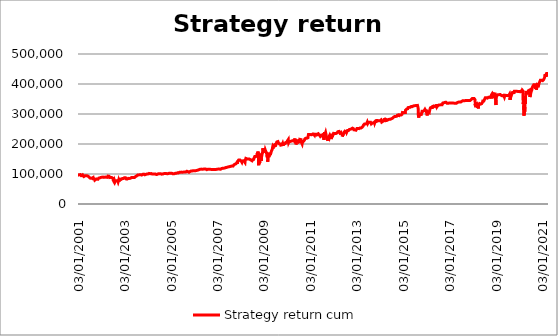
| Category | Strategy return |
|---|---|
| 03/01/2001 | 100000 |
| 04/01/2001 | 100000 |
| 05/01/2001 | 100000 |
| 08/01/2001 | 96560 |
| 09/01/2001 | 96955.896 |
| 10/01/2001 | 96955.896 |
| 11/01/2001 | 96955.896 |
| 12/01/2001 | 96955.896 |
| 16/01/2001 | 96955.896 |
| 17/01/2001 | 96955.896 |
| 18/01/2001 | 96955.896 |
| 19/01/2001 | 96955.896 |
| 22/01/2001 | 96955.896 |
| 23/01/2001 | 97721.848 |
| 24/01/2001 | 97721.848 |
| 25/01/2001 | 97721.848 |
| 26/01/2001 | 97721.848 |
| 29/01/2001 | 97721.848 |
| 30/01/2001 | 97721.848 |
| 31/01/2001 | 97721.848 |
| 01/02/2001 | 97721.848 |
| 02/02/2001 | 98435.217 |
| 05/02/2001 | 98435.217 |
| 06/02/2001 | 99114.42 |
| 07/02/2001 | 99114.42 |
| 08/02/2001 | 99114.42 |
| 09/02/2001 | 97984.516 |
| 12/02/2001 | 96936.081 |
| 13/02/2001 | 97866.668 |
| 14/02/2001 | 97866.668 |
| 15/02/2001 | 97377.334 |
| 16/02/2001 | 98419.272 |
| 20/02/2001 | 98419.272 |
| 21/02/2001 | 96795.354 |
| 22/02/2001 | 94491.624 |
| 23/02/2001 | 94567.218 |
| 26/02/2001 | 94567.218 |
| 27/02/2001 | 96666.61 |
| 28/02/2001 | 96666.61 |
| 01/03/2001 | 94878.278 |
| 02/03/2001 | 95001.619 |
| 05/03/2001 | 95001.619 |
| 06/03/2001 | 95695.131 |
| 07/03/2001 | 95695.131 |
| 08/03/2001 | 95695.131 |
| 09/03/2001 | 95695.131 |
| 12/03/2001 | 95695.131 |
| 13/03/2001 | 91379.281 |
| 14/03/2001 | 92896.177 |
| 15/03/2001 | 92896.177 |
| 16/03/2001 | 93239.893 |
| 19/03/2001 | 93239.893 |
| 20/03/2001 | 94871.591 |
| 21/03/2001 | 94871.591 |
| 22/03/2001 | 93040.569 |
| 23/03/2001 | 91924.082 |
| 26/03/2001 | 94957.577 |
| 27/03/2001 | 94957.577 |
| 28/03/2001 | 94957.577 |
| 29/03/2001 | 94957.577 |
| 30/03/2001 | 95137.997 |
| 02/04/2001 | 95137.997 |
| 03/04/2001 | 95137.997 |
| 04/04/2001 | 91399.073 |
| 05/04/2001 | 91755.53 |
| 06/04/2001 | 91755.53 |
| 09/04/2001 | 91755.53 |
| 10/04/2001 | 92627.207 |
| 11/04/2001 | 92627.207 |
| 12/04/2001 | 92627.207 |
| 16/04/2001 | 92627.207 |
| 17/04/2001 | 92627.207 |
| 18/04/2001 | 93766.522 |
| 19/04/2001 | 93766.522 |
| 20/04/2001 | 93766.522 |
| 23/04/2001 | 93766.522 |
| 24/04/2001 | 91769.295 |
| 25/04/2001 | 91007.61 |
| 26/04/2001 | 92254.414 |
| 27/04/2001 | 92254.414 |
| 30/04/2001 | 92254.414 |
| 01/05/2001 | 92254.414 |
| 02/05/2001 | 92254.414 |
| 03/05/2001 | 92254.414 |
| 04/05/2001 | 92254.414 |
| 07/05/2001 | 93758.161 |
| 08/05/2001 | 93758.161 |
| 09/05/2001 | 93758.161 |
| 10/05/2001 | 93758.161 |
| 11/05/2001 | 94058.187 |
| 14/05/2001 | 94058.187 |
| 15/05/2001 | 94076.999 |
| 16/05/2001 | 94076.999 |
| 17/05/2001 | 94076.999 |
| 18/05/2001 | 94076.999 |
| 21/05/2001 | 94076.999 |
| 22/05/2001 | 94076.999 |
| 23/05/2001 | 94076.999 |
| 24/05/2001 | 94076.999 |
| 25/05/2001 | 94387.453 |
| 29/05/2001 | 94387.453 |
| 30/05/2001 | 93556.843 |
| 31/05/2001 | 92088.001 |
| 01/06/2001 | 92686.573 |
| 04/06/2001 | 92686.573 |
| 05/06/2001 | 92686.573 |
| 06/06/2001 | 92686.573 |
| 07/06/2001 | 92686.573 |
| 08/06/2001 | 92881.215 |
| 11/06/2001 | 92881.215 |
| 12/06/2001 | 92054.572 |
| 13/06/2001 | 91934.901 |
| 14/06/2001 | 91934.901 |
| 15/06/2001 | 89562.98 |
| 18/06/2001 | 89804.8 |
| 19/06/2001 | 89804.8 |
| 20/06/2001 | 90146.059 |
| 21/06/2001 | 90146.059 |
| 22/06/2001 | 90146.059 |
| 25/06/2001 | 90146.059 |
| 26/06/2001 | 89235.583 |
| 27/06/2001 | 88994.647 |
| 28/06/2001 | 88994.647 |
| 29/06/2001 | 88994.647 |
| 02/07/2001 | 88994.647 |
| 03/07/2001 | 88994.647 |
| 05/07/2001 | 88994.647 |
| 06/07/2001 | 88994.647 |
| 09/07/2001 | 86743.083 |
| 10/07/2001 | 87254.867 |
| 11/07/2001 | 87254.867 |
| 12/07/2001 | 87158.887 |
| 13/07/2001 | 87158.887 |
| 16/07/2001 | 87158.887 |
| 17/07/2001 | 87158.887 |
| 18/07/2001 | 87943.317 |
| 19/07/2001 | 87943.317 |
| 20/07/2001 | 88787.572 |
| 23/07/2001 | 88787.572 |
| 24/07/2001 | 86958.548 |
| 25/07/2001 | 85862.871 |
| 26/07/2001 | 86918.984 |
| 27/07/2001 | 86918.984 |
| 30/07/2001 | 86918.984 |
| 31/07/2001 | 86918.984 |
| 01/08/2001 | 86918.984 |
| 02/08/2001 | 86918.984 |
| 03/08/2001 | 86918.984 |
| 06/08/2001 | 86918.984 |
| 07/08/2001 | 85606.507 |
| 08/08/2001 | 85974.615 |
| 09/08/2001 | 85974.615 |
| 10/08/2001 | 86155.162 |
| 13/08/2001 | 86155.162 |
| 14/08/2001 | 86155.162 |
| 15/08/2001 | 86155.162 |
| 16/08/2001 | 86155.162 |
| 17/08/2001 | 86473.936 |
| 20/08/2001 | 86473.936 |
| 21/08/2001 | 87304.086 |
| 22/08/2001 | 87304.086 |
| 23/08/2001 | 88212.048 |
| 24/08/2001 | 88212.048 |
| 27/08/2001 | 88212.048 |
| 28/08/2001 | 88212.048 |
| 29/08/2001 | 86827.119 |
| 30/08/2001 | 85932.8 |
| 31/08/2001 | 84042.278 |
| 04/09/2001 | 84512.915 |
| 05/09/2001 | 84512.915 |
| 06/09/2001 | 84512.915 |
| 07/09/2001 | 84512.915 |
| 10/09/2001 | 82814.206 |
| 17/09/2001 | 83857.665 |
| 18/09/2001 | 83857.665 |
| 19/09/2001 | 83547.391 |
| 20/09/2001 | 83547.391 |
| 21/09/2001 | 80581.459 |
| 24/09/2001 | 79558.074 |
| 25/09/2001 | 82708.574 |
| 26/09/2001 | 82708.574 |
| 27/09/2001 | 82708.574 |
| 28/09/2001 | 82708.574 |
| 01/10/2001 | 82708.574 |
| 02/10/2001 | 82708.574 |
| 03/10/2001 | 82708.574 |
| 04/10/2001 | 82708.574 |
| 05/10/2001 | 82708.574 |
| 08/10/2001 | 82708.574 |
| 09/10/2001 | 82708.574 |
| 10/10/2001 | 82212.323 |
| 11/10/2001 | 84251.188 |
| 12/10/2001 | 84251.188 |
| 15/10/2001 | 84251.188 |
| 16/10/2001 | 84124.811 |
| 17/10/2001 | 84124.811 |
| 18/10/2001 | 84124.811 |
| 19/10/2001 | 83864.024 |
| 22/10/2001 | 83864.024 |
| 23/10/2001 | 83864.024 |
| 24/10/2001 | 83864.024 |
| 25/10/2001 | 83587.273 |
| 26/10/2001 | 83587.273 |
| 29/10/2001 | 83587.273 |
| 30/10/2001 | 83587.273 |
| 31/10/2001 | 82408.693 |
| 01/11/2001 | 82540.547 |
| 02/11/2001 | 82540.547 |
| 05/11/2001 | 82540.547 |
| 06/11/2001 | 82540.547 |
| 07/11/2001 | 82540.547 |
| 08/11/2001 | 82540.547 |
| 09/11/2001 | 82540.547 |
| 12/11/2001 | 82540.547 |
| 13/11/2001 | 82540.547 |
| 14/11/2001 | 84571.044 |
| 15/11/2001 | 84571.044 |
| 16/11/2001 | 84571.044 |
| 19/11/2001 | 84571.044 |
| 20/11/2001 | 85712.753 |
| 21/11/2001 | 85712.753 |
| 23/11/2001 | 85121.335 |
| 26/11/2001 | 86432.204 |
| 27/11/2001 | 86432.204 |
| 28/11/2001 | 86432.204 |
| 29/11/2001 | 86432.204 |
| 30/11/2001 | 87711.4 |
| 03/12/2001 | 87711.4 |
| 04/12/2001 | 87711.4 |
| 05/12/2001 | 89263.892 |
| 06/12/2001 | 89263.892 |
| 07/12/2001 | 89263.892 |
| 10/12/2001 | 89263.892 |
| 11/12/2001 | 87469.688 |
| 12/12/2001 | 87242.267 |
| 13/12/2001 | 87242.267 |
| 14/12/2001 | 87242.267 |
| 17/12/2001 | 88062.344 |
| 18/12/2001 | 88062.344 |
| 19/12/2001 | 88062.344 |
| 20/12/2001 | 88062.344 |
| 21/12/2001 | 88062.344 |
| 24/12/2001 | 88590.718 |
| 26/12/2001 | 88590.718 |
| 27/12/2001 | 88590.718 |
| 28/12/2001 | 88590.718 |
| 31/12/2001 | 88590.718 |
| 02/01/2002 | 88590.718 |
| 03/01/2002 | 88989.376 |
| 04/01/2002 | 88989.376 |
| 07/01/2002 | 88989.376 |
| 08/01/2002 | 88989.376 |
| 09/01/2002 | 88695.711 |
| 10/01/2002 | 88695.711 |
| 11/01/2002 | 89077.103 |
| 14/01/2002 | 89077.103 |
| 15/01/2002 | 88435.748 |
| 16/01/2002 | 89178.608 |
| 17/01/2002 | 89178.608 |
| 18/01/2002 | 89900.955 |
| 22/01/2002 | 89900.955 |
| 23/01/2002 | 89226.698 |
| 24/01/2002 | 89904.82 |
| 25/01/2002 | 89904.82 |
| 28/01/2002 | 89904.82 |
| 29/01/2002 | 89904.82 |
| 30/01/2002 | 89904.82 |
| 31/01/2002 | 91253.393 |
| 01/02/2002 | 91253.393 |
| 04/02/2002 | 91253.393 |
| 05/02/2002 | 88725.674 |
| 06/02/2002 | 88166.702 |
| 07/02/2002 | 87655.335 |
| 08/02/2002 | 87094.341 |
| 11/02/2002 | 88836.228 |
| 12/02/2002 | 88836.228 |
| 13/02/2002 | 88836.228 |
| 14/02/2002 | 88836.228 |
| 15/02/2002 | 88836.228 |
| 19/02/2002 | 88836.228 |
| 20/02/2002 | 86970.667 |
| 21/02/2002 | 88501.351 |
| 22/02/2002 | 88501.351 |
| 25/02/2002 | 89660.718 |
| 26/02/2002 | 89660.718 |
| 27/02/2002 | 89660.718 |
| 28/02/2002 | 89660.718 |
| 01/03/2002 | 89660.718 |
| 04/03/2002 | 89660.718 |
| 05/03/2002 | 89660.718 |
| 06/03/2002 | 89660.718 |
| 07/03/2002 | 89660.718 |
| 08/03/2002 | 89660.718 |
| 11/03/2002 | 89660.718 |
| 12/03/2002 | 89660.718 |
| 13/03/2002 | 89660.718 |
| 14/03/2002 | 89660.718 |
| 15/03/2002 | 89508.295 |
| 18/03/2002 | 89508.295 |
| 19/03/2002 | 89508.295 |
| 20/03/2002 | 89508.295 |
| 21/03/2002 | 89508.295 |
| 22/03/2002 | 89553.049 |
| 25/03/2002 | 89553.049 |
| 26/03/2002 | 89553.049 |
| 27/03/2002 | 90099.323 |
| 28/03/2002 | 90099.323 |
| 01/04/2002 | 90099.323 |
| 02/04/2002 | 90099.323 |
| 03/04/2002 | 90099.323 |
| 04/04/2002 | 89423.578 |
| 05/04/2002 | 89030.114 |
| 08/04/2002 | 89030.114 |
| 09/04/2002 | 89030.114 |
| 10/04/2002 | 89030.114 |
| 11/04/2002 | 90036.155 |
| 12/04/2002 | 90036.155 |
| 15/04/2002 | 90756.444 |
| 16/04/2002 | 90756.444 |
| 17/04/2002 | 93070.733 |
| 18/04/2002 | 93070.733 |
| 19/04/2002 | 93070.733 |
| 22/04/2002 | 93405.788 |
| 23/04/2002 | 93405.788 |
| 24/04/2002 | 92938.759 |
| 25/04/2002 | 91869.963 |
| 26/04/2002 | 91943.459 |
| 29/04/2002 | 91943.459 |
| 30/04/2002 | 91281.466 |
| 01/05/2002 | 92449.869 |
| 02/05/2002 | 92449.869 |
| 03/05/2002 | 92449.869 |
| 06/05/2002 | 92449.869 |
| 07/05/2002 | 90415.972 |
| 08/05/2002 | 90009.1 |
| 09/05/2002 | 90009.1 |
| 10/05/2002 | 90009.1 |
| 13/05/2002 | 88154.913 |
| 14/05/2002 | 90156.029 |
| 15/05/2002 | 90156.029 |
| 16/05/2002 | 90156.029 |
| 17/05/2002 | 90156.029 |
| 20/05/2002 | 90156.029 |
| 21/05/2002 | 90156.029 |
| 22/05/2002 | 89200.375 |
| 23/05/2002 | 89378.776 |
| 24/05/2002 | 89378.776 |
| 28/05/2002 | 89378.776 |
| 29/05/2002 | 88833.565 |
| 30/05/2002 | 88034.063 |
| 31/05/2002 | 87849.192 |
| 03/06/2002 | 87849.192 |
| 04/06/2002 | 87849.192 |
| 05/06/2002 | 88103.954 |
| 06/06/2002 | 88103.954 |
| 07/06/2002 | 88103.954 |
| 10/06/2002 | 87980.609 |
| 11/06/2002 | 87980.609 |
| 12/06/2002 | 87980.609 |
| 13/06/2002 | 88561.281 |
| 14/06/2002 | 88561.281 |
| 17/06/2002 | 88393.014 |
| 18/06/2002 | 88393.014 |
| 19/06/2002 | 88393.014 |
| 20/06/2002 | 88393.014 |
| 21/06/2002 | 87182.03 |
| 24/06/2002 | 85656.345 |
| 25/06/2002 | 86136.02 |
| 26/06/2002 | 86136.02 |
| 27/06/2002 | 86161.861 |
| 28/06/2002 | 86161.861 |
| 01/07/2002 | 86161.861 |
| 02/07/2002 | 86161.861 |
| 03/07/2002 | 83964.734 |
| 05/07/2002 | 84535.694 |
| 08/07/2002 | 84535.694 |
| 09/07/2002 | 84535.694 |
| 10/07/2002 | 82185.601 |
| 11/07/2002 | 78791.336 |
| 12/07/2002 | 79563.491 |
| 15/07/2002 | 79563.491 |
| 16/07/2002 | 79881.745 |
| 17/07/2002 | 79881.745 |
| 18/07/2002 | 80057.485 |
| 19/07/2002 | 80057.485 |
| 22/07/2002 | 76783.134 |
| 23/07/2002 | 74256.969 |
| 24/07/2002 | 71865.894 |
| 25/07/2002 | 76781.522 |
| 26/07/2002 | 76781.522 |
| 29/07/2002 | 78570.531 |
| 30/07/2002 | 78570.531 |
| 31/07/2002 | 78570.531 |
| 01/08/2002 | 78570.531 |
| 02/08/2002 | 78570.531 |
| 05/08/2002 | 76653.41 |
| 06/08/2002 | 73525.951 |
| 07/08/2002 | 76253.764 |
| 08/08/2002 | 76253.764 |
| 09/08/2002 | 76253.764 |
| 12/08/2002 | 76253.764 |
| 13/08/2002 | 76253.764 |
| 14/08/2002 | 74599.057 |
| 15/08/2002 | 77732.217 |
| 16/08/2002 | 77732.217 |
| 19/08/2002 | 77732.217 |
| 20/08/2002 | 77732.217 |
| 21/08/2002 | 77732.217 |
| 22/08/2002 | 78898.201 |
| 23/08/2002 | 78898.201 |
| 26/08/2002 | 78898.201 |
| 27/08/2002 | 79513.607 |
| 28/08/2002 | 79513.607 |
| 29/08/2002 | 77597.329 |
| 30/08/2002 | 77550.77 |
| 03/09/2002 | 77550.77 |
| 04/09/2002 | 77550.77 |
| 05/09/2002 | 78752.807 |
| 06/09/2002 | 78752.807 |
| 09/09/2002 | 79894.723 |
| 10/09/2002 | 79894.723 |
| 11/09/2002 | 79894.723 |
| 12/09/2002 | 79894.723 |
| 13/09/2002 | 78224.923 |
| 16/09/2002 | 78397.018 |
| 17/09/2002 | 78397.018 |
| 18/09/2002 | 78397.018 |
| 19/09/2002 | 77503.292 |
| 20/09/2002 | 75255.697 |
| 23/09/2002 | 75308.376 |
| 24/09/2002 | 75308.376 |
| 25/09/2002 | 73885.047 |
| 26/09/2002 | 76005.548 |
| 27/09/2002 | 76005.548 |
| 30/09/2002 | 76005.548 |
| 01/10/2002 | 74918.669 |
| 02/10/2002 | 79039.196 |
| 03/10/2002 | 79039.196 |
| 04/10/2002 | 77948.455 |
| 07/10/2002 | 76342.717 |
| 08/10/2002 | 74457.051 |
| 09/10/2002 | 75819.615 |
| 10/10/2002 | 75819.615 |
| 11/10/2002 | 78609.777 |
| 14/10/2002 | 78609.777 |
| 15/10/2002 | 78609.777 |
| 16/10/2002 | 78609.777 |
| 17/10/2002 | 78609.777 |
| 18/10/2002 | 80347.053 |
| 21/10/2002 | 80347.053 |
| 22/10/2002 | 80347.053 |
| 23/10/2002 | 80347.053 |
| 24/10/2002 | 81038.038 |
| 25/10/2002 | 81038.038 |
| 28/10/2002 | 82950.536 |
| 29/10/2002 | 82950.536 |
| 30/10/2002 | 81872.179 |
| 31/10/2002 | 82740.024 |
| 01/11/2002 | 82740.024 |
| 04/11/2002 | 84121.782 |
| 05/11/2002 | 84121.782 |
| 06/11/2002 | 84121.782 |
| 07/11/2002 | 84121.782 |
| 08/11/2002 | 84121.782 |
| 11/11/2002 | 82960.902 |
| 12/11/2002 | 81509.086 |
| 13/11/2002 | 82250.819 |
| 14/11/2002 | 82250.819 |
| 15/11/2002 | 82250.819 |
| 18/11/2002 | 82250.819 |
| 19/11/2002 | 82250.819 |
| 20/11/2002 | 82045.192 |
| 21/11/2002 | 82045.192 |
| 22/11/2002 | 82045.192 |
| 25/11/2002 | 82045.192 |
| 26/11/2002 | 82143.646 |
| 27/11/2002 | 82143.646 |
| 29/11/2002 | 84846.172 |
| 02/12/2002 | 84846.172 |
| 03/12/2002 | 84846.172 |
| 04/12/2002 | 84846.172 |
| 05/12/2002 | 84354.064 |
| 06/12/2002 | 83265.896 |
| 09/12/2002 | 83807.125 |
| 10/12/2002 | 83807.125 |
| 11/12/2002 | 85148.039 |
| 12/12/2002 | 85148.039 |
| 13/12/2002 | 85148.039 |
| 16/12/2002 | 85148.039 |
| 17/12/2002 | 87625.847 |
| 18/12/2002 | 87625.847 |
| 19/12/2002 | 86469.186 |
| 20/12/2002 | 85725.551 |
| 23/12/2002 | 87045.724 |
| 24/12/2002 | 87045.724 |
| 26/12/2002 | 87045.724 |
| 27/12/2002 | 86958.678 |
| 30/12/2002 | 86958.678 |
| 31/12/2002 | 87610.868 |
| 02/01/2003 | 87610.868 |
| 03/01/2003 | 87610.868 |
| 06/01/2003 | 87610.868 |
| 07/01/2003 | 87610.868 |
| 08/01/2003 | 87610.868 |
| 09/01/2003 | 87610.868 |
| 10/01/2003 | 89214.147 |
| 13/01/2003 | 89214.147 |
| 14/01/2003 | 89214.147 |
| 15/01/2003 | 89214.147 |
| 16/01/2003 | 89214.147 |
| 17/01/2003 | 88723.469 |
| 21/01/2003 | 87250.66 |
| 22/01/2003 | 85662.698 |
| 23/01/2003 | 84463.42 |
| 24/01/2003 | 85063.11 |
| 27/01/2003 | 85063.11 |
| 28/01/2003 | 83600.025 |
| 29/01/2003 | 84419.305 |
| 30/01/2003 | 84419.305 |
| 31/01/2003 | 84419.305 |
| 03/02/2003 | 86116.133 |
| 04/02/2003 | 86116.133 |
| 05/02/2003 | 86116.133 |
| 06/02/2003 | 85564.99 |
| 07/02/2003 | 85102.939 |
| 10/02/2003 | 83945.539 |
| 11/02/2003 | 84583.525 |
| 12/02/2003 | 84583.525 |
| 13/02/2003 | 83069.48 |
| 14/02/2003 | 83335.302 |
| 18/02/2003 | 83335.302 |
| 19/02/2003 | 83335.302 |
| 20/02/2003 | 83335.302 |
| 21/02/2003 | 82435.281 |
| 24/02/2003 | 83391.53 |
| 25/02/2003 | 83391.53 |
| 26/02/2003 | 84225.446 |
| 27/02/2003 | 84225.446 |
| 28/02/2003 | 85446.715 |
| 03/03/2003 | 85446.715 |
| 04/03/2003 | 85446.715 |
| 05/03/2003 | 83900.129 |
| 06/03/2003 | 84747.52 |
| 07/03/2003 | 84747.52 |
| 10/03/2003 | 85544.147 |
| 11/03/2003 | 85544.147 |
| 12/03/2003 | 84628.825 |
| 13/03/2003 | 85297.392 |
| 14/03/2003 | 85297.392 |
| 17/03/2003 | 85297.392 |
| 18/03/2003 | 85297.392 |
| 19/03/2003 | 85297.392 |
| 20/03/2003 | 85297.392 |
| 21/03/2003 | 85297.392 |
| 24/03/2003 | 85297.392 |
| 25/03/2003 | 85297.392 |
| 26/03/2003 | 86278.312 |
| 27/03/2003 | 86278.312 |
| 28/03/2003 | 86217.918 |
| 31/03/2003 | 86217.918 |
| 01/04/2003 | 84398.72 |
| 02/04/2003 | 85504.343 |
| 03/04/2003 | 85504.343 |
| 04/04/2003 | 85504.343 |
| 07/04/2003 | 86085.772 |
| 08/04/2003 | 86085.772 |
| 09/04/2003 | 86085.772 |
| 10/04/2003 | 86085.772 |
| 11/04/2003 | 86653.938 |
| 14/04/2003 | 86653.938 |
| 15/04/2003 | 86653.938 |
| 16/04/2003 | 86653.938 |
| 17/04/2003 | 86653.938 |
| 21/04/2003 | 88049.067 |
| 22/04/2003 | 88049.067 |
| 23/04/2003 | 88049.067 |
| 24/04/2003 | 88049.067 |
| 25/04/2003 | 88049.067 |
| 28/04/2003 | 86816.38 |
| 29/04/2003 | 88457.209 |
| 30/04/2003 | 88457.209 |
| 01/05/2003 | 88457.209 |
| 02/05/2003 | 88457.209 |
| 05/05/2003 | 88457.209 |
| 06/05/2003 | 88457.209 |
| 07/05/2003 | 88457.209 |
| 08/05/2003 | 88457.209 |
| 09/05/2003 | 87493.026 |
| 12/05/2003 | 88752.925 |
| 13/05/2003 | 88752.925 |
| 14/05/2003 | 88752.925 |
| 15/05/2003 | 88752.925 |
| 16/05/2003 | 88752.925 |
| 19/05/2003 | 88752.925 |
| 20/05/2003 | 88752.925 |
| 21/05/2003 | 88397.914 |
| 22/05/2003 | 88397.914 |
| 23/05/2003 | 88397.914 |
| 27/05/2003 | 88397.914 |
| 28/05/2003 | 88397.914 |
| 29/05/2003 | 88397.914 |
| 30/05/2003 | 88397.914 |
| 02/06/2003 | 88397.914 |
| 03/06/2003 | 88397.914 |
| 04/06/2003 | 88397.914 |
| 05/06/2003 | 88397.914 |
| 06/06/2003 | 88397.914 |
| 09/06/2003 | 88397.914 |
| 10/06/2003 | 88397.914 |
| 11/06/2003 | 89387.97 |
| 12/06/2003 | 89387.97 |
| 13/06/2003 | 89387.97 |
| 16/06/2003 | 89387.97 |
| 17/06/2003 | 91479.649 |
| 18/06/2003 | 91479.649 |
| 19/06/2003 | 91479.649 |
| 20/06/2003 | 91479.649 |
| 23/06/2003 | 91250.95 |
| 24/06/2003 | 91250.95 |
| 25/06/2003 | 91305.7 |
| 26/06/2003 | 91305.7 |
| 27/06/2003 | 92510.936 |
| 30/06/2003 | 92510.936 |
| 01/07/2003 | 92510.936 |
| 02/07/2003 | 92510.936 |
| 03/07/2003 | 92510.936 |
| 07/07/2003 | 92510.936 |
| 08/07/2003 | 94610.934 |
| 09/07/2003 | 94610.934 |
| 10/07/2003 | 94610.934 |
| 11/07/2003 | 93324.225 |
| 14/07/2003 | 94220.138 |
| 15/07/2003 | 94220.138 |
| 16/07/2003 | 94220.138 |
| 17/07/2003 | 94220.138 |
| 18/07/2003 | 92712.615 |
| 21/07/2003 | 93741.725 |
| 22/07/2003 | 93741.725 |
| 23/07/2003 | 94679.143 |
| 24/07/2003 | 94679.143 |
| 25/07/2003 | 94679.143 |
| 28/07/2003 | 96459.111 |
| 29/07/2003 | 96459.111 |
| 30/07/2003 | 96459.111 |
| 31/07/2003 | 96189.025 |
| 01/08/2003 | 96189.025 |
| 04/08/2003 | 96189.025 |
| 05/08/2003 | 96275.595 |
| 06/08/2003 | 96275.595 |
| 07/08/2003 | 96891.759 |
| 08/08/2003 | 96891.759 |
| 11/08/2003 | 96891.759 |
| 12/08/2003 | 96891.759 |
| 13/08/2003 | 96891.759 |
| 14/08/2003 | 96891.759 |
| 15/08/2003 | 97221.191 |
| 18/08/2003 | 97221.191 |
| 19/08/2003 | 97221.191 |
| 20/08/2003 | 97221.191 |
| 21/08/2003 | 97221.191 |
| 22/08/2003 | 97221.191 |
| 25/08/2003 | 97221.191 |
| 26/08/2003 | 97357.301 |
| 27/08/2003 | 97357.301 |
| 28/08/2003 | 97357.301 |
| 29/08/2003 | 97357.301 |
| 02/09/2003 | 97357.301 |
| 03/09/2003 | 97357.301 |
| 04/09/2003 | 97357.301 |
| 05/09/2003 | 97357.301 |
| 08/09/2003 | 97357.301 |
| 09/09/2003 | 98233.516 |
| 10/09/2003 | 98233.516 |
| 11/09/2003 | 97113.654 |
| 12/09/2003 | 97463.263 |
| 15/09/2003 | 97463.263 |
| 16/09/2003 | 97463.263 |
| 17/09/2003 | 97463.263 |
| 18/09/2003 | 97463.263 |
| 19/09/2003 | 97463.263 |
| 22/09/2003 | 97463.263 |
| 23/09/2003 | 97463.263 |
| 24/09/2003 | 97911.594 |
| 25/09/2003 | 97911.594 |
| 26/09/2003 | 96883.523 |
| 29/09/2003 | 96534.742 |
| 30/09/2003 | 96534.742 |
| 01/10/2003 | 96534.742 |
| 02/10/2003 | 98967.418 |
| 03/10/2003 | 98967.418 |
| 06/10/2003 | 98967.418 |
| 07/10/2003 | 98967.418 |
| 08/10/2003 | 98967.418 |
| 09/10/2003 | 98967.418 |
| 10/10/2003 | 98967.418 |
| 13/10/2003 | 98967.418 |
| 14/10/2003 | 98967.418 |
| 15/10/2003 | 98967.418 |
| 16/10/2003 | 98967.418 |
| 17/10/2003 | 98967.418 |
| 20/10/2003 | 98967.418 |
| 21/10/2003 | 99759.157 |
| 22/10/2003 | 99759.157 |
| 23/10/2003 | 99759.157 |
| 24/10/2003 | 99539.687 |
| 27/10/2003 | 99539.687 |
| 28/10/2003 | 99539.687 |
| 29/10/2003 | 99539.687 |
| 30/10/2003 | 99539.687 |
| 31/10/2003 | 99539.687 |
| 03/11/2003 | 99539.687 |
| 04/11/2003 | 99539.687 |
| 05/11/2003 | 99539.687 |
| 06/11/2003 | 99539.687 |
| 07/11/2003 | 99539.687 |
| 10/11/2003 | 99539.687 |
| 11/11/2003 | 99091.758 |
| 12/11/2003 | 99091.758 |
| 13/11/2003 | 99091.758 |
| 14/11/2003 | 99091.758 |
| 17/11/2003 | 99091.758 |
| 18/11/2003 | 98517.026 |
| 19/11/2003 | 97393.932 |
| 20/11/2003 | 98260.738 |
| 21/11/2003 | 98260.738 |
| 24/11/2003 | 98712.737 |
| 25/11/2003 | 98712.737 |
| 26/11/2003 | 98712.737 |
| 28/11/2003 | 98712.737 |
| 01/12/2003 | 98712.737 |
| 02/12/2003 | 98712.737 |
| 03/12/2003 | 98712.737 |
| 04/12/2003 | 98712.737 |
| 05/12/2003 | 98712.737 |
| 08/12/2003 | 98712.737 |
| 09/12/2003 | 99403.726 |
| 10/12/2003 | 99403.726 |
| 11/12/2003 | 99433.548 |
| 12/12/2003 | 99433.548 |
| 15/12/2003 | 99433.548 |
| 16/12/2003 | 99433.548 |
| 17/12/2003 | 100079.866 |
| 18/12/2003 | 100079.866 |
| 19/12/2003 | 100079.866 |
| 22/12/2003 | 100079.866 |
| 23/12/2003 | 100079.866 |
| 24/12/2003 | 100079.866 |
| 26/12/2003 | 100079.866 |
| 29/12/2003 | 100079.866 |
| 30/12/2003 | 100079.866 |
| 31/12/2003 | 100079.866 |
| 02/01/2004 | 100079.866 |
| 05/01/2004 | 100079.866 |
| 06/01/2004 | 100079.866 |
| 07/01/2004 | 100079.866 |
| 08/01/2004 | 100079.866 |
| 09/01/2004 | 100079.866 |
| 12/01/2004 | 100079.866 |
| 13/01/2004 | 100890.513 |
| 14/01/2004 | 100890.513 |
| 15/01/2004 | 101879.24 |
| 16/01/2004 | 101879.24 |
| 20/01/2004 | 101879.24 |
| 21/01/2004 | 101879.24 |
| 22/01/2004 | 101879.24 |
| 23/01/2004 | 101879.24 |
| 26/01/2004 | 101879.24 |
| 27/01/2004 | 101879.24 |
| 28/01/2004 | 101879.24 |
| 29/01/2004 | 100585.373 |
| 30/01/2004 | 100685.959 |
| 02/02/2004 | 100685.959 |
| 03/02/2004 | 100685.959 |
| 04/02/2004 | 100685.959 |
| 05/02/2004 | 100685.959 |
| 06/02/2004 | 100927.605 |
| 09/02/2004 | 100927.605 |
| 10/02/2004 | 100927.605 |
| 11/02/2004 | 100927.605 |
| 12/02/2004 | 100927.605 |
| 13/02/2004 | 100927.605 |
| 17/02/2004 | 100927.605 |
| 18/02/2004 | 101967.159 |
| 19/02/2004 | 101967.159 |
| 20/02/2004 | 101579.684 |
| 23/02/2004 | 101579.684 |
| 24/02/2004 | 101579.684 |
| 25/02/2004 | 101579.684 |
| 26/02/2004 | 101579.684 |
| 27/02/2004 | 101579.684 |
| 01/03/2004 | 101579.684 |
| 02/03/2004 | 101579.684 |
| 03/03/2004 | 101579.684 |
| 04/03/2004 | 101752.369 |
| 05/03/2004 | 101752.369 |
| 08/03/2004 | 101752.369 |
| 09/03/2004 | 101752.369 |
| 10/03/2004 | 101314.834 |
| 11/03/2004 | 101314.834 |
| 12/03/2004 | 99845.769 |
| 15/03/2004 | 101213.656 |
| 16/03/2004 | 101213.656 |
| 17/03/2004 | 101739.967 |
| 18/03/2004 | 101739.967 |
| 19/03/2004 | 101739.967 |
| 22/03/2004 | 101739.967 |
| 23/03/2004 | 100325.782 |
| 24/03/2004 | 100125.13 |
| 25/03/2004 | 100125.13 |
| 26/03/2004 | 100125.13 |
| 29/03/2004 | 100125.13 |
| 30/03/2004 | 100125.13 |
| 31/03/2004 | 100125.13 |
| 01/04/2004 | 100125.13 |
| 02/04/2004 | 100125.13 |
| 05/04/2004 | 100125.13 |
| 06/04/2004 | 100125.13 |
| 07/04/2004 | 100125.13 |
| 08/04/2004 | 100125.13 |
| 12/04/2004 | 100125.13 |
| 13/04/2004 | 100125.13 |
| 14/04/2004 | 100125.13 |
| 15/04/2004 | 100275.318 |
| 16/04/2004 | 100275.318 |
| 19/04/2004 | 100275.318 |
| 20/04/2004 | 100275.318 |
| 21/04/2004 | 100275.318 |
| 22/04/2004 | 101067.493 |
| 23/04/2004 | 101067.493 |
| 26/04/2004 | 101067.493 |
| 27/04/2004 | 101067.493 |
| 28/04/2004 | 101067.493 |
| 29/04/2004 | 101067.493 |
| 30/04/2004 | 100127.565 |
| 03/05/2004 | 99336.557 |
| 04/05/2004 | 100319.989 |
| 05/05/2004 | 100319.989 |
| 06/05/2004 | 100319.989 |
| 07/05/2004 | 100319.989 |
| 10/05/2004 | 98584.453 |
| 11/05/2004 | 97401.44 |
| 12/05/2004 | 98268.313 |
| 13/05/2004 | 98268.313 |
| 14/05/2004 | 98268.313 |
| 17/05/2004 | 98366.581 |
| 18/05/2004 | 98366.581 |
| 19/05/2004 | 98838.741 |
| 20/05/2004 | 98838.741 |
| 21/05/2004 | 98838.741 |
| 24/05/2004 | 98838.741 |
| 25/05/2004 | 98838.741 |
| 26/05/2004 | 98838.741 |
| 27/05/2004 | 98838.741 |
| 28/05/2004 | 98838.741 |
| 01/06/2004 | 98838.741 |
| 02/06/2004 | 98838.741 |
| 03/06/2004 | 98838.741 |
| 04/06/2004 | 98838.741 |
| 07/06/2004 | 99639.335 |
| 08/06/2004 | 99639.335 |
| 09/06/2004 | 99639.335 |
| 10/06/2004 | 99639.335 |
| 14/06/2004 | 100117.603 |
| 15/06/2004 | 100117.603 |
| 16/06/2004 | 100948.579 |
| 17/06/2004 | 100948.579 |
| 18/06/2004 | 100948.579 |
| 21/06/2004 | 100948.579 |
| 22/06/2004 | 100948.579 |
| 23/06/2004 | 100948.579 |
| 24/06/2004 | 100948.579 |
| 25/06/2004 | 100948.579 |
| 28/06/2004 | 100948.579 |
| 29/06/2004 | 100605.354 |
| 30/06/2004 | 100605.354 |
| 01/07/2004 | 100605.354 |
| 02/07/2004 | 100605.354 |
| 06/07/2004 | 100555.052 |
| 07/07/2004 | 100555.052 |
| 08/07/2004 | 100856.717 |
| 09/07/2004 | 100856.717 |
| 12/07/2004 | 101058.43 |
| 13/07/2004 | 101058.43 |
| 14/07/2004 | 101058.43 |
| 15/07/2004 | 101058.43 |
| 16/07/2004 | 101058.43 |
| 19/07/2004 | 100987.689 |
| 20/07/2004 | 100987.689 |
| 21/07/2004 | 100987.689 |
| 22/07/2004 | 100987.689 |
| 23/07/2004 | 101320.949 |
| 26/07/2004 | 101320.949 |
| 27/07/2004 | 101067.646 |
| 28/07/2004 | 101067.646 |
| 29/07/2004 | 101067.646 |
| 30/07/2004 | 101067.646 |
| 02/08/2004 | 101067.646 |
| 03/08/2004 | 101067.646 |
| 04/08/2004 | 101067.646 |
| 05/08/2004 | 101037.326 |
| 06/08/2004 | 101037.326 |
| 09/08/2004 | 99491.455 |
| 10/08/2004 | 99571.048 |
| 11/08/2004 | 99571.048 |
| 12/08/2004 | 99571.048 |
| 13/08/2004 | 99571.048 |
| 16/08/2004 | 99829.933 |
| 17/08/2004 | 99829.933 |
| 18/08/2004 | 99829.933 |
| 19/08/2004 | 99829.933 |
| 20/08/2004 | 99829.933 |
| 23/08/2004 | 99829.933 |
| 24/08/2004 | 99829.933 |
| 25/08/2004 | 99829.933 |
| 26/08/2004 | 99829.933 |
| 27/08/2004 | 99829.933 |
| 30/08/2004 | 99829.933 |
| 31/08/2004 | 99829.933 |
| 01/09/2004 | 100329.082 |
| 02/09/2004 | 100329.082 |
| 03/09/2004 | 100329.082 |
| 07/09/2004 | 100329.082 |
| 08/09/2004 | 101091.584 |
| 09/09/2004 | 101091.584 |
| 10/09/2004 | 101091.584 |
| 13/09/2004 | 101091.584 |
| 14/09/2004 | 101091.584 |
| 15/09/2004 | 101091.584 |
| 16/09/2004 | 101091.584 |
| 17/09/2004 | 101465.622 |
| 20/09/2004 | 101465.622 |
| 21/09/2004 | 101465.622 |
| 22/09/2004 | 101962.804 |
| 23/09/2004 | 101962.804 |
| 24/09/2004 | 101381.616 |
| 27/09/2004 | 101807.419 |
| 28/09/2004 | 101807.419 |
| 29/09/2004 | 102265.552 |
| 30/09/2004 | 102265.552 |
| 01/10/2004 | 102265.552 |
| 04/10/2004 | 102265.552 |
| 05/10/2004 | 102265.552 |
| 06/10/2004 | 102265.552 |
| 07/10/2004 | 102265.552 |
| 08/10/2004 | 102265.552 |
| 11/10/2004 | 101324.709 |
| 12/10/2004 | 101719.875 |
| 13/10/2004 | 101719.875 |
| 14/10/2004 | 101719.875 |
| 15/10/2004 | 100794.225 |
| 18/10/2004 | 101318.354 |
| 19/10/2004 | 101318.354 |
| 20/10/2004 | 101318.354 |
| 21/10/2004 | 101146.113 |
| 22/10/2004 | 101146.113 |
| 25/10/2004 | 101146.113 |
| 26/10/2004 | 101065.196 |
| 27/10/2004 | 101065.196 |
| 28/10/2004 | 101065.196 |
| 29/10/2004 | 101065.196 |
| 01/11/2004 | 101065.196 |
| 02/11/2004 | 101065.196 |
| 03/11/2004 | 101065.196 |
| 04/11/2004 | 101065.196 |
| 05/11/2004 | 101065.196 |
| 08/11/2004 | 101065.196 |
| 09/11/2004 | 101065.196 |
| 10/11/2004 | 101065.196 |
| 11/11/2004 | 101065.196 |
| 12/11/2004 | 101065.196 |
| 15/11/2004 | 101065.196 |
| 16/11/2004 | 101065.196 |
| 17/11/2004 | 101065.196 |
| 18/11/2004 | 101701.907 |
| 19/11/2004 | 101701.907 |
| 22/11/2004 | 101701.907 |
| 23/11/2004 | 102251.097 |
| 24/11/2004 | 102251.097 |
| 26/11/2004 | 102251.097 |
| 29/11/2004 | 102251.097 |
| 30/11/2004 | 102251.097 |
| 01/12/2004 | 102251.097 |
| 02/12/2004 | 102251.097 |
| 03/12/2004 | 102251.097 |
| 06/12/2004 | 102251.097 |
| 07/12/2004 | 102251.097 |
| 08/12/2004 | 102251.097 |
| 09/12/2004 | 102844.154 |
| 10/12/2004 | 102844.154 |
| 13/12/2004 | 102844.154 |
| 14/12/2004 | 102844.154 |
| 15/12/2004 | 102844.154 |
| 16/12/2004 | 102844.154 |
| 17/12/2004 | 102844.154 |
| 20/12/2004 | 102844.154 |
| 21/12/2004 | 102895.576 |
| 22/12/2004 | 102895.576 |
| 23/12/2004 | 102895.576 |
| 27/12/2004 | 102895.576 |
| 28/12/2004 | 102895.576 |
| 29/12/2004 | 102895.576 |
| 30/12/2004 | 102895.576 |
| 31/12/2004 | 102895.576 |
| 03/01/2005 | 102895.576 |
| 04/01/2005 | 102895.576 |
| 05/01/2005 | 101475.617 |
| 06/01/2005 | 100755.14 |
| 07/01/2005 | 101218.614 |
| 10/01/2005 | 101218.614 |
| 11/01/2005 | 101218.614 |
| 12/01/2005 | 101218.614 |
| 13/01/2005 | 101542.513 |
| 14/01/2005 | 101542.513 |
| 18/01/2005 | 102080.689 |
| 19/01/2005 | 102080.689 |
| 20/01/2005 | 102080.689 |
| 21/01/2005 | 101417.164 |
| 24/01/2005 | 100666.677 |
| 25/01/2005 | 100455.277 |
| 26/01/2005 | 100455.277 |
| 27/01/2005 | 100455.277 |
| 28/01/2005 | 100455.277 |
| 31/01/2005 | 100455.277 |
| 01/02/2005 | 100455.277 |
| 02/02/2005 | 100455.277 |
| 03/02/2005 | 100455.277 |
| 04/02/2005 | 100455.277 |
| 07/02/2005 | 100455.277 |
| 08/02/2005 | 100455.277 |
| 09/02/2005 | 100455.277 |
| 10/02/2005 | 100455.277 |
| 11/02/2005 | 100776.734 |
| 14/02/2005 | 100776.734 |
| 15/02/2005 | 100776.734 |
| 16/02/2005 | 100776.734 |
| 17/02/2005 | 100776.734 |
| 18/02/2005 | 100776.734 |
| 22/02/2005 | 100887.588 |
| 23/02/2005 | 100887.588 |
| 24/02/2005 | 101634.157 |
| 25/02/2005 | 101634.157 |
| 28/02/2005 | 101634.157 |
| 01/03/2005 | 101634.157 |
| 02/03/2005 | 102182.981 |
| 03/03/2005 | 102182.981 |
| 04/03/2005 | 102182.981 |
| 07/03/2005 | 102182.981 |
| 08/03/2005 | 102182.981 |
| 09/03/2005 | 102182.981 |
| 10/03/2005 | 102182.981 |
| 11/03/2005 | 102418.002 |
| 14/03/2005 | 102418.002 |
| 15/03/2005 | 103042.752 |
| 16/03/2005 | 103042.752 |
| 17/03/2005 | 102032.933 |
| 18/03/2005 | 102216.592 |
| 21/03/2005 | 102216.592 |
| 22/03/2005 | 102216.592 |
| 23/03/2005 | 102216.592 |
| 24/03/2005 | 102237.035 |
| 28/03/2005 | 102237.035 |
| 29/03/2005 | 102237.035 |
| 30/03/2005 | 102237.035 |
| 31/03/2005 | 103729.696 |
| 01/04/2005 | 103729.696 |
| 04/04/2005 | 103729.696 |
| 05/04/2005 | 103926.782 |
| 06/04/2005 | 103926.782 |
| 07/04/2005 | 103926.782 |
| 08/04/2005 | 103926.782 |
| 11/04/2005 | 103926.782 |
| 12/04/2005 | 103947.568 |
| 13/04/2005 | 103947.568 |
| 14/04/2005 | 103947.568 |
| 15/04/2005 | 102440.328 |
| 18/04/2005 | 100791.039 |
| 19/04/2005 | 101103.491 |
| 20/04/2005 | 101103.491 |
| 21/04/2005 | 101103.491 |
| 22/04/2005 | 103226.664 |
| 25/04/2005 | 103226.664 |
| 26/04/2005 | 103226.664 |
| 27/04/2005 | 103226.664 |
| 28/04/2005 | 103567.312 |
| 29/04/2005 | 103567.312 |
| 02/05/2005 | 105120.822 |
| 03/05/2005 | 105120.822 |
| 04/05/2005 | 105120.822 |
| 05/05/2005 | 105120.822 |
| 06/05/2005 | 105120.822 |
| 09/05/2005 | 105120.822 |
| 10/05/2005 | 105120.822 |
| 11/05/2005 | 105120.822 |
| 12/05/2005 | 105741.035 |
| 13/05/2005 | 105741.035 |
| 16/05/2005 | 105487.256 |
| 17/05/2005 | 105487.256 |
| 18/05/2005 | 105487.256 |
| 19/05/2005 | 105487.256 |
| 20/05/2005 | 105487.256 |
| 23/05/2005 | 105487.256 |
| 24/05/2005 | 105487.256 |
| 25/05/2005 | 105487.256 |
| 26/05/2005 | 105487.256 |
| 27/05/2005 | 105487.256 |
| 31/05/2005 | 105487.256 |
| 01/06/2005 | 105487.256 |
| 02/06/2005 | 106362.801 |
| 03/06/2005 | 106362.801 |
| 06/06/2005 | 106362.801 |
| 07/06/2005 | 106309.619 |
| 08/06/2005 | 106309.619 |
| 09/06/2005 | 106309.619 |
| 10/06/2005 | 106309.619 |
| 13/06/2005 | 106309.619 |
| 14/06/2005 | 106309.619 |
| 15/06/2005 | 106309.619 |
| 16/06/2005 | 106309.619 |
| 17/06/2005 | 106309.619 |
| 20/06/2005 | 106309.619 |
| 21/06/2005 | 106309.619 |
| 22/06/2005 | 106309.619 |
| 23/06/2005 | 106309.619 |
| 24/06/2005 | 106309.619 |
| 27/06/2005 | 105501.666 |
| 28/06/2005 | 105554.417 |
| 29/06/2005 | 105554.417 |
| 30/06/2005 | 105554.417 |
| 01/07/2005 | 105554.417 |
| 05/07/2005 | 105997.745 |
| 06/07/2005 | 105997.745 |
| 07/07/2005 | 105997.745 |
| 08/07/2005 | 106411.137 |
| 11/07/2005 | 106411.137 |
| 12/07/2005 | 106411.137 |
| 13/07/2005 | 106411.137 |
| 14/07/2005 | 106411.137 |
| 15/07/2005 | 106411.137 |
| 18/07/2005 | 106411.137 |
| 19/07/2005 | 106411.137 |
| 20/07/2005 | 106411.137 |
| 21/07/2005 | 106411.137 |
| 22/07/2005 | 106411.137 |
| 25/07/2005 | 107081.527 |
| 26/07/2005 | 107081.527 |
| 27/07/2005 | 107081.527 |
| 28/07/2005 | 107081.527 |
| 29/07/2005 | 107081.527 |
| 01/08/2005 | 107081.527 |
| 02/08/2005 | 107156.484 |
| 03/08/2005 | 107156.484 |
| 04/08/2005 | 107156.484 |
| 05/08/2005 | 107156.484 |
| 08/08/2005 | 106374.242 |
| 09/08/2005 | 106140.218 |
| 10/08/2005 | 106140.218 |
| 11/08/2005 | 106140.218 |
| 12/08/2005 | 106140.218 |
| 15/08/2005 | 106140.218 |
| 16/08/2005 | 106755.831 |
| 17/08/2005 | 106755.831 |
| 18/08/2005 | 106755.831 |
| 19/08/2005 | 106755.831 |
| 22/08/2005 | 106755.831 |
| 23/08/2005 | 106755.831 |
| 24/08/2005 | 106755.831 |
| 25/08/2005 | 106755.831 |
| 26/08/2005 | 107097.45 |
| 29/08/2005 | 107097.45 |
| 30/08/2005 | 107932.81 |
| 31/08/2005 | 107932.81 |
| 01/09/2005 | 109217.211 |
| 02/09/2005 | 109217.211 |
| 06/09/2005 | 109217.211 |
| 07/09/2005 | 109217.211 |
| 08/09/2005 | 109217.211 |
| 09/09/2005 | 109217.211 |
| 12/09/2005 | 109217.211 |
| 13/09/2005 | 109217.211 |
| 14/09/2005 | 109217.211 |
| 15/09/2005 | 108824.029 |
| 16/09/2005 | 108824.029 |
| 19/09/2005 | 108824.029 |
| 20/09/2005 | 108824.029 |
| 21/09/2005 | 108824.029 |
| 22/09/2005 | 107692.259 |
| 23/09/2005 | 108058.412 |
| 26/09/2005 | 108058.412 |
| 27/09/2005 | 108058.412 |
| 28/09/2005 | 108058.412 |
| 29/09/2005 | 108058.412 |
| 30/09/2005 | 108058.412 |
| 03/10/2005 | 108058.412 |
| 04/10/2005 | 108058.412 |
| 05/10/2005 | 108058.412 |
| 06/10/2005 | 106480.76 |
| 07/10/2005 | 106108.077 |
| 10/10/2005 | 106108.077 |
| 11/10/2005 | 106108.077 |
| 12/10/2005 | 105959.526 |
| 13/10/2005 | 105959.526 |
| 14/10/2005 | 105906.546 |
| 17/10/2005 | 105906.546 |
| 18/10/2005 | 105906.546 |
| 19/10/2005 | 105906.546 |
| 20/10/2005 | 107802.273 |
| 21/10/2005 | 107802.273 |
| 24/10/2005 | 108233.482 |
| 25/10/2005 | 108233.482 |
| 26/10/2005 | 108233.482 |
| 27/10/2005 | 108233.482 |
| 28/10/2005 | 108233.482 |
| 31/10/2005 | 109986.865 |
| 01/11/2005 | 109986.865 |
| 02/11/2005 | 109986.865 |
| 03/11/2005 | 109986.865 |
| 04/11/2005 | 109986.865 |
| 07/11/2005 | 109986.865 |
| 08/11/2005 | 109986.865 |
| 09/11/2005 | 109986.865 |
| 10/11/2005 | 109986.865 |
| 11/11/2005 | 109986.865 |
| 14/11/2005 | 109986.865 |
| 15/11/2005 | 109986.865 |
| 16/11/2005 | 109986.865 |
| 17/11/2005 | 109986.865 |
| 18/11/2005 | 109986.865 |
| 21/11/2005 | 109986.865 |
| 22/11/2005 | 109986.865 |
| 23/11/2005 | 109986.865 |
| 25/11/2005 | 109986.865 |
| 28/11/2005 | 109986.865 |
| 29/11/2005 | 109986.865 |
| 30/11/2005 | 109821.884 |
| 01/12/2005 | 109821.884 |
| 02/12/2005 | 111128.765 |
| 05/12/2005 | 111128.765 |
| 06/12/2005 | 111128.765 |
| 07/12/2005 | 111128.765 |
| 08/12/2005 | 111128.765 |
| 09/12/2005 | 111006.523 |
| 12/12/2005 | 111006.523 |
| 13/12/2005 | 111006.523 |
| 14/12/2005 | 111006.523 |
| 15/12/2005 | 111006.523 |
| 16/12/2005 | 111006.523 |
| 19/12/2005 | 111006.523 |
| 20/12/2005 | 111006.523 |
| 21/12/2005 | 111050.926 |
| 22/12/2005 | 111050.926 |
| 23/12/2005 | 111050.926 |
| 27/12/2005 | 111050.926 |
| 28/12/2005 | 111050.926 |
| 29/12/2005 | 111173.082 |
| 30/12/2005 | 111173.082 |
| 03/01/2006 | 111173.082 |
| 04/01/2006 | 111173.082 |
| 05/01/2006 | 111173.082 |
| 06/01/2006 | 111173.082 |
| 09/01/2006 | 111173.082 |
| 10/01/2006 | 111173.082 |
| 11/01/2006 | 111173.082 |
| 12/01/2006 | 111173.082 |
| 13/01/2006 | 111173.082 |
| 17/01/2006 | 111106.378 |
| 18/01/2006 | 111106.378 |
| 19/01/2006 | 111106.378 |
| 20/01/2006 | 111539.693 |
| 23/01/2006 | 111539.693 |
| 24/01/2006 | 111985.852 |
| 25/01/2006 | 111985.852 |
| 26/01/2006 | 111985.852 |
| 27/01/2006 | 111985.852 |
| 30/01/2006 | 111985.852 |
| 31/01/2006 | 111985.852 |
| 01/02/2006 | 111985.852 |
| 02/02/2006 | 111985.852 |
| 03/02/2006 | 111985.852 |
| 06/02/2006 | 111347.532 |
| 07/02/2006 | 111670.44 |
| 08/02/2006 | 111670.44 |
| 09/02/2006 | 112731.309 |
| 10/02/2006 | 112731.309 |
| 13/02/2006 | 112731.309 |
| 14/02/2006 | 112731.309 |
| 15/02/2006 | 112731.309 |
| 16/02/2006 | 112731.309 |
| 17/02/2006 | 112731.309 |
| 21/02/2006 | 112731.309 |
| 22/02/2006 | 112731.309 |
| 23/02/2006 | 112731.309 |
| 24/02/2006 | 112731.309 |
| 27/02/2006 | 112731.309 |
| 28/02/2006 | 112731.309 |
| 01/03/2006 | 112731.309 |
| 02/03/2006 | 113655.706 |
| 03/03/2006 | 113655.706 |
| 06/03/2006 | 113655.706 |
| 07/03/2006 | 113655.706 |
| 08/03/2006 | 113462.491 |
| 09/03/2006 | 113462.491 |
| 10/03/2006 | 113462.491 |
| 13/03/2006 | 114551.731 |
| 14/03/2006 | 114551.731 |
| 15/03/2006 | 114551.731 |
| 16/03/2006 | 114551.731 |
| 17/03/2006 | 114551.731 |
| 20/03/2006 | 114551.731 |
| 21/03/2006 | 114551.731 |
| 22/03/2006 | 114551.731 |
| 23/03/2006 | 115239.042 |
| 24/03/2006 | 115239.042 |
| 27/03/2006 | 115239.042 |
| 28/03/2006 | 115239.042 |
| 29/03/2006 | 115239.042 |
| 30/03/2006 | 115976.571 |
| 31/03/2006 | 115976.571 |
| 03/04/2006 | 115976.571 |
| 04/04/2006 | 115976.571 |
| 05/04/2006 | 115976.571 |
| 06/04/2006 | 115976.571 |
| 07/04/2006 | 115976.571 |
| 10/04/2006 | 115976.571 |
| 11/04/2006 | 116127.341 |
| 12/04/2006 | 116127.341 |
| 13/04/2006 | 116278.306 |
| 17/04/2006 | 116278.306 |
| 18/04/2006 | 116278.306 |
| 19/04/2006 | 116278.306 |
| 20/04/2006 | 116278.306 |
| 21/04/2006 | 116278.306 |
| 24/04/2006 | 116278.306 |
| 25/04/2006 | 116278.306 |
| 26/04/2006 | 116278.306 |
| 27/04/2006 | 116278.306 |
| 28/04/2006 | 116278.306 |
| 01/05/2006 | 116278.306 |
| 02/05/2006 | 116278.306 |
| 03/05/2006 | 117243.416 |
| 04/05/2006 | 117243.416 |
| 05/05/2006 | 117712.39 |
| 08/05/2006 | 117712.39 |
| 09/05/2006 | 117712.39 |
| 10/05/2006 | 117712.39 |
| 11/05/2006 | 117712.39 |
| 12/05/2006 | 117712.39 |
| 15/05/2006 | 115958.475 |
| 16/05/2006 | 116259.968 |
| 17/05/2006 | 116259.968 |
| 18/05/2006 | 116259.968 |
| 19/05/2006 | 115643.79 |
| 22/05/2006 | 116441.732 |
| 23/05/2006 | 116441.732 |
| 24/05/2006 | 115463.621 |
| 25/05/2006 | 116341.145 |
| 26/05/2006 | 116341.145 |
| 30/05/2006 | 116341.145 |
| 31/05/2006 | 116341.145 |
| 01/06/2006 | 117585.995 |
| 02/06/2006 | 117585.995 |
| 05/06/2006 | 117585.995 |
| 06/06/2006 | 117585.995 |
| 07/06/2006 | 117197.961 |
| 08/06/2006 | 117197.961 |
| 09/06/2006 | 117151.082 |
| 12/06/2006 | 117151.082 |
| 13/06/2006 | 117151.082 |
| 14/06/2006 | 115604.688 |
| 15/06/2006 | 116541.086 |
| 16/06/2006 | 116541.086 |
| 19/06/2006 | 116541.086 |
| 20/06/2006 | 115340.713 |
| 21/06/2006 | 115755.939 |
| 22/06/2006 | 115755.939 |
| 23/06/2006 | 115755.939 |
| 26/06/2006 | 115698.061 |
| 27/06/2006 | 115698.061 |
| 28/06/2006 | 115698.061 |
| 29/06/2006 | 116542.657 |
| 30/06/2006 | 116542.657 |
| 03/07/2006 | 116542.657 |
| 05/07/2006 | 116542.657 |
| 06/07/2006 | 116542.657 |
| 07/07/2006 | 116845.668 |
| 10/07/2006 | 116845.668 |
| 11/07/2006 | 117055.99 |
| 12/07/2006 | 117055.99 |
| 13/07/2006 | 117055.99 |
| 14/07/2006 | 114890.454 |
| 17/07/2006 | 114338.98 |
| 18/07/2006 | 114338.98 |
| 19/07/2006 | 114338.98 |
| 20/07/2006 | 114338.98 |
| 21/07/2006 | 114338.98 |
| 24/07/2006 | 113355.665 |
| 25/07/2006 | 115702.127 |
| 26/07/2006 | 115702.127 |
| 27/07/2006 | 115702.127 |
| 28/07/2006 | 115702.127 |
| 31/07/2006 | 115702.127 |
| 01/08/2006 | 115702.127 |
| 02/08/2006 | 115702.127 |
| 03/08/2006 | 115702.127 |
| 04/08/2006 | 115702.127 |
| 07/08/2006 | 115702.127 |
| 08/08/2006 | 115702.127 |
| 09/08/2006 | 115702.127 |
| 10/08/2006 | 115702.127 |
| 11/08/2006 | 115702.127 |
| 14/08/2006 | 115702.127 |
| 15/08/2006 | 115702.127 |
| 16/08/2006 | 115702.127 |
| 17/08/2006 | 115702.127 |
| 18/08/2006 | 115702.127 |
| 21/08/2006 | 115702.127 |
| 22/08/2006 | 115702.127 |
| 23/08/2006 | 115702.127 |
| 24/08/2006 | 115702.127 |
| 25/08/2006 | 115702.127 |
| 28/08/2006 | 115702.127 |
| 29/08/2006 | 115702.127 |
| 30/08/2006 | 115702.127 |
| 31/08/2006 | 115702.127 |
| 01/09/2006 | 115702.127 |
| 05/09/2006 | 115702.127 |
| 06/09/2006 | 115702.127 |
| 07/09/2006 | 115702.127 |
| 08/09/2006 | 115054.195 |
| 11/09/2006 | 115353.336 |
| 12/09/2006 | 115353.336 |
| 13/09/2006 | 115353.336 |
| 14/09/2006 | 115353.336 |
| 15/09/2006 | 115353.336 |
| 18/09/2006 | 115353.336 |
| 19/09/2006 | 115353.336 |
| 20/09/2006 | 115353.336 |
| 21/09/2006 | 115353.336 |
| 22/09/2006 | 115353.336 |
| 25/09/2006 | 114938.064 |
| 26/09/2006 | 114938.064 |
| 27/09/2006 | 114938.064 |
| 28/09/2006 | 114938.064 |
| 29/09/2006 | 114938.064 |
| 02/10/2006 | 114938.064 |
| 03/10/2006 | 114938.064 |
| 04/10/2006 | 114938.064 |
| 05/10/2006 | 114938.064 |
| 06/10/2006 | 114938.064 |
| 09/10/2006 | 114938.064 |
| 10/10/2006 | 114938.064 |
| 11/10/2006 | 114938.064 |
| 12/10/2006 | 114938.064 |
| 13/10/2006 | 114938.064 |
| 16/10/2006 | 114938.064 |
| 17/10/2006 | 114938.064 |
| 18/10/2006 | 114938.064 |
| 19/10/2006 | 114938.064 |
| 20/10/2006 | 114938.064 |
| 23/10/2006 | 114938.064 |
| 24/10/2006 | 114938.064 |
| 25/10/2006 | 114938.064 |
| 26/10/2006 | 114938.064 |
| 27/10/2006 | 114938.064 |
| 30/10/2006 | 114938.064 |
| 31/10/2006 | 114800.138 |
| 01/11/2006 | 114800.138 |
| 02/11/2006 | 114800.138 |
| 03/11/2006 | 114639.418 |
| 06/11/2006 | 114639.418 |
| 07/11/2006 | 114639.418 |
| 08/11/2006 | 114639.418 |
| 09/11/2006 | 114639.418 |
| 10/11/2006 | 114639.418 |
| 13/11/2006 | 114708.202 |
| 14/11/2006 | 114708.202 |
| 15/11/2006 | 114708.202 |
| 16/11/2006 | 114708.202 |
| 17/11/2006 | 114708.202 |
| 20/11/2006 | 114708.202 |
| 21/11/2006 | 114708.202 |
| 22/11/2006 | 114708.202 |
| 24/11/2006 | 114708.202 |
| 27/11/2006 | 114708.202 |
| 28/11/2006 | 114708.202 |
| 29/11/2006 | 115178.506 |
| 30/11/2006 | 115178.506 |
| 01/12/2006 | 115178.506 |
| 04/12/2006 | 115178.506 |
| 05/12/2006 | 115178.506 |
| 06/12/2006 | 115178.506 |
| 07/12/2006 | 115178.506 |
| 08/12/2006 | 115178.506 |
| 11/12/2006 | 115178.506 |
| 12/12/2006 | 115178.506 |
| 13/12/2006 | 115178.506 |
| 14/12/2006 | 115178.506 |
| 15/12/2006 | 115178.506 |
| 18/12/2006 | 115178.506 |
| 19/12/2006 | 115178.506 |
| 20/12/2006 | 115178.506 |
| 21/12/2006 | 115178.506 |
| 22/12/2006 | 115178.506 |
| 26/12/2006 | 115178.506 |
| 27/12/2006 | 115961.719 |
| 28/12/2006 | 115961.719 |
| 29/12/2006 | 115961.719 |
| 03/01/2007 | 115961.719 |
| 04/01/2007 | 115961.719 |
| 05/01/2007 | 115961.719 |
| 08/01/2007 | 115961.719 |
| 09/01/2007 | 116518.336 |
| 10/01/2007 | 116518.336 |
| 11/01/2007 | 116518.336 |
| 12/01/2007 | 116518.336 |
| 16/01/2007 | 116518.336 |
| 17/01/2007 | 116518.336 |
| 18/01/2007 | 116518.336 |
| 19/01/2007 | 116518.336 |
| 22/01/2007 | 116518.336 |
| 23/01/2007 | 116518.336 |
| 24/01/2007 | 116518.336 |
| 25/01/2007 | 116518.336 |
| 26/01/2007 | 116518.336 |
| 29/01/2007 | 116355.21 |
| 30/01/2007 | 116355.21 |
| 31/01/2007 | 116355.21 |
| 01/02/2007 | 116355.21 |
| 02/02/2007 | 116355.21 |
| 05/02/2007 | 116355.21 |
| 06/02/2007 | 116355.21 |
| 07/02/2007 | 116355.21 |
| 08/02/2007 | 116355.21 |
| 09/02/2007 | 116355.21 |
| 12/02/2007 | 116355.21 |
| 13/02/2007 | 115901.425 |
| 14/02/2007 | 115901.425 |
| 15/02/2007 | 115901.425 |
| 16/02/2007 | 115901.425 |
| 20/02/2007 | 115901.425 |
| 21/02/2007 | 115901.425 |
| 22/02/2007 | 115901.425 |
| 23/02/2007 | 115901.425 |
| 26/02/2007 | 115901.425 |
| 27/02/2007 | 115901.425 |
| 28/02/2007 | 115901.425 |
| 01/03/2007 | 117199.521 |
| 02/03/2007 | 117199.521 |
| 05/03/2007 | 117199.521 |
| 06/03/2007 | 115898.606 |
| 07/03/2007 | 118135.449 |
| 08/03/2007 | 118135.449 |
| 09/03/2007 | 118135.449 |
| 12/03/2007 | 118135.449 |
| 13/03/2007 | 118135.449 |
| 14/03/2007 | 118135.449 |
| 15/03/2007 | 119092.346 |
| 16/03/2007 | 119092.346 |
| 19/03/2007 | 119092.346 |
| 20/03/2007 | 119092.346 |
| 21/03/2007 | 119092.346 |
| 22/03/2007 | 119092.346 |
| 23/03/2007 | 119092.346 |
| 26/03/2007 | 119092.346 |
| 27/03/2007 | 119092.346 |
| 28/03/2007 | 119092.346 |
| 29/03/2007 | 119092.346 |
| 30/03/2007 | 119282.894 |
| 02/04/2007 | 119282.894 |
| 03/04/2007 | 119282.894 |
| 04/04/2007 | 119282.894 |
| 05/04/2007 | 119282.894 |
| 09/04/2007 | 119282.894 |
| 10/04/2007 | 119282.894 |
| 11/04/2007 | 119282.894 |
| 12/04/2007 | 119282.894 |
| 13/04/2007 | 119938.95 |
| 16/04/2007 | 119938.95 |
| 17/04/2007 | 119938.95 |
| 18/04/2007 | 119938.95 |
| 19/04/2007 | 119938.95 |
| 20/04/2007 | 119938.95 |
| 23/04/2007 | 119938.95 |
| 24/04/2007 | 119938.95 |
| 25/04/2007 | 119938.95 |
| 26/04/2007 | 119938.95 |
| 27/04/2007 | 119938.95 |
| 30/04/2007 | 119938.95 |
| 01/05/2007 | 119938.95 |
| 02/05/2007 | 120334.748 |
| 03/05/2007 | 120334.748 |
| 04/05/2007 | 120334.748 |
| 07/05/2007 | 120334.748 |
| 08/05/2007 | 120334.748 |
| 09/05/2007 | 120334.748 |
| 10/05/2007 | 120334.748 |
| 11/05/2007 | 120334.748 |
| 14/05/2007 | 121526.062 |
| 15/05/2007 | 121526.062 |
| 16/05/2007 | 121526.062 |
| 17/05/2007 | 121526.062 |
| 18/05/2007 | 121526.062 |
| 21/05/2007 | 121526.062 |
| 22/05/2007 | 121526.062 |
| 23/05/2007 | 121526.062 |
| 24/05/2007 | 121526.062 |
| 25/05/2007 | 121526.062 |
| 29/05/2007 | 122048.624 |
| 30/05/2007 | 122048.624 |
| 31/05/2007 | 122048.624 |
| 01/06/2007 | 122048.624 |
| 04/06/2007 | 122048.624 |
| 05/06/2007 | 122048.624 |
| 06/06/2007 | 122048.624 |
| 07/06/2007 | 122048.624 |
| 08/06/2007 | 119558.833 |
| 11/06/2007 | 121280.48 |
| 12/06/2007 | 121280.48 |
| 13/06/2007 | 121280.48 |
| 14/06/2007 | 123366.504 |
| 15/06/2007 | 123366.504 |
| 18/06/2007 | 123366.504 |
| 19/06/2007 | 123366.504 |
| 20/06/2007 | 123366.504 |
| 21/06/2007 | 123366.504 |
| 22/06/2007 | 124180.723 |
| 25/06/2007 | 124180.723 |
| 26/06/2007 | 123522.565 |
| 27/06/2007 | 122040.294 |
| 28/06/2007 | 124029.551 |
| 29/06/2007 | 124029.551 |
| 02/07/2007 | 124029.551 |
| 03/07/2007 | 124029.551 |
| 05/07/2007 | 124029.551 |
| 06/07/2007 | 124029.551 |
| 09/07/2007 | 124029.551 |
| 10/07/2007 | 124029.551 |
| 11/07/2007 | 124029.551 |
| 12/07/2007 | 125058.996 |
| 13/07/2007 | 125058.996 |
| 16/07/2007 | 125058.996 |
| 17/07/2007 | 125058.996 |
| 18/07/2007 | 125058.996 |
| 19/07/2007 | 125058.996 |
| 20/07/2007 | 125058.996 |
| 23/07/2007 | 125058.996 |
| 24/07/2007 | 125434.173 |
| 25/07/2007 | 125434.173 |
| 26/07/2007 | 125647.411 |
| 27/07/2007 | 125647.411 |
| 30/07/2007 | 122732.391 |
| 31/07/2007 | 124941.575 |
| 01/08/2007 | 124941.575 |
| 02/08/2007 | 125728.706 |
| 03/08/2007 | 125728.706 |
| 06/08/2007 | 125728.706 |
| 07/08/2007 | 128230.708 |
| 08/08/2007 | 128230.708 |
| 09/08/2007 | 128230.708 |
| 10/08/2007 | 128230.708 |
| 13/08/2007 | 127512.616 |
| 14/08/2007 | 127920.656 |
| 15/08/2007 | 127920.656 |
| 16/08/2007 | 125873.926 |
| 17/08/2007 | 126906.092 |
| 20/08/2007 | 126906.092 |
| 21/08/2007 | 126906.092 |
| 22/08/2007 | 126906.092 |
| 23/08/2007 | 126906.092 |
| 24/08/2007 | 126906.092 |
| 27/08/2007 | 126906.092 |
| 28/08/2007 | 126906.092 |
| 29/08/2007 | 123758.821 |
| 30/08/2007 | 126481.515 |
| 31/08/2007 | 126481.515 |
| 04/09/2007 | 126481.515 |
| 05/09/2007 | 126481.515 |
| 06/09/2007 | 126481.515 |
| 07/09/2007 | 126772.422 |
| 10/09/2007 | 126772.422 |
| 11/09/2007 | 126316.042 |
| 12/09/2007 | 126316.042 |
| 13/09/2007 | 126316.042 |
| 14/09/2007 | 126316.042 |
| 17/09/2007 | 126316.042 |
| 18/09/2007 | 126316.042 |
| 19/09/2007 | 130560.261 |
| 20/09/2007 | 130560.261 |
| 21/09/2007 | 130560.261 |
| 24/09/2007 | 130834.437 |
| 25/09/2007 | 130834.437 |
| 26/09/2007 | 130834.437 |
| 27/09/2007 | 130834.437 |
| 28/09/2007 | 130834.437 |
| 01/10/2007 | 130834.437 |
| 02/10/2007 | 132653.036 |
| 03/10/2007 | 132653.036 |
| 04/10/2007 | 132653.036 |
| 05/10/2007 | 132653.036 |
| 08/10/2007 | 132653.036 |
| 09/10/2007 | 132653.036 |
| 10/10/2007 | 133979.566 |
| 11/10/2007 | 133979.566 |
| 12/10/2007 | 133979.566 |
| 15/10/2007 | 134890.627 |
| 16/10/2007 | 134890.627 |
| 17/10/2007 | 133622.655 |
| 18/10/2007 | 134117.059 |
| 19/10/2007 | 134117.059 |
| 22/10/2007 | 134117.059 |
| 23/10/2007 | 134921.761 |
| 24/10/2007 | 134921.761 |
| 25/10/2007 | 134921.761 |
| 26/10/2007 | 134921.761 |
| 29/10/2007 | 134921.761 |
| 30/10/2007 | 134921.761 |
| 31/10/2007 | 134921.761 |
| 01/11/2007 | 136851.143 |
| 02/11/2007 | 136851.143 |
| 05/11/2007 | 137029.049 |
| 06/11/2007 | 137029.049 |
| 07/11/2007 | 139098.188 |
| 08/11/2007 | 139098.188 |
| 09/11/2007 | 138305.328 |
| 12/11/2007 | 136064.782 |
| 13/11/2007 | 134459.217 |
| 14/11/2007 | 139165.29 |
| 15/11/2007 | 139165.29 |
| 16/11/2007 | 139165.29 |
| 19/11/2007 | 139415.788 |
| 20/11/2007 | 139415.788 |
| 21/11/2007 | 140377.756 |
| 23/11/2007 | 140377.756 |
| 26/11/2007 | 143199.349 |
| 27/11/2007 | 143199.349 |
| 28/11/2007 | 145261.42 |
| 29/11/2007 | 145261.42 |
| 30/11/2007 | 145261.42 |
| 03/12/2007 | 145261.42 |
| 04/12/2007 | 145261.42 |
| 05/12/2007 | 143852.384 |
| 06/12/2007 | 146585.579 |
| 07/12/2007 | 146585.579 |
| 10/12/2007 | 146585.579 |
| 11/12/2007 | 146585.579 |
| 12/12/2007 | 146585.579 |
| 13/12/2007 | 148007.46 |
| 14/12/2007 | 148007.46 |
| 17/12/2007 | 148007.46 |
| 18/12/2007 | 145476.532 |
| 19/12/2007 | 146567.606 |
| 20/12/2007 | 146567.606 |
| 21/12/2007 | 146567.606 |
| 24/12/2007 | 146567.606 |
| 26/12/2007 | 146567.606 |
| 27/12/2007 | 146567.606 |
| 28/12/2007 | 146567.606 |
| 31/12/2007 | 146069.276 |
| 02/01/2008 | 146069.276 |
| 03/01/2008 | 143892.844 |
| 04/01/2008 | 143921.623 |
| 07/01/2008 | 143921.623 |
| 08/01/2008 | 143748.917 |
| 09/01/2008 | 143748.917 |
| 10/01/2008 | 145517.028 |
| 11/01/2008 | 145517.028 |
| 14/01/2008 | 145517.028 |
| 15/01/2008 | 147044.957 |
| 16/01/2008 | 147044.957 |
| 17/01/2008 | 145530.394 |
| 18/01/2008 | 140960.74 |
| 22/01/2008 | 139128.25 |
| 23/01/2008 | 137110.89 |
| 24/01/2008 | 141169.373 |
| 25/01/2008 | 141169.373 |
| 28/01/2008 | 141169.373 |
| 29/01/2008 | 143766.889 |
| 30/01/2008 | 143766.889 |
| 31/01/2008 | 143766.889 |
| 01/02/2008 | 147461.698 |
| 04/02/2008 | 147461.698 |
| 05/02/2008 | 147461.698 |
| 06/02/2008 | 142934.624 |
| 07/02/2008 | 141247.996 |
| 08/02/2008 | 142547.477 |
| 11/02/2008 | 142547.477 |
| 12/02/2008 | 143573.819 |
| 13/02/2008 | 143573.819 |
| 14/02/2008 | 143573.819 |
| 15/02/2008 | 143573.819 |
| 19/02/2008 | 143602.534 |
| 20/02/2008 | 143602.534 |
| 21/02/2008 | 143602.534 |
| 22/02/2008 | 143602.534 |
| 25/02/2008 | 144693.913 |
| 26/02/2008 | 144693.913 |
| 27/02/2008 | 144693.913 |
| 28/02/2008 | 144693.913 |
| 29/02/2008 | 144693.913 |
| 03/03/2008 | 140338.626 |
| 04/03/2008 | 140436.863 |
| 05/03/2008 | 140436.863 |
| 06/03/2008 | 140436.863 |
| 07/03/2008 | 140436.863 |
| 10/03/2008 | 138470.747 |
| 11/03/2008 | 136241.368 |
| 12/03/2008 | 142508.471 |
| 13/03/2008 | 142508.471 |
| 14/03/2008 | 142993 |
| 17/03/2008 | 142993 |
| 18/03/2008 | 141262.785 |
| 19/03/2008 | 148481.313 |
| 20/03/2008 | 148481.313 |
| 24/03/2008 | 151955.776 |
| 25/03/2008 | 151955.776 |
| 26/03/2008 | 151955.776 |
| 27/03/2008 | 151955.776 |
| 28/03/2008 | 151165.606 |
| 31/03/2008 | 149699.299 |
| 01/04/2008 | 150387.916 |
| 02/04/2008 | 150387.916 |
| 03/04/2008 | 150387.916 |
| 04/04/2008 | 150387.916 |
| 07/04/2008 | 150387.916 |
| 08/04/2008 | 150387.916 |
| 09/04/2008 | 150387.916 |
| 10/04/2008 | 150387.916 |
| 11/04/2008 | 150718.769 |
| 14/04/2008 | 150718.769 |
| 15/04/2008 | 150146.038 |
| 16/04/2008 | 150146.038 |
| 17/04/2008 | 150146.038 |
| 18/04/2008 | 150146.038 |
| 21/04/2008 | 150146.038 |
| 22/04/2008 | 150146.038 |
| 23/04/2008 | 150146.038 |
| 24/04/2008 | 149860.761 |
| 25/04/2008 | 149860.761 |
| 28/04/2008 | 149860.761 |
| 29/04/2008 | 149860.761 |
| 30/04/2008 | 149860.761 |
| 01/05/2008 | 149186.387 |
| 02/05/2008 | 149186.387 |
| 05/05/2008 | 149186.387 |
| 06/05/2008 | 149186.387 |
| 07/05/2008 | 150752.844 |
| 08/05/2008 | 150752.844 |
| 09/05/2008 | 150330.736 |
| 12/05/2008 | 150330.736 |
| 13/05/2008 | 150330.736 |
| 14/05/2008 | 150330.736 |
| 15/05/2008 | 150330.736 |
| 16/05/2008 | 150330.736 |
| 19/05/2008 | 150330.736 |
| 20/05/2008 | 150330.736 |
| 21/05/2008 | 150330.736 |
| 22/05/2008 | 147248.956 |
| 23/05/2008 | 147278.406 |
| 27/05/2008 | 147278.406 |
| 28/05/2008 | 148721.734 |
| 29/05/2008 | 148721.734 |
| 30/05/2008 | 148721.734 |
| 02/06/2008 | 148721.734 |
| 03/06/2008 | 148721.734 |
| 04/06/2008 | 147829.404 |
| 05/06/2008 | 147696.357 |
| 06/06/2008 | 147696.357 |
| 09/06/2008 | 147696.357 |
| 10/06/2008 | 148213.295 |
| 11/06/2008 | 148213.295 |
| 12/06/2008 | 145530.634 |
| 13/06/2008 | 146214.628 |
| 16/06/2008 | 146214.628 |
| 17/06/2008 | 146214.628 |
| 18/06/2008 | 146214.628 |
| 19/06/2008 | 144401.567 |
| 20/06/2008 | 144762.571 |
| 23/06/2008 | 144762.571 |
| 24/06/2008 | 144661.237 |
| 25/06/2008 | 144661.237 |
| 26/06/2008 | 144661.237 |
| 27/06/2008 | 144661.237 |
| 30/06/2008 | 144053.66 |
| 01/07/2008 | 144053.66 |
| 02/07/2008 | 144053.66 |
| 03/07/2008 | 144053.66 |
| 07/07/2008 | 144370.578 |
| 08/07/2008 | 144370.578 |
| 09/07/2008 | 147460.108 |
| 10/07/2008 | 147460.108 |
| 11/07/2008 | 148389.107 |
| 14/07/2008 | 148389.107 |
| 15/07/2008 | 146712.31 |
| 16/07/2008 | 144262.214 |
| 17/07/2008 | 148575.654 |
| 18/07/2008 | 148575.654 |
| 21/07/2008 | 148575.654 |
| 22/07/2008 | 148575.654 |
| 23/07/2008 | 148575.654 |
| 24/07/2008 | 148575.654 |
| 25/07/2008 | 148575.654 |
| 28/07/2008 | 148575.654 |
| 29/07/2008 | 148575.654 |
| 30/07/2008 | 152512.909 |
| 31/07/2008 | 152512.909 |
| 01/08/2008 | 152512.909 |
| 04/08/2008 | 151521.575 |
| 05/08/2008 | 149839.686 |
| 06/08/2008 | 154844.331 |
| 07/08/2008 | 154844.331 |
| 08/08/2008 | 154844.331 |
| 11/08/2008 | 158436.72 |
| 12/08/2008 | 158436.72 |
| 13/08/2008 | 158436.72 |
| 14/08/2008 | 157391.037 |
| 15/08/2008 | 158760.34 |
| 18/08/2008 | 158760.34 |
| 19/08/2008 | 158760.34 |
| 20/08/2008 | 156728.207 |
| 21/08/2008 | 157511.848 |
| 22/08/2008 | 157511.848 |
| 25/08/2008 | 157511.848 |
| 26/08/2008 | 157511.848 |
| 27/08/2008 | 158299.407 |
| 28/08/2008 | 158299.407 |
| 29/08/2008 | 158299.407 |
| 02/09/2008 | 158299.407 |
| 03/09/2008 | 157397.101 |
| 04/09/2008 | 157208.224 |
| 05/09/2008 | 157208.224 |
| 08/09/2008 | 157899.94 |
| 09/09/2008 | 157899.94 |
| 10/09/2008 | 157899.94 |
| 11/09/2008 | 158957.87 |
| 12/09/2008 | 158957.87 |
| 15/09/2008 | 158957.87 |
| 16/09/2008 | 158957.87 |
| 17/09/2008 | 162105.236 |
| 18/09/2008 | 162105.236 |
| 19/09/2008 | 169075.761 |
| 22/09/2008 | 169075.761 |
| 23/09/2008 | 169075.761 |
| 24/09/2008 | 164493.808 |
| 25/09/2008 | 165513.67 |
| 26/09/2008 | 165513.67 |
| 29/09/2008 | 165513.67 |
| 30/09/2008 | 165513.67 |
| 01/10/2008 | 174550.716 |
| 02/10/2008 | 174550.716 |
| 03/10/2008 | 174550.716 |
| 06/10/2008 | 171391.348 |
| 07/10/2008 | 160696.528 |
| 08/10/2008 | 151472.547 |
| 09/10/2008 | 146655.72 |
| 10/10/2008 | 133339.381 |
| 13/10/2008 | 129165.858 |
| 14/10/2008 | 153604.038 |
| 15/10/2008 | 153604.038 |
| 16/10/2008 | 134004.163 |
| 17/10/2008 | 141481.595 |
| 20/10/2008 | 141481.595 |
| 21/10/2008 | 152885.012 |
| 22/10/2008 | 152885.012 |
| 23/10/2008 | 141097.578 |
| 24/10/2008 | 143707.883 |
| 27/10/2008 | 143707.883 |
| 28/10/2008 | 136694.938 |
| 29/10/2008 | 160056.103 |
| 30/10/2008 | 160056.103 |
| 31/10/2008 | 167930.863 |
| 03/11/2008 | 167930.863 |
| 04/11/2008 | 167930.863 |
| 05/11/2008 | 167930.863 |
| 06/11/2008 | 167930.863 |
| 07/11/2008 | 155655.117 |
| 10/11/2008 | 162939.777 |
| 11/11/2008 | 162939.777 |
| 12/11/2008 | 156259.246 |
| 13/11/2008 | 147008.699 |
| 14/11/2008 | 159724.951 |
| 17/11/2008 | 159724.951 |
| 18/11/2008 | 157089.489 |
| 19/11/2008 | 160985.309 |
| 20/11/2008 | 160985.309 |
| 21/11/2008 | 143341.319 |
| 24/11/2008 | 155353.321 |
| 25/11/2008 | 155353.321 |
| 26/11/2008 | 155353.321 |
| 28/11/2008 | 155353.321 |
| 01/12/2008 | 155353.321 |
| 02/12/2008 | 155353.321 |
| 03/12/2008 | 164115.249 |
| 04/12/2008 | 164115.249 |
| 05/12/2008 | 164115.249 |
| 08/12/2008 | 170712.682 |
| 09/12/2008 | 170712.682 |
| 10/12/2008 | 170712.682 |
| 11/12/2008 | 172317.381 |
| 12/12/2008 | 172317.381 |
| 15/12/2008 | 175246.776 |
| 16/12/2008 | 175246.776 |
| 17/12/2008 | 186147.126 |
| 18/12/2008 | 186147.126 |
| 19/12/2008 | 183261.845 |
| 22/12/2008 | 180164.72 |
| 23/12/2008 | 177426.216 |
| 24/12/2008 | 173930.92 |
| 26/12/2008 | 175722.408 |
| 29/12/2008 | 175722.408 |
| 30/12/2008 | 175722.408 |
| 31/12/2008 | 175722.408 |
| 02/01/2009 | 175722.408 |
| 05/01/2009 | 175722.408 |
| 06/01/2009 | 175722.408 |
| 07/01/2009 | 175722.408 |
| 08/01/2009 | 175722.408 |
| 09/01/2009 | 176108.998 |
| 12/01/2009 | 176108.998 |
| 13/01/2009 | 171442.109 |
| 14/01/2009 | 171579.263 |
| 15/01/2009 | 171579.263 |
| 16/01/2009 | 171442 |
| 20/01/2009 | 171442 |
| 21/01/2009 | 171442 |
| 22/01/2009 | 180511.281 |
| 23/01/2009 | 180511.281 |
| 26/01/2009 | 179915.594 |
| 27/01/2009 | 179915.594 |
| 28/01/2009 | 179915.594 |
| 29/01/2009 | 179915.594 |
| 30/01/2009 | 179915.594 |
| 02/02/2009 | 174014.363 |
| 03/02/2009 | 173648.932 |
| 04/02/2009 | 173648.932 |
| 05/02/2009 | 173648.932 |
| 06/02/2009 | 173648.932 |
| 09/02/2009 | 173648.932 |
| 10/02/2009 | 173648.932 |
| 11/02/2009 | 173648.932 |
| 12/02/2009 | 174951.299 |
| 13/02/2009 | 174951.299 |
| 17/02/2009 | 174951.299 |
| 18/02/2009 | 164804.124 |
| 19/02/2009 | 163040.72 |
| 20/02/2009 | 163040.72 |
| 23/02/2009 | 163040.72 |
| 24/02/2009 | 155703.888 |
| 25/02/2009 | 162819.555 |
| 26/02/2009 | 162819.555 |
| 27/02/2009 | 159937.649 |
| 02/03/2009 | 154547.75 |
| 03/03/2009 | 145815.802 |
| 04/03/2009 | 140960.136 |
| 05/03/2009 | 146725.406 |
| 06/03/2009 | 146725.406 |
| 09/03/2009 | 147282.962 |
| 10/03/2009 | 147282.962 |
| 11/03/2009 | 160346.961 |
| 12/03/2009 | 160346.961 |
| 13/03/2009 | 160346.961 |
| 16/03/2009 | 160346.961 |
| 17/03/2009 | 160346.961 |
| 18/03/2009 | 160346.961 |
| 19/03/2009 | 160346.961 |
| 20/03/2009 | 160346.961 |
| 23/03/2009 | 155761.038 |
| 24/03/2009 | 171041.196 |
| 25/03/2009 | 171041.196 |
| 26/03/2009 | 172443.734 |
| 27/03/2009 | 172443.734 |
| 30/03/2009 | 172443.734 |
| 31/03/2009 | 163235.238 |
| 01/04/2009 | 166271.414 |
| 02/04/2009 | 166271.414 |
| 03/04/2009 | 166271.414 |
| 06/04/2009 | 166271.414 |
| 07/04/2009 | 166271.414 |
| 08/04/2009 | 161765.458 |
| 09/04/2009 | 164078.704 |
| 13/04/2009 | 164078.704 |
| 14/04/2009 | 164078.704 |
| 15/04/2009 | 164078.704 |
| 16/04/2009 | 166260.951 |
| 17/04/2009 | 166260.951 |
| 20/04/2009 | 166260.951 |
| 21/04/2009 | 166260.951 |
| 22/04/2009 | 170267.84 |
| 23/04/2009 | 170267.84 |
| 24/04/2009 | 173519.956 |
| 27/04/2009 | 173519.956 |
| 28/04/2009 | 173519.956 |
| 29/04/2009 | 172149.148 |
| 30/04/2009 | 176848.82 |
| 01/05/2009 | 176848.82 |
| 04/05/2009 | 176848.82 |
| 05/05/2009 | 176848.82 |
| 06/05/2009 | 176848.82 |
| 07/05/2009 | 176848.82 |
| 08/05/2009 | 176848.82 |
| 11/05/2009 | 181429.204 |
| 12/05/2009 | 181429.204 |
| 13/05/2009 | 180830.488 |
| 14/05/2009 | 180830.488 |
| 15/05/2009 | 181987.803 |
| 18/05/2009 | 181987.803 |
| 19/05/2009 | 188593.96 |
| 20/05/2009 | 188593.96 |
| 21/05/2009 | 188593.96 |
| 22/05/2009 | 185463.301 |
| 26/05/2009 | 184424.706 |
| 27/05/2009 | 191027.111 |
| 28/05/2009 | 191027.111 |
| 29/05/2009 | 194580.215 |
| 01/06/2009 | 194580.215 |
| 02/06/2009 | 194580.215 |
| 03/06/2009 | 194580.215 |
| 04/06/2009 | 194580.215 |
| 05/06/2009 | 196973.552 |
| 08/06/2009 | 196973.552 |
| 09/06/2009 | 196973.552 |
| 10/06/2009 | 196973.552 |
| 11/06/2009 | 196973.552 |
| 12/06/2009 | 196973.552 |
| 15/06/2009 | 196973.552 |
| 16/06/2009 | 196973.552 |
| 17/06/2009 | 193743.185 |
| 18/06/2009 | 193103.833 |
| 19/06/2009 | 193103.833 |
| 22/06/2009 | 193103.833 |
| 23/06/2009 | 193103.833 |
| 24/06/2009 | 193605.903 |
| 25/06/2009 | 193605.903 |
| 26/06/2009 | 193605.903 |
| 29/06/2009 | 193605.903 |
| 30/06/2009 | 193605.903 |
| 01/07/2009 | 193605.903 |
| 02/07/2009 | 194651.375 |
| 06/07/2009 | 194651.375 |
| 07/07/2009 | 195293.724 |
| 08/07/2009 | 195293.724 |
| 09/07/2009 | 193672.786 |
| 10/07/2009 | 195222.169 |
| 13/07/2009 | 195222.169 |
| 14/07/2009 | 201527.845 |
| 15/07/2009 | 201527.845 |
| 16/07/2009 | 201527.845 |
| 17/07/2009 | 201527.845 |
| 20/07/2009 | 201527.845 |
| 21/07/2009 | 201527.845 |
| 22/07/2009 | 201527.845 |
| 23/07/2009 | 201527.845 |
| 24/07/2009 | 206888.485 |
| 27/07/2009 | 206888.485 |
| 28/07/2009 | 206888.485 |
| 29/07/2009 | 206888.485 |
| 30/07/2009 | 206619.53 |
| 31/07/2009 | 206619.53 |
| 03/08/2009 | 206619.53 |
| 04/08/2009 | 206619.53 |
| 05/08/2009 | 206619.53 |
| 06/08/2009 | 206619.53 |
| 07/08/2009 | 205111.208 |
| 10/08/2009 | 208146.853 |
| 11/08/2009 | 208146.853 |
| 12/08/2009 | 208146.853 |
| 13/08/2009 | 210623.801 |
| 14/08/2009 | 210623.801 |
| 17/08/2009 | 210623.801 |
| 18/08/2009 | 203294.093 |
| 19/08/2009 | 206302.845 |
| 20/08/2009 | 206302.845 |
| 21/08/2009 | 206302.845 |
| 24/08/2009 | 206302.845 |
| 25/08/2009 | 206302.845 |
| 26/08/2009 | 206302.845 |
| 27/08/2009 | 206302.845 |
| 28/08/2009 | 206302.845 |
| 31/08/2009 | 206302.845 |
| 01/09/2009 | 206302.845 |
| 02/09/2009 | 200340.693 |
| 03/09/2009 | 199759.705 |
| 04/09/2009 | 199759.705 |
| 08/09/2009 | 199759.705 |
| 09/09/2009 | 199759.705 |
| 10/09/2009 | 199759.705 |
| 11/09/2009 | 199759.705 |
| 14/09/2009 | 199759.705 |
| 15/09/2009 | 199759.705 |
| 16/09/2009 | 199759.705 |
| 17/09/2009 | 199759.705 |
| 18/09/2009 | 199759.705 |
| 21/09/2009 | 199759.705 |
| 22/09/2009 | 199759.705 |
| 23/09/2009 | 199759.705 |
| 24/09/2009 | 199759.705 |
| 25/09/2009 | 196283.886 |
| 28/09/2009 | 195518.379 |
| 29/09/2009 | 195518.379 |
| 30/09/2009 | 195518.379 |
| 01/10/2009 | 195107.79 |
| 02/10/2009 | 195107.79 |
| 05/10/2009 | 193722.525 |
| 06/10/2009 | 197248.275 |
| 07/10/2009 | 197248.275 |
| 08/10/2009 | 197248.275 |
| 09/10/2009 | 197248.275 |
| 12/10/2009 | 197248.275 |
| 13/10/2009 | 197248.275 |
| 14/10/2009 | 197248.275 |
| 15/10/2009 | 197248.275 |
| 16/10/2009 | 197248.275 |
| 19/10/2009 | 197248.275 |
| 20/10/2009 | 199279.932 |
| 21/10/2009 | 199279.932 |
| 22/10/2009 | 199279.932 |
| 23/10/2009 | 202209.347 |
| 26/10/2009 | 202209.347 |
| 27/10/2009 | 199762.614 |
| 28/10/2009 | 198364.276 |
| 29/10/2009 | 193226.641 |
| 30/10/2009 | 198598.342 |
| 02/11/2009 | 198598.342 |
| 03/11/2009 | 200048.11 |
| 04/11/2009 | 200048.11 |
| 05/11/2009 | 200048.11 |
| 06/11/2009 | 200048.11 |
| 09/11/2009 | 200048.11 |
| 10/11/2009 | 200048.11 |
| 11/11/2009 | 200048.11 |
| 12/11/2009 | 200048.11 |
| 13/11/2009 | 200048.11 |
| 16/11/2009 | 201028.345 |
| 17/11/2009 | 201028.345 |
| 18/11/2009 | 201028.345 |
| 19/11/2009 | 201028.345 |
| 20/11/2009 | 201028.345 |
| 23/11/2009 | 200063.409 |
| 24/11/2009 | 200063.409 |
| 25/11/2009 | 200063.409 |
| 27/11/2009 | 200063.409 |
| 30/11/2009 | 200063.409 |
| 01/12/2009 | 201263.79 |
| 02/12/2009 | 201263.79 |
| 03/12/2009 | 201263.79 |
| 04/12/2009 | 201263.79 |
| 07/12/2009 | 203538.071 |
| 08/12/2009 | 203538.071 |
| 09/12/2009 | 203538.071 |
| 10/12/2009 | 204820.361 |
| 11/12/2009 | 204820.361 |
| 14/12/2009 | 204820.361 |
| 15/12/2009 | 204820.361 |
| 16/12/2009 | 204820.361 |
| 17/12/2009 | 205230.001 |
| 18/12/2009 | 205230.001 |
| 21/12/2009 | 206030.398 |
| 22/12/2009 | 206030.398 |
| 23/12/2009 | 206030.398 |
| 24/12/2009 | 206030.398 |
| 28/12/2009 | 206030.398 |
| 29/12/2009 | 206030.398 |
| 30/12/2009 | 206030.398 |
| 31/12/2009 | 206030.398 |
| 04/01/2010 | 206030.398 |
| 05/01/2010 | 210130.403 |
| 06/01/2010 | 210130.403 |
| 07/01/2010 | 210130.403 |
| 08/01/2010 | 210130.403 |
| 11/01/2010 | 210130.403 |
| 12/01/2010 | 210130.403 |
| 13/01/2010 | 210130.403 |
| 14/01/2010 | 211832.459 |
| 15/01/2010 | 211832.459 |
| 19/01/2010 | 211832.459 |
| 20/01/2010 | 214925.213 |
| 21/01/2010 | 214925.213 |
| 22/01/2010 | 209595.068 |
| 25/01/2010 | 204963.017 |
| 26/01/2010 | 205311.454 |
| 27/01/2010 | 205311.454 |
| 28/01/2010 | 206995.008 |
| 29/01/2010 | 206995.008 |
| 01/02/2010 | 204925.058 |
| 02/02/2010 | 208654.694 |
| 03/02/2010 | 208654.694 |
| 04/02/2010 | 208654.694 |
| 05/02/2010 | 208654.694 |
| 08/02/2010 | 208174.788 |
| 09/02/2010 | 208174.788 |
| 10/02/2010 | 208174.788 |
| 11/02/2010 | 208174.788 |
| 12/02/2010 | 208174.788 |
| 16/02/2010 | 208174.788 |
| 17/02/2010 | 208174.788 |
| 18/02/2010 | 208174.788 |
| 19/02/2010 | 208174.788 |
| 22/02/2010 | 208174.788 |
| 23/02/2010 | 208174.788 |
| 24/02/2010 | 208174.788 |
| 25/02/2010 | 209632.012 |
| 26/02/2010 | 209632.012 |
| 01/03/2010 | 209632.012 |
| 02/03/2010 | 209632.012 |
| 03/03/2010 | 209632.012 |
| 04/03/2010 | 209632.012 |
| 05/03/2010 | 209632.012 |
| 08/03/2010 | 209632.012 |
| 09/03/2010 | 209632.012 |
| 10/03/2010 | 209632.012 |
| 11/03/2010 | 209632.012 |
| 12/03/2010 | 209632.012 |
| 15/03/2010 | 209632.012 |
| 16/03/2010 | 209632.012 |
| 17/03/2010 | 209632.012 |
| 18/03/2010 | 209632.012 |
| 19/03/2010 | 209632.012 |
| 22/03/2010 | 209632.012 |
| 23/03/2010 | 210889.804 |
| 24/03/2010 | 210889.804 |
| 25/03/2010 | 210889.804 |
| 26/03/2010 | 210510.202 |
| 29/03/2010 | 210510.202 |
| 30/03/2010 | 210510.202 |
| 31/03/2010 | 210510.202 |
| 01/04/2010 | 210510.202 |
| 05/04/2010 | 210510.202 |
| 06/04/2010 | 210510.202 |
| 07/04/2010 | 210510.202 |
| 08/04/2010 | 210510.202 |
| 09/04/2010 | 211541.702 |
| 12/04/2010 | 211541.702 |
| 13/04/2010 | 211541.702 |
| 14/04/2010 | 211541.702 |
| 15/04/2010 | 211541.702 |
| 16/04/2010 | 211541.702 |
| 19/04/2010 | 211541.702 |
| 20/04/2010 | 212662.873 |
| 21/04/2010 | 212662.873 |
| 22/04/2010 | 212662.873 |
| 23/04/2010 | 212939.335 |
| 26/04/2010 | 212939.335 |
| 27/04/2010 | 212939.335 |
| 28/04/2010 | 212939.335 |
| 29/04/2010 | 214898.377 |
| 30/04/2010 | 214898.377 |
| 03/05/2010 | 214898.377 |
| 04/05/2010 | 218186.322 |
| 05/05/2010 | 218186.322 |
| 06/05/2010 | 216266.282 |
| 07/05/2010 | 206923.579 |
| 10/05/2010 | 203447.263 |
| 11/05/2010 | 214575.828 |
| 12/05/2010 | 214575.828 |
| 13/05/2010 | 214575.828 |
| 14/05/2010 | 214575.828 |
| 17/05/2010 | 209747.872 |
| 18/05/2010 | 209580.074 |
| 19/05/2010 | 209580.074 |
| 20/05/2010 | 207589.063 |
| 21/05/2010 | 198434.385 |
| 24/05/2010 | 201748.24 |
| 25/05/2010 | 201748.24 |
| 26/05/2010 | 202212.261 |
| 27/05/2010 | 202212.261 |
| 28/05/2010 | 211574.688 |
| 01/06/2010 | 211574.688 |
| 02/06/2010 | 207046.99 |
| 03/06/2010 | 213548.265 |
| 04/06/2010 | 213548.265 |
| 07/06/2010 | 213548.265 |
| 08/06/2010 | 209106.461 |
| 09/06/2010 | 211887.577 |
| 10/06/2010 | 211887.577 |
| 11/06/2010 | 211887.577 |
| 14/06/2010 | 211887.577 |
| 15/06/2010 | 211887.577 |
| 16/06/2010 | 211887.577 |
| 17/06/2010 | 211887.577 |
| 18/06/2010 | 211887.577 |
| 21/06/2010 | 211887.577 |
| 22/06/2010 | 211887.577 |
| 23/06/2010 | 211887.577 |
| 24/06/2010 | 211167.16 |
| 25/06/2010 | 211167.16 |
| 28/06/2010 | 212201.879 |
| 29/06/2010 | 212201.879 |
| 30/06/2010 | 212201.879 |
| 01/07/2010 | 209973.759 |
| 02/07/2010 | 208776.909 |
| 06/07/2010 | 206877.039 |
| 07/07/2010 | 209421.626 |
| 08/07/2010 | 209421.626 |
| 09/07/2010 | 209421.626 |
| 12/07/2010 | 209421.626 |
| 13/07/2010 | 209421.626 |
| 14/07/2010 | 209421.626 |
| 15/07/2010 | 209421.626 |
| 16/07/2010 | 209421.626 |
| 19/07/2010 | 209421.626 |
| 20/07/2010 | 209610.106 |
| 21/07/2010 | 209610.106 |
| 22/07/2010 | 209610.106 |
| 23/07/2010 | 215353.423 |
| 26/07/2010 | 215353.423 |
| 27/07/2010 | 215353.423 |
| 28/07/2010 | 215353.423 |
| 29/07/2010 | 215353.423 |
| 30/07/2010 | 214168.979 |
| 02/08/2010 | 214468.815 |
| 03/08/2010 | 214468.815 |
| 04/08/2010 | 214468.815 |
| 05/08/2010 | 214468.815 |
| 06/08/2010 | 214468.815 |
| 09/08/2010 | 214468.815 |
| 10/08/2010 | 214468.815 |
| 11/08/2010 | 214468.815 |
| 12/08/2010 | 206383.341 |
| 13/08/2010 | 205041.849 |
| 16/08/2010 | 204283.194 |
| 17/08/2010 | 204283.194 |
| 18/08/2010 | 204283.194 |
| 19/08/2010 | 204283.194 |
| 20/08/2010 | 204283.194 |
| 23/08/2010 | 204058.483 |
| 24/08/2010 | 204058.483 |
| 25/08/2010 | 200344.619 |
| 26/08/2010 | 201466.548 |
| 27/08/2010 | 201466.548 |
| 30/08/2010 | 205979.399 |
| 31/08/2010 | 205979.399 |
| 01/09/2010 | 206762.121 |
| 02/09/2010 | 206762.121 |
| 03/09/2010 | 206762.121 |
| 07/09/2010 | 206762.121 |
| 08/09/2010 | 206762.121 |
| 09/09/2010 | 208622.98 |
| 10/09/2010 | 208622.98 |
| 13/09/2010 | 208622.98 |
| 14/09/2010 | 208622.98 |
| 15/09/2010 | 208622.98 |
| 16/09/2010 | 208622.98 |
| 17/09/2010 | 208622.98 |
| 20/09/2010 | 208622.98 |
| 21/09/2010 | 208622.98 |
| 22/09/2010 | 208622.98 |
| 23/09/2010 | 208622.98 |
| 24/09/2010 | 206557.612 |
| 27/09/2010 | 211618.274 |
| 28/09/2010 | 211618.274 |
| 29/09/2010 | 212507.071 |
| 30/09/2010 | 212507.071 |
| 01/10/2010 | 212507.071 |
| 04/10/2010 | 212507.071 |
| 05/10/2010 | 212507.071 |
| 06/10/2010 | 217012.221 |
| 07/10/2010 | 217012.221 |
| 08/10/2010 | 217012.221 |
| 11/10/2010 | 217012.221 |
| 12/10/2010 | 217012.221 |
| 13/10/2010 | 217012.221 |
| 14/10/2010 | 217012.221 |
| 15/10/2010 | 217012.221 |
| 18/10/2010 | 217012.221 |
| 19/10/2010 | 217012.221 |
| 20/10/2010 | 217012.221 |
| 21/10/2010 | 219464.459 |
| 22/10/2010 | 219464.459 |
| 25/10/2010 | 219464.459 |
| 26/10/2010 | 219464.459 |
| 27/10/2010 | 219464.459 |
| 28/10/2010 | 219464.459 |
| 29/10/2010 | 219464.459 |
| 01/11/2010 | 219464.459 |
| 02/11/2010 | 219464.459 |
| 03/11/2010 | 219464.459 |
| 04/11/2010 | 219464.459 |
| 05/11/2010 | 219464.459 |
| 08/11/2010 | 219464.459 |
| 09/11/2010 | 219464.459 |
| 10/11/2010 | 219464.459 |
| 11/11/2010 | 220100.906 |
| 12/11/2010 | 220100.906 |
| 15/11/2010 | 220100.906 |
| 16/11/2010 | 220144.926 |
| 17/11/2010 | 220144.926 |
| 18/11/2010 | 220761.332 |
| 19/11/2010 | 220761.332 |
| 22/11/2010 | 220761.332 |
| 23/11/2010 | 220761.332 |
| 24/11/2010 | 220761.332 |
| 26/11/2010 | 224845.416 |
| 29/11/2010 | 224845.416 |
| 30/11/2010 | 225587.406 |
| 01/12/2010 | 225587.406 |
| 02/12/2010 | 231294.767 |
| 03/12/2010 | 231294.767 |
| 06/12/2010 | 231294.767 |
| 07/12/2010 | 231294.767 |
| 08/12/2010 | 231294.767 |
| 09/12/2010 | 231294.767 |
| 10/12/2010 | 231294.767 |
| 13/12/2010 | 231294.767 |
| 14/12/2010 | 231294.767 |
| 15/12/2010 | 231294.767 |
| 16/12/2010 | 231294.767 |
| 17/12/2010 | 231294.767 |
| 20/12/2010 | 231294.767 |
| 21/12/2010 | 231294.767 |
| 22/12/2010 | 231294.767 |
| 23/12/2010 | 231294.767 |
| 27/12/2010 | 231294.767 |
| 28/12/2010 | 231294.767 |
| 29/12/2010 | 231294.767 |
| 30/12/2010 | 231294.767 |
| 31/12/2010 | 231294.767 |
| 03/01/2011 | 231294.767 |
| 04/01/2011 | 231294.767 |
| 05/01/2011 | 231294.767 |
| 06/01/2011 | 231294.767 |
| 07/01/2011 | 231294.767 |
| 10/01/2011 | 231294.767 |
| 11/01/2011 | 231294.767 |
| 12/01/2011 | 231294.767 |
| 13/01/2011 | 231294.767 |
| 14/01/2011 | 231294.767 |
| 18/01/2011 | 231294.767 |
| 19/01/2011 | 231294.767 |
| 20/01/2011 | 231294.767 |
| 21/01/2011 | 230809.048 |
| 24/01/2011 | 230809.048 |
| 25/01/2011 | 230809.048 |
| 26/01/2011 | 230809.048 |
| 27/01/2011 | 230809.048 |
| 28/01/2011 | 230809.048 |
| 31/01/2011 | 230809.048 |
| 01/02/2011 | 233163.301 |
| 02/02/2011 | 233163.301 |
| 03/02/2011 | 233163.301 |
| 04/02/2011 | 233163.301 |
| 07/02/2011 | 233163.301 |
| 08/02/2011 | 233163.301 |
| 09/02/2011 | 233163.301 |
| 10/02/2011 | 233163.301 |
| 11/02/2011 | 233163.301 |
| 14/02/2011 | 233163.301 |
| 15/02/2011 | 233163.301 |
| 16/02/2011 | 233163.301 |
| 17/02/2011 | 233163.301 |
| 18/02/2011 | 233163.301 |
| 22/02/2011 | 233163.301 |
| 23/02/2011 | 233163.301 |
| 24/02/2011 | 231297.994 |
| 25/02/2011 | 230719.749 |
| 28/02/2011 | 230719.749 |
| 01/03/2011 | 230719.749 |
| 02/03/2011 | 230719.749 |
| 03/03/2011 | 231711.844 |
| 04/03/2011 | 231711.844 |
| 07/03/2011 | 231711.844 |
| 08/03/2011 | 229417.897 |
| 09/03/2011 | 231666.192 |
| 10/03/2011 | 231666.192 |
| 11/03/2011 | 231666.192 |
| 14/03/2011 | 234121.854 |
| 15/03/2011 | 234121.854 |
| 16/03/2011 | 230844.148 |
| 17/03/2011 | 226342.687 |
| 18/03/2011 | 229466.216 |
| 21/03/2011 | 229466.216 |
| 22/03/2011 | 229466.216 |
| 23/03/2011 | 229466.216 |
| 24/03/2011 | 229466.216 |
| 25/03/2011 | 229466.216 |
| 28/03/2011 | 229466.216 |
| 29/03/2011 | 229466.216 |
| 30/03/2011 | 232380.437 |
| 31/03/2011 | 232380.437 |
| 01/04/2011 | 232380.437 |
| 04/04/2011 | 232380.437 |
| 05/04/2011 | 232380.437 |
| 06/04/2011 | 232380.437 |
| 07/04/2011 | 232380.437 |
| 08/04/2011 | 232380.437 |
| 11/04/2011 | 232380.437 |
| 12/04/2011 | 232380.437 |
| 13/04/2011 | 232380.437 |
| 14/04/2011 | 232473.389 |
| 15/04/2011 | 232473.389 |
| 18/04/2011 | 232473.389 |
| 19/04/2011 | 232473.389 |
| 20/04/2011 | 234030.961 |
| 21/04/2011 | 234030.961 |
| 25/04/2011 | 234030.961 |
| 26/04/2011 | 234030.961 |
| 27/04/2011 | 234030.961 |
| 28/04/2011 | 234030.961 |
| 29/04/2011 | 234030.961 |
| 02/05/2011 | 234030.961 |
| 03/05/2011 | 234030.961 |
| 04/05/2011 | 234030.961 |
| 05/05/2011 | 232228.923 |
| 06/05/2011 | 230626.543 |
| 09/05/2011 | 230534.293 |
| 10/05/2011 | 230534.293 |
| 11/05/2011 | 230534.293 |
| 12/05/2011 | 230534.293 |
| 13/05/2011 | 232286.353 |
| 16/05/2011 | 232286.353 |
| 17/05/2011 | 230567.434 |
| 18/05/2011 | 230567.434 |
| 19/05/2011 | 230567.434 |
| 20/05/2011 | 230567.434 |
| 23/05/2011 | 230567.434 |
| 24/05/2011 | 228054.249 |
| 25/05/2011 | 227712.168 |
| 26/05/2011 | 227712.168 |
| 27/05/2011 | 227712.168 |
| 31/05/2011 | 227712.168 |
| 01/06/2011 | 227712.168 |
| 02/06/2011 | 227712.168 |
| 03/06/2011 | 227803.253 |
| 06/06/2011 | 227803.253 |
| 07/06/2011 | 225502.44 |
| 08/06/2011 | 225457.339 |
| 09/06/2011 | 225457.339 |
| 10/06/2011 | 227621.73 |
| 13/06/2011 | 227621.73 |
| 14/06/2011 | 228099.735 |
| 15/06/2011 | 228099.735 |
| 16/06/2011 | 228099.735 |
| 17/06/2011 | 228829.654 |
| 20/06/2011 | 228829.654 |
| 21/06/2011 | 228829.654 |
| 22/06/2011 | 228829.654 |
| 23/06/2011 | 228829.654 |
| 24/06/2011 | 228257.58 |
| 27/06/2011 | 228257.58 |
| 28/06/2011 | 230836.891 |
| 29/06/2011 | 230836.891 |
| 30/06/2011 | 230836.891 |
| 01/07/2011 | 230836.891 |
| 05/07/2011 | 230836.891 |
| 06/07/2011 | 230836.891 |
| 07/07/2011 | 230836.891 |
| 08/07/2011 | 230836.891 |
| 11/07/2011 | 230836.891 |
| 12/07/2011 | 226220.153 |
| 13/07/2011 | 224681.856 |
| 14/07/2011 | 224973.943 |
| 15/07/2011 | 224973.943 |
| 18/07/2011 | 224973.943 |
| 19/07/2011 | 224973.943 |
| 20/07/2011 | 229135.96 |
| 21/07/2011 | 229135.96 |
| 22/07/2011 | 229135.96 |
| 25/07/2011 | 229135.96 |
| 26/07/2011 | 229135.96 |
| 27/07/2011 | 227692.404 |
| 28/07/2011 | 222296.094 |
| 29/07/2011 | 221851.502 |
| 01/08/2011 | 221851.502 |
| 02/08/2011 | 220098.875 |
| 03/08/2011 | 213605.958 |
| 04/08/2011 | 215058.479 |
| 05/08/2011 | 215058.479 |
| 08/08/2011 | 214843.42 |
| 09/08/2011 | 214843.42 |
| 10/08/2011 | 228765.274 |
| 11/08/2011 | 228765.274 |
| 12/08/2011 | 239654.501 |
| 15/08/2011 | 239654.501 |
| 16/08/2011 | 239654.501 |
| 17/08/2011 | 239654.501 |
| 18/08/2011 | 239127.261 |
| 19/08/2011 | 239127.261 |
| 22/08/2011 | 234296.89 |
| 23/08/2011 | 234109.453 |
| 24/08/2011 | 234109.453 |
| 25/08/2011 | 234109.453 |
| 26/08/2011 | 234109.453 |
| 29/08/2011 | 238534.121 |
| 30/08/2011 | 238534.121 |
| 31/08/2011 | 238534.121 |
| 01/09/2011 | 238534.121 |
| 02/09/2011 | 238534.121 |
| 06/09/2011 | 231068.003 |
| 07/09/2011 | 229958.877 |
| 08/09/2011 | 229958.877 |
| 09/09/2011 | 229958.877 |
| 12/09/2011 | 223635.008 |
| 13/09/2011 | 224842.637 |
| 14/09/2011 | 224842.637 |
| 15/09/2011 | 224842.637 |
| 16/09/2011 | 224842.637 |
| 19/09/2011 | 224842.637 |
| 20/09/2011 | 224842.637 |
| 21/09/2011 | 224460.404 |
| 22/09/2011 | 224460.404 |
| 23/09/2011 | 217098.103 |
| 26/09/2011 | 218530.951 |
| 27/09/2011 | 218530.951 |
| 28/09/2011 | 218530.951 |
| 29/09/2011 | 218530.951 |
| 30/09/2011 | 220213.639 |
| 03/10/2011 | 220213.639 |
| 04/10/2011 | 211052.752 |
| 05/10/2011 | 217342.124 |
| 06/10/2011 | 217342.124 |
| 07/10/2011 | 217342.124 |
| 10/10/2011 | 217342.124 |
| 11/10/2011 | 217342.124 |
| 12/10/2011 | 217342.124 |
| 13/10/2011 | 217342.124 |
| 14/10/2011 | 217342.124 |
| 17/10/2011 | 217342.124 |
| 18/10/2011 | 217342.124 |
| 19/10/2011 | 223514.64 |
| 20/10/2011 | 223514.64 |
| 21/10/2011 | 224274.59 |
| 24/10/2011 | 224274.59 |
| 25/10/2011 | 224274.59 |
| 26/10/2011 | 224274.59 |
| 27/10/2011 | 227033.167 |
| 28/10/2011 | 227033.167 |
| 31/10/2011 | 227033.167 |
| 01/11/2011 | 227033.167 |
| 02/11/2011 | 221811.404 |
| 03/11/2011 | 223874.25 |
| 04/11/2011 | 223874.25 |
| 07/11/2011 | 223874.25 |
| 08/11/2011 | 223874.25 |
| 09/11/2011 | 223874.25 |
| 10/11/2011 | 223874.25 |
| 11/11/2011 | 226426.417 |
| 14/11/2011 | 226426.417 |
| 15/11/2011 | 226426.417 |
| 16/11/2011 | 226743.414 |
| 17/11/2011 | 226743.414 |
| 18/11/2011 | 223274.24 |
| 21/11/2011 | 223117.948 |
| 22/11/2011 | 223117.948 |
| 23/11/2011 | 221377.628 |
| 25/11/2011 | 216396.631 |
| 28/11/2011 | 214968.413 |
| 29/11/2011 | 223180.207 |
| 30/11/2011 | 223180.207 |
| 01/12/2011 | 223180.207 |
| 02/12/2011 | 223180.207 |
| 05/12/2011 | 223180.207 |
| 06/12/2011 | 223180.207 |
| 07/12/2011 | 223180.207 |
| 08/12/2011 | 223180.207 |
| 09/12/2011 | 223180.207 |
| 12/12/2011 | 227956.263 |
| 13/12/2011 | 227956.263 |
| 14/12/2011 | 226018.635 |
| 15/12/2011 | 223080.392 |
| 16/12/2011 | 224262.719 |
| 19/12/2011 | 224262.719 |
| 20/12/2011 | 224262.719 |
| 21/12/2011 | 232291.324 |
| 22/12/2011 | 232291.324 |
| 23/12/2011 | 232291.324 |
| 27/12/2011 | 232291.324 |
| 28/12/2011 | 232291.324 |
| 29/12/2011 | 232291.324 |
| 30/12/2011 | 235078.82 |
| 03/01/2012 | 235078.82 |
| 04/01/2012 | 235078.82 |
| 05/01/2012 | 235078.82 |
| 06/01/2012 | 235078.82 |
| 09/01/2012 | 235078.82 |
| 10/01/2012 | 235078.82 |
| 11/01/2012 | 235078.82 |
| 12/01/2012 | 235078.82 |
| 13/01/2012 | 235078.82 |
| 17/01/2012 | 235078.82 |
| 18/01/2012 | 235078.82 |
| 19/01/2012 | 235078.82 |
| 20/01/2012 | 235078.82 |
| 23/01/2012 | 235078.82 |
| 24/01/2012 | 235078.82 |
| 25/01/2012 | 235078.82 |
| 26/01/2012 | 235078.82 |
| 27/01/2012 | 235078.82 |
| 30/01/2012 | 235078.82 |
| 31/01/2012 | 235078.82 |
| 01/02/2012 | 235078.82 |
| 02/02/2012 | 235078.82 |
| 03/02/2012 | 235078.82 |
| 06/02/2012 | 235078.82 |
| 07/02/2012 | 235078.82 |
| 08/02/2012 | 235078.82 |
| 09/02/2012 | 235078.82 |
| 10/02/2012 | 235078.82 |
| 13/02/2012 | 235078.82 |
| 14/02/2012 | 236771.387 |
| 15/02/2012 | 236771.387 |
| 16/02/2012 | 236771.387 |
| 17/02/2012 | 236771.387 |
| 21/02/2012 | 236771.387 |
| 22/02/2012 | 236771.387 |
| 23/02/2012 | 236771.387 |
| 24/02/2012 | 236771.387 |
| 27/02/2012 | 236771.387 |
| 28/02/2012 | 236771.387 |
| 29/02/2012 | 236771.387 |
| 01/03/2012 | 236771.387 |
| 02/03/2012 | 238736.59 |
| 05/03/2012 | 238736.59 |
| 06/03/2012 | 238736.59 |
| 07/03/2012 | 238736.59 |
| 08/03/2012 | 240909.093 |
| 09/03/2012 | 240909.093 |
| 12/03/2012 | 240909.093 |
| 13/03/2012 | 240909.093 |
| 14/03/2012 | 240909.093 |
| 15/03/2012 | 240909.093 |
| 16/03/2012 | 240909.093 |
| 19/03/2012 | 240909.093 |
| 20/03/2012 | 240909.093 |
| 21/03/2012 | 240909.093 |
| 22/03/2012 | 240909.093 |
| 23/03/2012 | 240909.093 |
| 26/03/2012 | 241896.82 |
| 27/03/2012 | 241896.82 |
| 28/03/2012 | 241896.82 |
| 29/03/2012 | 240687.336 |
| 30/03/2012 | 240302.236 |
| 02/04/2012 | 240302.236 |
| 03/04/2012 | 240302.236 |
| 04/04/2012 | 240302.236 |
| 05/04/2012 | 240302.236 |
| 09/04/2012 | 239725.511 |
| 10/04/2012 | 239725.511 |
| 11/04/2012 | 236177.573 |
| 12/04/2012 | 237547.403 |
| 13/04/2012 | 237547.403 |
| 16/04/2012 | 237547.403 |
| 17/04/2012 | 237357.365 |
| 18/04/2012 | 237357.365 |
| 19/04/2012 | 237357.365 |
| 20/04/2012 | 237357.365 |
| 23/04/2012 | 237357.365 |
| 24/04/2012 | 237357.365 |
| 25/04/2012 | 238781.509 |
| 26/04/2012 | 238781.509 |
| 27/04/2012 | 238781.509 |
| 30/04/2012 | 238781.509 |
| 01/05/2012 | 238781.509 |
| 02/05/2012 | 238781.509 |
| 03/05/2012 | 238781.509 |
| 04/05/2012 | 238781.509 |
| 07/05/2012 | 234196.904 |
| 08/05/2012 | 234829.236 |
| 09/05/2012 | 234829.236 |
| 10/05/2012 | 233349.812 |
| 11/05/2012 | 234633.236 |
| 14/05/2012 | 234633.236 |
| 15/05/2012 | 231489.151 |
| 16/05/2012 | 230354.854 |
| 17/05/2012 | 229226.115 |
| 18/05/2012 | 225031.277 |
| 21/05/2012 | 222960.989 |
| 22/05/2012 | 227888.427 |
| 23/05/2012 | 227888.427 |
| 24/05/2012 | 227888.427 |
| 25/05/2012 | 227888.427 |
| 29/05/2012 | 227888.427 |
| 30/05/2012 | 231534.642 |
| 31/05/2012 | 231534.642 |
| 01/06/2012 | 231696.716 |
| 04/06/2012 | 231696.716 |
| 05/06/2012 | 231488.189 |
| 06/06/2012 | 231488.189 |
| 07/06/2012 | 231488.189 |
| 08/06/2012 | 231488.189 |
| 11/06/2012 | 231488.189 |
| 12/06/2012 | 231488.189 |
| 13/06/2012 | 235469.786 |
| 14/06/2012 | 235469.786 |
| 15/06/2012 | 239025.38 |
| 18/06/2012 | 239025.38 |
| 19/06/2012 | 239025.38 |
| 20/06/2012 | 239025.38 |
| 21/06/2012 | 239025.38 |
| 22/06/2012 | 239025.38 |
| 25/06/2012 | 240770.265 |
| 26/06/2012 | 240770.265 |
| 27/06/2012 | 242648.273 |
| 28/06/2012 | 242648.273 |
| 29/06/2012 | 242648.273 |
| 02/07/2012 | 242648.273 |
| 03/07/2012 | 242648.273 |
| 05/07/2012 | 242648.273 |
| 06/07/2012 | 242648.273 |
| 09/07/2012 | 240682.822 |
| 10/07/2012 | 240177.388 |
| 11/07/2012 | 240177.388 |
| 12/07/2012 | 240321.495 |
| 13/07/2012 | 240321.495 |
| 16/07/2012 | 244911.635 |
| 17/07/2012 | 244911.635 |
| 18/07/2012 | 244911.635 |
| 19/07/2012 | 244911.635 |
| 20/07/2012 | 244911.635 |
| 23/07/2012 | 244911.635 |
| 24/07/2012 | 241972.696 |
| 25/07/2012 | 239069.023 |
| 26/07/2012 | 240192.648 |
| 27/07/2012 | 240192.648 |
| 30/07/2012 | 240192.648 |
| 31/07/2012 | 240192.648 |
| 01/08/2012 | 240192.648 |
| 02/08/2012 | 239400.012 |
| 03/08/2012 | 239400.012 |
| 06/08/2012 | 244738.632 |
| 07/08/2012 | 244738.632 |
| 08/08/2012 | 244738.632 |
| 09/08/2012 | 244738.632 |
| 10/08/2012 | 244738.632 |
| 13/08/2012 | 244738.632 |
| 14/08/2012 | 244738.632 |
| 15/08/2012 | 244738.632 |
| 16/08/2012 | 244738.632 |
| 17/08/2012 | 244738.632 |
| 20/08/2012 | 244738.632 |
| 21/08/2012 | 244738.632 |
| 22/08/2012 | 244738.632 |
| 23/08/2012 | 244738.632 |
| 24/08/2012 | 244738.632 |
| 27/08/2012 | 246647.593 |
| 28/08/2012 | 246647.593 |
| 29/08/2012 | 246647.593 |
| 30/08/2012 | 246647.593 |
| 31/08/2012 | 246647.593 |
| 04/09/2012 | 248226.138 |
| 05/09/2012 | 248226.138 |
| 06/09/2012 | 248226.138 |
| 07/09/2012 | 248226.138 |
| 10/09/2012 | 248226.138 |
| 11/09/2012 | 248226.138 |
| 12/09/2012 | 248995.639 |
| 13/09/2012 | 248995.639 |
| 14/09/2012 | 248995.639 |
| 17/09/2012 | 248995.639 |
| 18/09/2012 | 248995.639 |
| 19/09/2012 | 248995.639 |
| 20/09/2012 | 248995.639 |
| 21/09/2012 | 248995.639 |
| 24/09/2012 | 248995.639 |
| 25/09/2012 | 248995.639 |
| 26/09/2012 | 248995.639 |
| 27/09/2012 | 247028.574 |
| 28/09/2012 | 249721.185 |
| 01/10/2012 | 249721.185 |
| 02/10/2012 | 250245.599 |
| 03/10/2012 | 250245.599 |
| 04/10/2012 | 250245.599 |
| 05/10/2012 | 250245.599 |
| 08/10/2012 | 250245.599 |
| 09/10/2012 | 250245.599 |
| 10/10/2012 | 250245.599 |
| 11/10/2012 | 248343.733 |
| 12/10/2012 | 248790.752 |
| 15/10/2012 | 248790.752 |
| 16/10/2012 | 251527.45 |
| 17/10/2012 | 251527.45 |
| 18/10/2012 | 251527.45 |
| 19/10/2012 | 251527.45 |
| 22/10/2012 | 251527.45 |
| 23/10/2012 | 252709.629 |
| 24/10/2012 | 252709.629 |
| 25/10/2012 | 252406.377 |
| 26/10/2012 | 252406.377 |
| 31/10/2012 | 252406.377 |
| 01/11/2012 | 252406.377 |
| 02/11/2012 | 252406.377 |
| 05/11/2012 | 252406.377 |
| 06/11/2012 | 253718.891 |
| 07/11/2012 | 253718.891 |
| 08/11/2012 | 253718.891 |
| 09/11/2012 | 250902.611 |
| 12/11/2012 | 251002.972 |
| 13/11/2012 | 251002.972 |
| 14/11/2012 | 251002.972 |
| 15/11/2012 | 247313.228 |
| 16/11/2012 | 246942.258 |
| 19/11/2012 | 246942.258 |
| 20/11/2012 | 246942.258 |
| 21/11/2012 | 246942.258 |
| 23/11/2012 | 246942.258 |
| 26/11/2012 | 246942.258 |
| 27/11/2012 | 246942.258 |
| 28/11/2012 | 246942.258 |
| 29/11/2012 | 246942.258 |
| 30/11/2012 | 246942.258 |
| 03/12/2012 | 246942.258 |
| 04/12/2012 | 246942.258 |
| 05/12/2012 | 246645.928 |
| 06/12/2012 | 246645.928 |
| 07/12/2012 | 246645.928 |
| 10/12/2012 | 246645.928 |
| 11/12/2012 | 246645.928 |
| 12/12/2012 | 246645.928 |
| 13/12/2012 | 246645.928 |
| 14/12/2012 | 246645.928 |
| 17/12/2012 | 246053.977 |
| 18/12/2012 | 246053.977 |
| 19/12/2012 | 246053.977 |
| 20/12/2012 | 246053.977 |
| 21/12/2012 | 247481.091 |
| 24/12/2012 | 247481.091 |
| 26/12/2012 | 246268.433 |
| 27/12/2012 | 245061.718 |
| 28/12/2012 | 244522.582 |
| 31/12/2012 | 244522.582 |
| 02/01/2013 | 251613.737 |
| 03/01/2013 | 251613.737 |
| 04/01/2013 | 251613.737 |
| 07/01/2013 | 251613.737 |
| 08/01/2013 | 251613.737 |
| 09/01/2013 | 251613.737 |
| 10/01/2013 | 251613.737 |
| 11/01/2013 | 251613.737 |
| 14/01/2013 | 251613.737 |
| 15/01/2013 | 251613.737 |
| 16/01/2013 | 251613.737 |
| 17/01/2013 | 251613.737 |
| 18/01/2013 | 251613.737 |
| 22/01/2013 | 251613.737 |
| 23/01/2013 | 251613.737 |
| 24/01/2013 | 251613.737 |
| 25/01/2013 | 251613.737 |
| 28/01/2013 | 251613.737 |
| 29/01/2013 | 251613.737 |
| 30/01/2013 | 251613.737 |
| 31/01/2013 | 251613.737 |
| 01/02/2013 | 251236.316 |
| 04/02/2013 | 251236.316 |
| 05/02/2013 | 251236.316 |
| 06/02/2013 | 253572.814 |
| 07/02/2013 | 253572.814 |
| 08/02/2013 | 253572.814 |
| 11/02/2013 | 253572.814 |
| 12/02/2013 | 253572.814 |
| 13/02/2013 | 253572.814 |
| 14/02/2013 | 253572.814 |
| 15/02/2013 | 253572.814 |
| 19/02/2013 | 253572.814 |
| 20/02/2013 | 253572.814 |
| 21/02/2013 | 253572.814 |
| 22/02/2013 | 252457.094 |
| 25/02/2013 | 252457.094 |
| 26/02/2013 | 252457.094 |
| 27/02/2013 | 253441.676 |
| 28/02/2013 | 253441.676 |
| 01/03/2013 | 253441.676 |
| 04/03/2013 | 253441.676 |
| 05/03/2013 | 253441.676 |
| 06/03/2013 | 253441.676 |
| 07/03/2013 | 253441.676 |
| 08/03/2013 | 253441.676 |
| 11/03/2013 | 253441.676 |
| 12/03/2013 | 253441.676 |
| 13/03/2013 | 253441.676 |
| 14/03/2013 | 253441.676 |
| 15/03/2013 | 253441.676 |
| 18/03/2013 | 253441.676 |
| 19/03/2013 | 253441.676 |
| 20/03/2013 | 253441.676 |
| 21/03/2013 | 253441.676 |
| 22/03/2013 | 253441.676 |
| 25/03/2013 | 255798.684 |
| 26/03/2013 | 255798.684 |
| 27/03/2013 | 255798.684 |
| 28/03/2013 | 255798.684 |
| 01/04/2013 | 255798.684 |
| 02/04/2013 | 255798.684 |
| 03/04/2013 | 255798.684 |
| 04/04/2013 | 255798.684 |
| 05/04/2013 | 256873.038 |
| 08/04/2013 | 256873.038 |
| 09/04/2013 | 259287.645 |
| 10/04/2013 | 259287.645 |
| 11/04/2013 | 259287.645 |
| 12/04/2013 | 259287.645 |
| 15/04/2013 | 259287.645 |
| 16/04/2013 | 259287.645 |
| 17/04/2013 | 263928.894 |
| 18/04/2013 | 263928.894 |
| 19/04/2013 | 261685.498 |
| 22/04/2013 | 264223.848 |
| 23/04/2013 | 264223.848 |
| 24/04/2013 | 264223.848 |
| 25/04/2013 | 264223.848 |
| 26/04/2013 | 264223.848 |
| 29/04/2013 | 264223.848 |
| 30/04/2013 | 264223.848 |
| 01/05/2013 | 264223.848 |
| 02/05/2013 | 264223.848 |
| 03/05/2013 | 266971.776 |
| 06/05/2013 | 266971.776 |
| 07/05/2013 | 266971.776 |
| 08/05/2013 | 266971.776 |
| 09/05/2013 | 266971.776 |
| 10/05/2013 | 266971.776 |
| 13/05/2013 | 266971.776 |
| 14/05/2013 | 266971.776 |
| 15/05/2013 | 266971.776 |
| 16/05/2013 | 266971.776 |
| 17/05/2013 | 266971.776 |
| 20/05/2013 | 266971.776 |
| 21/05/2013 | 266971.776 |
| 22/05/2013 | 266971.776 |
| 23/05/2013 | 266971.776 |
| 24/05/2013 | 266010.677 |
| 28/05/2013 | 266010.677 |
| 29/05/2013 | 266010.677 |
| 30/05/2013 | 266010.677 |
| 31/05/2013 | 267154.523 |
| 03/06/2013 | 267154.523 |
| 04/06/2013 | 268463.58 |
| 05/06/2013 | 268463.58 |
| 06/06/2013 | 268463.58 |
| 07/06/2013 | 271148.216 |
| 10/06/2013 | 271148.216 |
| 11/06/2013 | 271148.216 |
| 12/06/2013 | 271148.216 |
| 13/06/2013 | 268057.126 |
| 14/06/2013 | 272935.766 |
| 17/06/2013 | 272935.766 |
| 18/06/2013 | 275774.298 |
| 19/06/2013 | 275774.298 |
| 20/06/2013 | 275774.298 |
| 21/06/2013 | 268438.702 |
| 24/06/2013 | 268438.702 |
| 25/06/2013 | 268438.702 |
| 26/06/2013 | 271284.152 |
| 27/06/2013 | 271284.152 |
| 28/06/2013 | 271284.152 |
| 01/07/2013 | 271284.152 |
| 02/07/2013 | 272667.701 |
| 03/07/2013 | 272667.701 |
| 05/07/2013 | 272667.701 |
| 08/07/2013 | 272667.701 |
| 09/07/2013 | 272667.701 |
| 10/07/2013 | 272667.701 |
| 11/07/2013 | 272667.701 |
| 12/07/2013 | 272667.701 |
| 15/07/2013 | 272667.701 |
| 16/07/2013 | 272667.701 |
| 17/07/2013 | 272667.701 |
| 18/07/2013 | 272667.701 |
| 19/07/2013 | 272667.701 |
| 22/07/2013 | 272667.701 |
| 23/07/2013 | 272667.701 |
| 24/07/2013 | 272667.701 |
| 25/07/2013 | 272667.701 |
| 26/07/2013 | 272667.701 |
| 29/07/2013 | 272667.701 |
| 30/07/2013 | 272667.701 |
| 31/07/2013 | 272667.701 |
| 01/08/2013 | 272667.701 |
| 02/08/2013 | 272667.701 |
| 05/08/2013 | 272667.701 |
| 06/08/2013 | 272667.701 |
| 07/08/2013 | 272667.701 |
| 08/08/2013 | 271658.831 |
| 09/08/2013 | 271658.831 |
| 12/08/2013 | 271658.831 |
| 13/08/2013 | 271658.831 |
| 14/08/2013 | 271658.831 |
| 15/08/2013 | 271658.831 |
| 16/08/2013 | 267067.796 |
| 19/08/2013 | 266239.886 |
| 20/08/2013 | 266239.886 |
| 21/08/2013 | 266239.886 |
| 22/08/2013 | 266239.886 |
| 23/08/2013 | 269461.389 |
| 26/08/2013 | 269461.389 |
| 27/08/2013 | 269461.389 |
| 28/08/2013 | 269461.389 |
| 29/08/2013 | 270188.935 |
| 30/08/2013 | 270188.935 |
| 03/09/2013 | 270188.935 |
| 04/09/2013 | 270188.935 |
| 05/09/2013 | 270188.935 |
| 06/09/2013 | 270188.935 |
| 09/09/2013 | 270188.935 |
| 10/09/2013 | 270188.935 |
| 11/09/2013 | 270188.935 |
| 12/09/2013 | 270188.935 |
| 13/09/2013 | 270188.935 |
| 16/09/2013 | 270188.935 |
| 17/09/2013 | 270188.935 |
| 18/09/2013 | 270188.935 |
| 19/09/2013 | 270188.935 |
| 20/09/2013 | 270188.935 |
| 23/09/2013 | 270188.935 |
| 24/09/2013 | 268513.763 |
| 25/09/2013 | 268460.06 |
| 26/09/2013 | 268460.06 |
| 27/09/2013 | 268460.06 |
| 30/09/2013 | 268460.06 |
| 01/10/2013 | 268460.06 |
| 02/10/2013 | 271090.969 |
| 03/10/2013 | 271090.969 |
| 04/10/2013 | 271090.969 |
| 07/10/2013 | 273720.551 |
| 08/10/2013 | 273720.551 |
| 09/10/2013 | 270654.881 |
| 10/10/2013 | 270357.161 |
| 11/10/2013 | 270357.161 |
| 14/10/2013 | 270357.161 |
| 15/10/2013 | 270357.161 |
| 16/10/2013 | 270357.161 |
| 17/10/2013 | 274034.018 |
| 18/10/2013 | 274034.018 |
| 21/10/2013 | 274034.018 |
| 22/10/2013 | 274034.018 |
| 23/10/2013 | 274034.018 |
| 24/10/2013 | 274034.018 |
| 25/10/2013 | 274034.018 |
| 28/10/2013 | 274034.018 |
| 29/10/2013 | 274034.018 |
| 30/10/2013 | 274034.018 |
| 31/10/2013 | 274034.018 |
| 01/11/2013 | 274034.018 |
| 04/11/2013 | 274664.297 |
| 05/11/2013 | 274664.297 |
| 06/11/2013 | 274664.297 |
| 07/11/2013 | 274664.297 |
| 08/11/2013 | 274664.297 |
| 11/11/2013 | 278180 |
| 12/11/2013 | 278180 |
| 13/11/2013 | 278180 |
| 14/11/2013 | 278180 |
| 15/11/2013 | 278180 |
| 18/11/2013 | 278180 |
| 19/11/2013 | 278180 |
| 20/11/2013 | 278180 |
| 21/11/2013 | 278180 |
| 22/11/2013 | 278180 |
| 25/11/2013 | 278180 |
| 26/11/2013 | 278180 |
| 27/11/2013 | 278180 |
| 29/11/2013 | 278180 |
| 02/12/2013 | 278180 |
| 03/12/2013 | 278180 |
| 04/12/2013 | 278180 |
| 05/12/2013 | 278207.818 |
| 06/12/2013 | 278207.818 |
| 09/12/2013 | 278207.818 |
| 10/12/2013 | 278207.818 |
| 11/12/2013 | 278207.818 |
| 12/12/2013 | 278207.818 |
| 13/12/2013 | 277234.09 |
| 16/12/2013 | 277234.09 |
| 17/12/2013 | 277234.09 |
| 18/12/2013 | 277234.09 |
| 19/12/2013 | 277234.09 |
| 20/12/2013 | 277234.09 |
| 23/12/2013 | 277234.09 |
| 24/12/2013 | 277234.09 |
| 26/12/2013 | 277234.09 |
| 27/12/2013 | 277234.09 |
| 30/12/2013 | 277234.09 |
| 31/12/2013 | 277234.09 |
| 02/01/2014 | 277234.09 |
| 03/01/2014 | 277234.09 |
| 06/01/2014 | 277067.75 |
| 07/01/2014 | 277067.75 |
| 08/01/2014 | 277067.75 |
| 09/01/2014 | 277067.75 |
| 10/01/2014 | 277067.75 |
| 13/01/2014 | 277067.75 |
| 14/01/2014 | 277067.75 |
| 15/01/2014 | 280004.668 |
| 16/01/2014 | 280004.668 |
| 17/01/2014 | 280004.668 |
| 21/01/2014 | 280004.668 |
| 22/01/2014 | 280004.668 |
| 23/01/2014 | 280004.668 |
| 24/01/2014 | 280004.668 |
| 27/01/2014 | 273060.552 |
| 28/01/2014 | 272022.922 |
| 29/01/2014 | 272022.922 |
| 30/01/2014 | 272022.922 |
| 31/01/2014 | 273655.06 |
| 03/02/2014 | 273655.06 |
| 04/02/2014 | 273655.06 |
| 05/02/2014 | 275515.914 |
| 06/02/2014 | 275515.914 |
| 07/02/2014 | 275515.914 |
| 10/02/2014 | 275515.914 |
| 11/02/2014 | 275515.914 |
| 12/02/2014 | 275515.914 |
| 13/02/2014 | 275515.914 |
| 14/02/2014 | 275515.914 |
| 18/02/2014 | 275515.914 |
| 19/02/2014 | 275515.914 |
| 20/02/2014 | 275515.914 |
| 21/02/2014 | 277251.664 |
| 24/02/2014 | 277251.664 |
| 25/02/2014 | 277251.664 |
| 26/02/2014 | 277251.664 |
| 27/02/2014 | 277251.664 |
| 28/02/2014 | 277251.664 |
| 03/03/2014 | 277251.664 |
| 04/03/2014 | 277251.664 |
| 05/03/2014 | 281826.317 |
| 06/03/2014 | 281826.317 |
| 07/03/2014 | 281826.317 |
| 10/03/2014 | 281826.317 |
| 11/03/2014 | 281826.317 |
| 12/03/2014 | 281826.317 |
| 13/03/2014 | 282220.874 |
| 14/03/2014 | 282220.874 |
| 17/03/2014 | 281120.212 |
| 18/03/2014 | 281120.212 |
| 19/03/2014 | 281120.212 |
| 20/03/2014 | 281120.212 |
| 21/03/2014 | 283341.062 |
| 24/03/2014 | 283341.062 |
| 25/03/2014 | 282122.695 |
| 26/03/2014 | 282122.695 |
| 27/03/2014 | 282122.695 |
| 28/03/2014 | 281784.148 |
| 31/03/2014 | 281784.148 |
| 01/04/2014 | 281784.148 |
| 02/04/2014 | 281784.148 |
| 03/04/2014 | 281784.148 |
| 04/04/2014 | 281784.148 |
| 07/04/2014 | 281784.148 |
| 08/04/2014 | 278233.668 |
| 09/04/2014 | 279374.426 |
| 10/04/2014 | 279374.426 |
| 11/04/2014 | 279374.426 |
| 14/04/2014 | 276887.993 |
| 15/04/2014 | 278964.653 |
| 16/04/2014 | 278964.653 |
| 17/04/2014 | 278964.653 |
| 21/04/2014 | 278964.653 |
| 22/04/2014 | 278964.653 |
| 23/04/2014 | 278964.653 |
| 24/04/2014 | 278964.653 |
| 25/04/2014 | 278964.653 |
| 28/04/2014 | 278964.653 |
| 29/04/2014 | 279913.133 |
| 30/04/2014 | 279913.133 |
| 01/05/2014 | 279913.133 |
| 02/05/2014 | 279913.133 |
| 05/05/2014 | 279913.133 |
| 06/05/2014 | 279913.133 |
| 07/05/2014 | 279913.133 |
| 08/05/2014 | 281508.638 |
| 09/05/2014 | 281508.638 |
| 12/05/2014 | 281508.638 |
| 13/05/2014 | 281508.638 |
| 14/05/2014 | 281508.638 |
| 15/05/2014 | 281508.638 |
| 16/05/2014 | 278665.401 |
| 19/05/2014 | 279863.662 |
| 20/05/2014 | 279863.662 |
| 21/05/2014 | 279863.662 |
| 22/05/2014 | 282578.34 |
| 23/05/2014 | 282578.34 |
| 27/05/2014 | 282578.34 |
| 28/05/2014 | 282578.34 |
| 29/05/2014 | 282578.34 |
| 30/05/2014 | 282578.34 |
| 02/06/2014 | 282578.34 |
| 03/06/2014 | 282578.34 |
| 04/06/2014 | 282578.34 |
| 05/06/2014 | 282578.34 |
| 06/06/2014 | 282578.34 |
| 09/06/2014 | 282578.34 |
| 10/06/2014 | 282578.34 |
| 11/06/2014 | 282578.34 |
| 12/06/2014 | 282578.34 |
| 13/06/2014 | 282578.34 |
| 16/06/2014 | 283397.817 |
| 17/06/2014 | 283397.817 |
| 18/06/2014 | 283397.817 |
| 19/06/2014 | 283397.817 |
| 20/06/2014 | 283397.817 |
| 23/06/2014 | 283397.817 |
| 24/06/2014 | 283397.817 |
| 25/06/2014 | 283397.817 |
| 26/06/2014 | 284361.369 |
| 27/06/2014 | 284361.369 |
| 30/06/2014 | 284361.369 |
| 01/07/2014 | 284361.369 |
| 02/07/2014 | 284361.369 |
| 03/07/2014 | 284361.369 |
| 07/07/2014 | 284361.369 |
| 08/07/2014 | 284361.369 |
| 09/07/2014 | 284361.369 |
| 10/07/2014 | 285385.07 |
| 11/07/2014 | 285385.07 |
| 14/07/2014 | 286127.071 |
| 15/07/2014 | 286127.071 |
| 16/07/2014 | 286127.071 |
| 17/07/2014 | 286127.071 |
| 18/07/2014 | 286127.071 |
| 21/07/2014 | 288902.504 |
| 22/07/2014 | 288902.504 |
| 23/07/2014 | 288902.504 |
| 24/07/2014 | 288902.504 |
| 25/07/2014 | 288902.504 |
| 28/07/2014 | 288902.504 |
| 29/07/2014 | 289133.626 |
| 30/07/2014 | 289133.626 |
| 31/07/2014 | 289451.673 |
| 01/08/2014 | 289451.673 |
| 04/08/2014 | 288467.537 |
| 05/08/2014 | 288467.537 |
| 06/08/2014 | 288467.537 |
| 07/08/2014 | 288756.005 |
| 08/08/2014 | 288756.005 |
| 11/08/2014 | 291730.192 |
| 12/08/2014 | 291730.192 |
| 13/08/2014 | 291730.192 |
| 14/08/2014 | 291730.192 |
| 15/08/2014 | 291730.192 |
| 18/08/2014 | 291730.192 |
| 19/08/2014 | 291730.192 |
| 20/08/2014 | 291730.192 |
| 21/08/2014 | 291730.192 |
| 22/08/2014 | 291730.192 |
| 25/08/2014 | 291730.192 |
| 26/08/2014 | 291730.192 |
| 27/08/2014 | 291730.192 |
| 28/08/2014 | 291730.192 |
| 29/08/2014 | 291730.192 |
| 02/09/2014 | 291730.192 |
| 03/09/2014 | 291730.192 |
| 04/09/2014 | 291730.192 |
| 05/09/2014 | 291730.192 |
| 08/09/2014 | 291730.192 |
| 09/09/2014 | 291730.192 |
| 10/09/2014 | 291730.192 |
| 11/09/2014 | 292547.036 |
| 12/09/2014 | 292547.036 |
| 15/09/2014 | 292547.036 |
| 16/09/2014 | 292459.272 |
| 17/09/2014 | 292459.272 |
| 18/09/2014 | 292459.272 |
| 19/09/2014 | 292459.272 |
| 22/09/2014 | 292459.272 |
| 23/09/2014 | 292459.272 |
| 24/09/2014 | 290295.073 |
| 25/09/2014 | 293198.024 |
| 26/09/2014 | 293198.024 |
| 29/09/2014 | 295484.969 |
| 30/09/2014 | 295484.969 |
| 01/10/2014 | 295484.969 |
| 02/10/2014 | 295484.969 |
| 03/10/2014 | 295130.387 |
| 06/10/2014 | 295130.387 |
| 07/10/2014 | 295130.387 |
| 08/10/2014 | 295130.387 |
| 09/10/2014 | 300560.786 |
| 10/10/2014 | 300560.786 |
| 13/10/2014 | 295511.365 |
| 14/10/2014 | 290783.183 |
| 15/10/2014 | 292295.255 |
| 16/10/2014 | 292295.255 |
| 17/10/2014 | 292909.076 |
| 20/10/2014 | 292909.076 |
| 21/10/2014 | 292909.076 |
| 22/10/2014 | 292909.076 |
| 23/10/2014 | 292909.076 |
| 24/10/2014 | 296277.53 |
| 27/10/2014 | 296277.53 |
| 28/10/2014 | 296277.53 |
| 29/10/2014 | 296277.53 |
| 30/10/2014 | 296277.53 |
| 31/10/2014 | 296277.53 |
| 03/11/2014 | 296277.53 |
| 04/11/2014 | 296277.53 |
| 05/11/2014 | 296277.53 |
| 06/11/2014 | 296277.53 |
| 07/11/2014 | 296277.53 |
| 10/11/2014 | 296277.53 |
| 11/11/2014 | 296277.53 |
| 12/11/2014 | 296277.53 |
| 13/11/2014 | 296277.53 |
| 14/11/2014 | 296277.53 |
| 17/11/2014 | 296277.53 |
| 18/11/2014 | 296277.53 |
| 19/11/2014 | 296277.53 |
| 20/11/2014 | 296277.53 |
| 21/11/2014 | 296277.53 |
| 24/11/2014 | 296277.53 |
| 25/11/2014 | 296277.53 |
| 26/11/2014 | 296277.53 |
| 28/11/2014 | 296277.53 |
| 01/12/2014 | 296277.53 |
| 02/12/2014 | 296277.53 |
| 03/12/2014 | 298588.495 |
| 04/12/2014 | 298588.495 |
| 05/12/2014 | 298588.495 |
| 08/12/2014 | 298588.495 |
| 09/12/2014 | 298588.495 |
| 10/12/2014 | 298289.906 |
| 11/12/2014 | 298289.906 |
| 12/12/2014 | 298975.973 |
| 15/12/2014 | 298975.973 |
| 16/12/2014 | 297839.864 |
| 17/12/2014 | 297839.864 |
| 18/12/2014 | 304630.613 |
| 19/12/2014 | 304630.613 |
| 22/12/2014 | 304630.613 |
| 23/12/2014 | 304630.613 |
| 24/12/2014 | 304630.613 |
| 26/12/2014 | 304630.613 |
| 29/12/2014 | 304630.613 |
| 30/12/2014 | 304630.613 |
| 31/12/2014 | 304630.613 |
| 02/01/2015 | 304630.613 |
| 05/01/2015 | 303655.795 |
| 06/01/2015 | 303655.795 |
| 07/01/2015 | 300254.85 |
| 08/01/2015 | 304188.189 |
| 09/01/2015 | 304188.189 |
| 12/01/2015 | 304188.189 |
| 13/01/2015 | 302180.547 |
| 14/01/2015 | 301153.133 |
| 15/01/2015 | 301153.133 |
| 16/01/2015 | 301153.133 |
| 20/01/2015 | 304947.662 |
| 21/01/2015 | 304947.662 |
| 22/01/2015 | 304947.662 |
| 23/01/2015 | 304947.662 |
| 26/01/2015 | 304947.662 |
| 27/01/2015 | 306441.906 |
| 28/01/2015 | 306441.906 |
| 29/01/2015 | 300374.356 |
| 30/01/2015 | 304639.672 |
| 02/02/2015 | 304639.672 |
| 03/02/2015 | 309209.267 |
| 04/02/2015 | 309209.267 |
| 05/02/2015 | 309209.267 |
| 06/02/2015 | 313198.067 |
| 09/02/2015 | 313198.067 |
| 10/02/2015 | 313198.067 |
| 11/02/2015 | 316361.367 |
| 12/02/2015 | 316361.367 |
| 13/02/2015 | 316361.367 |
| 17/02/2015 | 316361.367 |
| 18/02/2015 | 316361.367 |
| 19/02/2015 | 316361.367 |
| 20/02/2015 | 316361.367 |
| 23/02/2015 | 316361.367 |
| 24/02/2015 | 316361.367 |
| 25/02/2015 | 316361.367 |
| 26/02/2015 | 316361.367 |
| 27/02/2015 | 316361.367 |
| 02/03/2015 | 316361.367 |
| 03/03/2015 | 316361.367 |
| 04/03/2015 | 316361.367 |
| 05/03/2015 | 316361.367 |
| 06/03/2015 | 316361.367 |
| 09/03/2015 | 316361.367 |
| 10/03/2015 | 317468.632 |
| 11/03/2015 | 317468.632 |
| 12/03/2015 | 317055.923 |
| 13/03/2015 | 317055.923 |
| 16/03/2015 | 317055.923 |
| 17/03/2015 | 321367.883 |
| 18/03/2015 | 321367.883 |
| 19/03/2015 | 321367.883 |
| 20/03/2015 | 321367.883 |
| 23/03/2015 | 324228.057 |
| 24/03/2015 | 324228.057 |
| 25/03/2015 | 324228.057 |
| 26/03/2015 | 324228.057 |
| 27/03/2015 | 323352.642 |
| 30/03/2015 | 323352.642 |
| 31/03/2015 | 323352.642 |
| 01/04/2015 | 323352.642 |
| 02/04/2015 | 322091.566 |
| 06/04/2015 | 322091.566 |
| 07/04/2015 | 322091.566 |
| 08/04/2015 | 322091.566 |
| 09/04/2015 | 322091.566 |
| 10/04/2015 | 322091.566 |
| 13/04/2015 | 322091.566 |
| 14/04/2015 | 322091.566 |
| 15/04/2015 | 322091.566 |
| 16/04/2015 | 322091.566 |
| 17/04/2015 | 322091.566 |
| 20/04/2015 | 322091.566 |
| 21/04/2015 | 324603.881 |
| 22/04/2015 | 324603.881 |
| 23/04/2015 | 324603.881 |
| 24/04/2015 | 324603.881 |
| 27/04/2015 | 324603.881 |
| 28/04/2015 | 324603.881 |
| 29/04/2015 | 324603.881 |
| 30/04/2015 | 324603.881 |
| 01/05/2015 | 321390.302 |
| 04/05/2015 | 325022.013 |
| 05/05/2015 | 325022.013 |
| 06/05/2015 | 325022.013 |
| 07/05/2015 | 323429.405 |
| 08/05/2015 | 325046.552 |
| 11/05/2015 | 325046.552 |
| 12/05/2015 | 325046.552 |
| 13/05/2015 | 324591.487 |
| 14/05/2015 | 324591.487 |
| 15/05/2015 | 324591.487 |
| 18/05/2015 | 324591.487 |
| 19/05/2015 | 324591.487 |
| 20/05/2015 | 324591.487 |
| 21/05/2015 | 324591.487 |
| 22/05/2015 | 324591.487 |
| 26/05/2015 | 324591.487 |
| 27/05/2015 | 324591.487 |
| 28/05/2015 | 327155.759 |
| 29/05/2015 | 327155.759 |
| 01/06/2015 | 327155.759 |
| 02/06/2015 | 327679.208 |
| 03/06/2015 | 327679.208 |
| 04/06/2015 | 327679.208 |
| 05/06/2015 | 327679.208 |
| 08/06/2015 | 326597.867 |
| 09/06/2015 | 326597.867 |
| 10/06/2015 | 326891.805 |
| 11/06/2015 | 326891.805 |
| 12/06/2015 | 326891.805 |
| 15/06/2015 | 326891.805 |
| 16/06/2015 | 325420.792 |
| 17/06/2015 | 325420.792 |
| 18/06/2015 | 325420.792 |
| 19/06/2015 | 325420.792 |
| 22/06/2015 | 325420.792 |
| 23/06/2015 | 327828.906 |
| 24/06/2015 | 327828.906 |
| 25/06/2015 | 327828.906 |
| 26/06/2015 | 326943.768 |
| 29/06/2015 | 326943.768 |
| 30/06/2015 | 326943.768 |
| 01/07/2015 | 327597.655 |
| 02/07/2015 | 327597.655 |
| 06/07/2015 | 327597.655 |
| 07/07/2015 | 327597.655 |
| 08/07/2015 | 327597.655 |
| 09/07/2015 | 327597.655 |
| 10/07/2015 | 327925.253 |
| 13/07/2015 | 327925.253 |
| 14/07/2015 | 327925.253 |
| 15/07/2015 | 327925.253 |
| 16/07/2015 | 327925.253 |
| 17/07/2015 | 327925.253 |
| 20/07/2015 | 327925.253 |
| 21/07/2015 | 327925.253 |
| 22/07/2015 | 327925.253 |
| 23/07/2015 | 327925.253 |
| 24/07/2015 | 327925.253 |
| 27/07/2015 | 327925.253 |
| 28/07/2015 | 325793.739 |
| 29/07/2015 | 329507.788 |
| 30/07/2015 | 329507.788 |
| 31/07/2015 | 329507.788 |
| 03/08/2015 | 329507.788 |
| 04/08/2015 | 329507.788 |
| 05/08/2015 | 329507.788 |
| 06/08/2015 | 329507.788 |
| 07/08/2015 | 329507.788 |
| 10/08/2015 | 328519.264 |
| 11/08/2015 | 328519.264 |
| 12/08/2015 | 328519.264 |
| 13/08/2015 | 329242.007 |
| 14/08/2015 | 329242.007 |
| 17/08/2015 | 329242.007 |
| 18/08/2015 | 329242.007 |
| 19/08/2015 | 329242.007 |
| 20/08/2015 | 329242.007 |
| 21/08/2015 | 321471.895 |
| 24/08/2015 | 312599.271 |
| 25/08/2015 | 296094.029 |
| 26/08/2015 | 296330.905 |
| 27/08/2015 | 296330.905 |
| 28/08/2015 | 296330.905 |
| 31/08/2015 | 296330.905 |
| 01/09/2015 | 296330.905 |
| 02/09/2015 | 288004.006 |
| 03/09/2015 | 292842.474 |
| 04/09/2015 | 292842.474 |
| 08/09/2015 | 292842.474 |
| 09/09/2015 | 299812.124 |
| 10/09/2015 | 299812.124 |
| 11/09/2015 | 300891.448 |
| 14/09/2015 | 300891.448 |
| 15/09/2015 | 300891.448 |
| 16/09/2015 | 300891.448 |
| 17/09/2015 | 300891.448 |
| 18/09/2015 | 300891.448 |
| 21/09/2015 | 296678.968 |
| 22/09/2015 | 298637.049 |
| 23/09/2015 | 298637.049 |
| 24/09/2015 | 298069.639 |
| 25/09/2015 | 298069.639 |
| 28/09/2015 | 298159.059 |
| 29/09/2015 | 298159.059 |
| 30/09/2015 | 298576.482 |
| 01/10/2015 | 298576.482 |
| 02/10/2015 | 298576.482 |
| 05/10/2015 | 298576.482 |
| 06/10/2015 | 298576.482 |
| 07/10/2015 | 298576.482 |
| 08/10/2015 | 298576.482 |
| 09/10/2015 | 298576.482 |
| 12/10/2015 | 298576.482 |
| 13/10/2015 | 298576.482 |
| 14/10/2015 | 298576.482 |
| 15/10/2015 | 297023.884 |
| 16/10/2015 | 302429.719 |
| 19/10/2015 | 302429.719 |
| 20/10/2015 | 302429.719 |
| 21/10/2015 | 302429.719 |
| 22/10/2015 | 302429.719 |
| 23/10/2015 | 309355.36 |
| 26/10/2015 | 309355.36 |
| 27/10/2015 | 309355.36 |
| 28/10/2015 | 309355.36 |
| 29/10/2015 | 309355.36 |
| 30/10/2015 | 309355.36 |
| 02/11/2015 | 309355.36 |
| 03/11/2015 | 309355.36 |
| 04/11/2015 | 309355.36 |
| 05/11/2015 | 309355.36 |
| 06/11/2015 | 309355.36 |
| 09/11/2015 | 309355.36 |
| 10/11/2015 | 309355.36 |
| 11/11/2015 | 310128.748 |
| 12/11/2015 | 310128.748 |
| 13/11/2015 | 310128.748 |
| 16/11/2015 | 306686.319 |
| 17/11/2015 | 311317.282 |
| 18/11/2015 | 311317.282 |
| 19/11/2015 | 311317.282 |
| 20/11/2015 | 311317.282 |
| 23/11/2015 | 311317.282 |
| 24/11/2015 | 311317.282 |
| 25/11/2015 | 311317.282 |
| 27/11/2015 | 311317.282 |
| 30/11/2015 | 311317.282 |
| 01/12/2015 | 311317.282 |
| 02/12/2015 | 314430.455 |
| 03/12/2015 | 314430.455 |
| 04/12/2015 | 309713.998 |
| 07/12/2015 | 315505.65 |
| 08/12/2015 | 315505.65 |
| 09/12/2015 | 315505.65 |
| 10/12/2015 | 312855.403 |
| 11/12/2015 | 314012.968 |
| 14/12/2015 | 314012.968 |
| 15/12/2015 | 315426.026 |
| 16/12/2015 | 315426.026 |
| 17/12/2015 | 315426.026 |
| 18/12/2015 | 315426.026 |
| 21/12/2015 | 310189.954 |
| 22/12/2015 | 313881.214 |
| 23/12/2015 | 313881.214 |
| 24/12/2015 | 313881.214 |
| 28/12/2015 | 313881.214 |
| 29/12/2015 | 313881.214 |
| 30/12/2015 | 313881.214 |
| 31/12/2015 | 313881.214 |
| 04/01/2016 | 310899.343 |
| 05/01/2016 | 306733.292 |
| 06/01/2016 | 307162.718 |
| 07/01/2016 | 307162.718 |
| 08/01/2016 | 298746.46 |
| 11/01/2016 | 295340.75 |
| 12/01/2016 | 295783.761 |
| 13/01/2016 | 295783.761 |
| 14/01/2016 | 295783.761 |
| 15/01/2016 | 301137.447 |
| 19/01/2016 | 301137.447 |
| 20/01/2016 | 300806.196 |
| 21/01/2016 | 300806.196 |
| 22/01/2016 | 301798.857 |
| 25/01/2016 | 301798.857 |
| 26/01/2016 | 301798.857 |
| 27/01/2016 | 306084.4 |
| 28/01/2016 | 306084.4 |
| 29/01/2016 | 307063.871 |
| 01/02/2016 | 307063.871 |
| 02/02/2016 | 307063.871 |
| 03/02/2016 | 307063.871 |
| 04/02/2016 | 308906.254 |
| 05/02/2016 | 308906.254 |
| 08/02/2016 | 308906.254 |
| 09/02/2016 | 304952.254 |
| 10/02/2016 | 304311.854 |
| 11/02/2016 | 304311.854 |
| 12/02/2016 | 304311.854 |
| 16/02/2016 | 310124.21 |
| 17/02/2016 | 310124.21 |
| 18/02/2016 | 310124.21 |
| 19/02/2016 | 310124.21 |
| 22/02/2016 | 310124.21 |
| 23/02/2016 | 310124.21 |
| 24/02/2016 | 310124.21 |
| 25/02/2016 | 312512.167 |
| 26/02/2016 | 312512.167 |
| 29/02/2016 | 312512.167 |
| 01/03/2016 | 312512.167 |
| 02/03/2016 | 320606.232 |
| 03/03/2016 | 320606.232 |
| 04/03/2016 | 320606.232 |
| 07/03/2016 | 320606.232 |
| 08/03/2016 | 320606.232 |
| 09/03/2016 | 320606.232 |
| 10/03/2016 | 321952.778 |
| 11/03/2016 | 321952.778 |
| 14/03/2016 | 321952.778 |
| 15/03/2016 | 321952.778 |
| 16/03/2016 | 321952.778 |
| 17/03/2016 | 321952.778 |
| 18/03/2016 | 321952.778 |
| 21/03/2016 | 321952.778 |
| 22/03/2016 | 321952.778 |
| 23/03/2016 | 321952.778 |
| 24/03/2016 | 321952.778 |
| 28/03/2016 | 321920.583 |
| 29/03/2016 | 321920.583 |
| 30/03/2016 | 321920.583 |
| 31/03/2016 | 321920.583 |
| 01/04/2016 | 321920.583 |
| 04/04/2016 | 321920.583 |
| 05/04/2016 | 321920.583 |
| 06/04/2016 | 321920.583 |
| 07/04/2016 | 325397.325 |
| 08/04/2016 | 325397.325 |
| 11/04/2016 | 326340.977 |
| 12/04/2016 | 326340.977 |
| 13/04/2016 | 326340.977 |
| 14/04/2016 | 326340.977 |
| 15/04/2016 | 326340.977 |
| 18/04/2016 | 326340.977 |
| 19/04/2016 | 326340.977 |
| 20/04/2016 | 326340.977 |
| 21/04/2016 | 326340.977 |
| 22/04/2016 | 326340.977 |
| 25/04/2016 | 326863.123 |
| 26/04/2016 | 326863.123 |
| 27/04/2016 | 326863.123 |
| 28/04/2016 | 326863.123 |
| 29/04/2016 | 326863.123 |
| 02/05/2016 | 324673.14 |
| 03/05/2016 | 327140.656 |
| 04/05/2016 | 327140.656 |
| 05/05/2016 | 325504.953 |
| 06/05/2016 | 325016.695 |
| 09/05/2016 | 325016.695 |
| 10/05/2016 | 325016.695 |
| 11/05/2016 | 325016.695 |
| 12/05/2016 | 325016.695 |
| 13/05/2016 | 325146.702 |
| 16/05/2016 | 325146.702 |
| 17/05/2016 | 328268.11 |
| 18/05/2016 | 328268.11 |
| 19/05/2016 | 327939.842 |
| 20/05/2016 | 327939.842 |
| 23/05/2016 | 327939.842 |
| 24/05/2016 | 327939.842 |
| 25/05/2016 | 327939.842 |
| 26/05/2016 | 327939.842 |
| 27/05/2016 | 327939.842 |
| 31/05/2016 | 327939.842 |
| 01/06/2016 | 327939.842 |
| 02/06/2016 | 327939.842 |
| 03/06/2016 | 327939.842 |
| 06/06/2016 | 327939.842 |
| 07/06/2016 | 327939.842 |
| 08/06/2016 | 327939.842 |
| 09/06/2016 | 327939.842 |
| 10/06/2016 | 327939.842 |
| 13/06/2016 | 327939.842 |
| 14/06/2016 | 325152.353 |
| 15/06/2016 | 324469.533 |
| 16/06/2016 | 324469.533 |
| 17/06/2016 | 324469.533 |
| 20/06/2016 | 324469.533 |
| 21/06/2016 | 326903.055 |
| 22/06/2016 | 326903.055 |
| 23/06/2016 | 326903.055 |
| 24/06/2016 | 326903.055 |
| 27/06/2016 | 326903.055 |
| 28/06/2016 | 321378.393 |
| 29/06/2016 | 328545.131 |
| 30/06/2016 | 328545.131 |
| 01/07/2016 | 328545.131 |
| 05/07/2016 | 328545.131 |
| 06/07/2016 | 328545.131 |
| 07/07/2016 | 330352.13 |
| 08/07/2016 | 330352.13 |
| 11/07/2016 | 330352.13 |
| 12/07/2016 | 330352.13 |
| 13/07/2016 | 330352.13 |
| 14/07/2016 | 330352.13 |
| 15/07/2016 | 330352.13 |
| 18/07/2016 | 330352.13 |
| 19/07/2016 | 330352.13 |
| 20/07/2016 | 330352.13 |
| 21/07/2016 | 330352.13 |
| 22/07/2016 | 330352.13 |
| 25/07/2016 | 330352.13 |
| 26/07/2016 | 330352.13 |
| 27/07/2016 | 330352.13 |
| 28/07/2016 | 330352.13 |
| 29/07/2016 | 330352.13 |
| 01/08/2016 | 330352.13 |
| 02/08/2016 | 330352.13 |
| 03/08/2016 | 330352.13 |
| 04/08/2016 | 331012.834 |
| 05/08/2016 | 331012.834 |
| 08/08/2016 | 331012.834 |
| 09/08/2016 | 331012.834 |
| 10/08/2016 | 331012.834 |
| 11/08/2016 | 331012.834 |
| 12/08/2016 | 331012.834 |
| 15/08/2016 | 331012.834 |
| 16/08/2016 | 331012.834 |
| 17/08/2016 | 331012.834 |
| 18/08/2016 | 331012.834 |
| 19/08/2016 | 331012.834 |
| 22/08/2016 | 331012.834 |
| 23/08/2016 | 331012.834 |
| 24/08/2016 | 331012.834 |
| 25/08/2016 | 331012.834 |
| 26/08/2016 | 331012.834 |
| 29/08/2016 | 331012.834 |
| 30/08/2016 | 331012.834 |
| 31/08/2016 | 331012.834 |
| 01/09/2016 | 331012.834 |
| 02/09/2016 | 331012.834 |
| 06/09/2016 | 331012.834 |
| 07/09/2016 | 331012.834 |
| 08/09/2016 | 331012.834 |
| 09/09/2016 | 331012.834 |
| 12/09/2016 | 331012.834 |
| 13/09/2016 | 336673.153 |
| 14/09/2016 | 336673.153 |
| 15/09/2016 | 335292.793 |
| 16/09/2016 | 335292.793 |
| 19/09/2016 | 335292.793 |
| 20/09/2016 | 335292.793 |
| 21/09/2016 | 335292.793 |
| 22/09/2016 | 335292.793 |
| 23/09/2016 | 335292.793 |
| 26/09/2016 | 335292.793 |
| 27/09/2016 | 335292.793 |
| 28/09/2016 | 337371.609 |
| 29/09/2016 | 337371.609 |
| 30/09/2016 | 337371.609 |
| 03/10/2016 | 339294.627 |
| 04/10/2016 | 339294.627 |
| 05/10/2016 | 339294.627 |
| 06/10/2016 | 339294.627 |
| 07/10/2016 | 339294.627 |
| 10/10/2016 | 339294.627 |
| 11/10/2016 | 339294.627 |
| 12/10/2016 | 339294.627 |
| 13/10/2016 | 338819.615 |
| 14/10/2016 | 338819.615 |
| 17/10/2016 | 338819.615 |
| 18/10/2016 | 338819.615 |
| 19/10/2016 | 338819.615 |
| 20/10/2016 | 338819.615 |
| 21/10/2016 | 338819.615 |
| 24/10/2016 | 338819.615 |
| 25/10/2016 | 338819.615 |
| 26/10/2016 | 338819.615 |
| 27/10/2016 | 338819.615 |
| 28/10/2016 | 338819.615 |
| 31/10/2016 | 338853.496 |
| 01/11/2016 | 338853.496 |
| 02/11/2016 | 338853.496 |
| 03/11/2016 | 336989.802 |
| 04/11/2016 | 335574.445 |
| 07/11/2016 | 335574.445 |
| 08/11/2016 | 335574.445 |
| 09/11/2016 | 335574.445 |
| 10/11/2016 | 335574.445 |
| 11/11/2016 | 335574.445 |
| 14/11/2016 | 335574.445 |
| 15/11/2016 | 335574.445 |
| 16/11/2016 | 335574.445 |
| 17/11/2016 | 335574.445 |
| 18/11/2016 | 335574.445 |
| 21/11/2016 | 335574.445 |
| 22/11/2016 | 335574.445 |
| 23/11/2016 | 335574.445 |
| 25/11/2016 | 335574.445 |
| 28/11/2016 | 335574.445 |
| 29/11/2016 | 335574.445 |
| 30/11/2016 | 335574.445 |
| 01/12/2016 | 335574.445 |
| 02/12/2016 | 335574.445 |
| 05/12/2016 | 335574.445 |
| 06/12/2016 | 335574.445 |
| 07/12/2016 | 335574.445 |
| 08/12/2016 | 335574.445 |
| 09/12/2016 | 335574.445 |
| 12/12/2016 | 335574.445 |
| 13/12/2016 | 335574.445 |
| 14/12/2016 | 335574.445 |
| 15/12/2016 | 335574.445 |
| 16/12/2016 | 336547.611 |
| 19/12/2016 | 336547.611 |
| 20/12/2016 | 336547.611 |
| 21/12/2016 | 336547.611 |
| 22/12/2016 | 336547.611 |
| 23/12/2016 | 336547.611 |
| 27/12/2016 | 336547.611 |
| 28/12/2016 | 336547.611 |
| 29/12/2016 | 336547.611 |
| 30/12/2016 | 336513.956 |
| 03/01/2017 | 336513.956 |
| 04/01/2017 | 336513.956 |
| 05/01/2017 | 336513.956 |
| 06/01/2017 | 336513.956 |
| 09/01/2017 | 336513.956 |
| 10/01/2017 | 336513.956 |
| 11/01/2017 | 336513.956 |
| 12/01/2017 | 336513.956 |
| 13/01/2017 | 336513.956 |
| 17/01/2017 | 336513.956 |
| 18/01/2017 | 336513.956 |
| 19/01/2017 | 336513.956 |
| 20/01/2017 | 336513.956 |
| 23/01/2017 | 336513.956 |
| 24/01/2017 | 336513.956 |
| 25/01/2017 | 336513.956 |
| 26/01/2017 | 336513.956 |
| 27/01/2017 | 336513.956 |
| 30/01/2017 | 336513.956 |
| 31/01/2017 | 336513.956 |
| 01/02/2017 | 336278.396 |
| 02/02/2017 | 336278.396 |
| 03/02/2017 | 336278.396 |
| 06/02/2017 | 336278.396 |
| 07/02/2017 | 336278.396 |
| 08/02/2017 | 336278.396 |
| 09/02/2017 | 336278.396 |
| 10/02/2017 | 336278.396 |
| 13/02/2017 | 336278.396 |
| 14/02/2017 | 336278.396 |
| 15/02/2017 | 336278.396 |
| 16/02/2017 | 336278.396 |
| 17/02/2017 | 336278.396 |
| 21/02/2017 | 336278.396 |
| 22/02/2017 | 336278.396 |
| 23/02/2017 | 336278.396 |
| 24/02/2017 | 336278.396 |
| 27/02/2017 | 336278.396 |
| 28/02/2017 | 336278.396 |
| 01/03/2017 | 336278.396 |
| 02/03/2017 | 336278.396 |
| 03/03/2017 | 336278.396 |
| 06/03/2017 | 336177.513 |
| 07/03/2017 | 336177.513 |
| 08/03/2017 | 336177.513 |
| 09/03/2017 | 336177.513 |
| 10/03/2017 | 336177.513 |
| 13/03/2017 | 336177.513 |
| 14/03/2017 | 336177.513 |
| 15/03/2017 | 336177.513 |
| 16/03/2017 | 336177.513 |
| 17/03/2017 | 336177.513 |
| 20/03/2017 | 336177.513 |
| 21/03/2017 | 336177.513 |
| 22/03/2017 | 336177.513 |
| 23/03/2017 | 336211.131 |
| 24/03/2017 | 336211.131 |
| 27/03/2017 | 336211.131 |
| 28/03/2017 | 336211.131 |
| 29/03/2017 | 336211.131 |
| 30/03/2017 | 336211.131 |
| 31/03/2017 | 336211.131 |
| 03/04/2017 | 336211.131 |
| 04/04/2017 | 336211.131 |
| 05/04/2017 | 336211.131 |
| 06/04/2017 | 336211.131 |
| 07/04/2017 | 336211.131 |
| 10/04/2017 | 336211.131 |
| 11/04/2017 | 336211.131 |
| 12/04/2017 | 336211.131 |
| 13/04/2017 | 336211.131 |
| 17/04/2017 | 336211.131 |
| 18/04/2017 | 338766.335 |
| 19/04/2017 | 338766.335 |
| 20/04/2017 | 338766.335 |
| 21/04/2017 | 338766.335 |
| 24/04/2017 | 338766.335 |
| 25/04/2017 | 338766.335 |
| 26/04/2017 | 338766.335 |
| 27/04/2017 | 338766.335 |
| 28/04/2017 | 338766.335 |
| 01/05/2017 | 338766.335 |
| 02/05/2017 | 338766.335 |
| 03/05/2017 | 338766.335 |
| 04/05/2017 | 338766.335 |
| 05/05/2017 | 338766.335 |
| 08/05/2017 | 338766.335 |
| 09/05/2017 | 338766.335 |
| 10/05/2017 | 338766.335 |
| 11/05/2017 | 338766.335 |
| 12/05/2017 | 338766.335 |
| 15/05/2017 | 338766.335 |
| 16/05/2017 | 338766.335 |
| 17/05/2017 | 338766.335 |
| 18/05/2017 | 338766.335 |
| 19/05/2017 | 339647.128 |
| 22/05/2017 | 339647.128 |
| 23/05/2017 | 339647.128 |
| 24/05/2017 | 339647.128 |
| 25/05/2017 | 339647.128 |
| 26/05/2017 | 339647.128 |
| 30/05/2017 | 339647.128 |
| 31/05/2017 | 339647.128 |
| 01/06/2017 | 339647.128 |
| 02/06/2017 | 339647.128 |
| 05/06/2017 | 339647.128 |
| 06/06/2017 | 339647.128 |
| 07/06/2017 | 339647.128 |
| 08/06/2017 | 339647.128 |
| 09/06/2017 | 339647.128 |
| 12/06/2017 | 339647.128 |
| 13/06/2017 | 339647.128 |
| 14/06/2017 | 339647.128 |
| 15/06/2017 | 339647.128 |
| 16/06/2017 | 339647.128 |
| 19/06/2017 | 339647.128 |
| 20/06/2017 | 339647.128 |
| 21/06/2017 | 339647.128 |
| 22/06/2017 | 339647.128 |
| 23/06/2017 | 339647.128 |
| 26/06/2017 | 339647.128 |
| 27/06/2017 | 339647.128 |
| 28/06/2017 | 339647.128 |
| 29/06/2017 | 342194.481 |
| 30/06/2017 | 342194.481 |
| 03/07/2017 | 342331.359 |
| 05/07/2017 | 342331.359 |
| 06/07/2017 | 342331.359 |
| 07/07/2017 | 342331.359 |
| 10/07/2017 | 344351.114 |
| 11/07/2017 | 344351.114 |
| 12/07/2017 | 344351.114 |
| 13/07/2017 | 344351.114 |
| 14/07/2017 | 344351.114 |
| 17/07/2017 | 344351.114 |
| 18/07/2017 | 344351.114 |
| 19/07/2017 | 344351.114 |
| 20/07/2017 | 344351.114 |
| 21/07/2017 | 344351.114 |
| 24/07/2017 | 344351.114 |
| 25/07/2017 | 344351.114 |
| 26/07/2017 | 344351.114 |
| 27/07/2017 | 344351.114 |
| 28/07/2017 | 344351.114 |
| 31/07/2017 | 344351.114 |
| 01/08/2017 | 344351.114 |
| 02/08/2017 | 344351.114 |
| 03/08/2017 | 344351.114 |
| 04/08/2017 | 344351.114 |
| 07/08/2017 | 344351.114 |
| 08/08/2017 | 344351.114 |
| 09/08/2017 | 344351.114 |
| 10/08/2017 | 344351.114 |
| 11/08/2017 | 344351.114 |
| 14/08/2017 | 344695.465 |
| 15/08/2017 | 344695.465 |
| 16/08/2017 | 344695.465 |
| 17/08/2017 | 344695.465 |
| 18/08/2017 | 344695.465 |
| 21/08/2017 | 344316.3 |
| 22/08/2017 | 344316.3 |
| 23/08/2017 | 344316.3 |
| 24/08/2017 | 344316.3 |
| 25/08/2017 | 344316.3 |
| 28/08/2017 | 344316.3 |
| 29/08/2017 | 344316.3 |
| 30/08/2017 | 344316.3 |
| 31/08/2017 | 344316.3 |
| 01/09/2017 | 344316.3 |
| 05/09/2017 | 344316.3 |
| 06/09/2017 | 344316.3 |
| 07/09/2017 | 345142.659 |
| 08/09/2017 | 345142.659 |
| 11/09/2017 | 345142.659 |
| 12/09/2017 | 345142.659 |
| 13/09/2017 | 345142.659 |
| 14/09/2017 | 345142.659 |
| 15/09/2017 | 345142.659 |
| 18/09/2017 | 345142.659 |
| 19/09/2017 | 345142.659 |
| 20/09/2017 | 345142.659 |
| 21/09/2017 | 345142.659 |
| 22/09/2017 | 345142.659 |
| 25/09/2017 | 345142.659 |
| 26/09/2017 | 345142.659 |
| 27/09/2017 | 345142.659 |
| 28/09/2017 | 345142.659 |
| 29/09/2017 | 345142.659 |
| 02/10/2017 | 345142.659 |
| 03/10/2017 | 345142.659 |
| 04/10/2017 | 345142.659 |
| 05/10/2017 | 345142.659 |
| 06/10/2017 | 345142.659 |
| 09/10/2017 | 345142.659 |
| 10/10/2017 | 345142.659 |
| 11/10/2017 | 345142.659 |
| 12/10/2017 | 345142.659 |
| 13/10/2017 | 345142.659 |
| 16/10/2017 | 345142.659 |
| 17/10/2017 | 345142.659 |
| 18/10/2017 | 345142.659 |
| 19/10/2017 | 345142.659 |
| 20/10/2017 | 345142.659 |
| 23/10/2017 | 345142.659 |
| 24/10/2017 | 345142.659 |
| 25/10/2017 | 345142.659 |
| 26/10/2017 | 345142.659 |
| 27/10/2017 | 345142.659 |
| 30/10/2017 | 345142.659 |
| 31/10/2017 | 345142.659 |
| 01/11/2017 | 345142.659 |
| 02/11/2017 | 345142.659 |
| 03/11/2017 | 345142.659 |
| 06/11/2017 | 345142.659 |
| 07/11/2017 | 345142.659 |
| 08/11/2017 | 345142.659 |
| 09/11/2017 | 345142.659 |
| 10/11/2017 | 345142.659 |
| 13/11/2017 | 345142.659 |
| 14/11/2017 | 345142.659 |
| 15/11/2017 | 345142.659 |
| 16/11/2017 | 345142.659 |
| 17/11/2017 | 347834.772 |
| 20/11/2017 | 347834.772 |
| 21/11/2017 | 347834.772 |
| 22/11/2017 | 347834.772 |
| 24/11/2017 | 347834.772 |
| 27/11/2017 | 347834.772 |
| 28/11/2017 | 347834.772 |
| 29/11/2017 | 347834.772 |
| 30/11/2017 | 347834.772 |
| 01/12/2017 | 347834.772 |
| 04/12/2017 | 347834.772 |
| 05/12/2017 | 347834.772 |
| 06/12/2017 | 347834.772 |
| 07/12/2017 | 347834.772 |
| 08/12/2017 | 347834.772 |
| 11/12/2017 | 347834.772 |
| 12/12/2017 | 347834.772 |
| 13/12/2017 | 347834.772 |
| 14/12/2017 | 347834.772 |
| 15/12/2017 | 347834.772 |
| 18/12/2017 | 351278.336 |
| 19/12/2017 | 351278.336 |
| 20/12/2017 | 351278.336 |
| 21/12/2017 | 351278.336 |
| 22/12/2017 | 351278.336 |
| 26/12/2017 | 351278.336 |
| 27/12/2017 | 351278.336 |
| 28/12/2017 | 351278.336 |
| 29/12/2017 | 351278.336 |
| 02/01/2018 | 351278.336 |
| 03/01/2018 | 351278.336 |
| 04/01/2018 | 351278.336 |
| 05/01/2018 | 351278.336 |
| 08/01/2018 | 351278.336 |
| 09/01/2018 | 351278.336 |
| 10/01/2018 | 351278.336 |
| 11/01/2018 | 351278.336 |
| 12/01/2018 | 351278.336 |
| 16/01/2018 | 351278.336 |
| 17/01/2018 | 351278.336 |
| 18/01/2018 | 351278.336 |
| 19/01/2018 | 351278.336 |
| 22/01/2018 | 351278.336 |
| 23/01/2018 | 351278.336 |
| 24/01/2018 | 351278.336 |
| 25/01/2018 | 351278.336 |
| 26/01/2018 | 351278.336 |
| 29/01/2018 | 351278.336 |
| 30/01/2018 | 351278.336 |
| 31/01/2018 | 347695.297 |
| 01/02/2018 | 347834.375 |
| 02/02/2018 | 347834.375 |
| 05/02/2018 | 347834.375 |
| 06/02/2018 | 328912.185 |
| 07/02/2018 | 339897.852 |
| 08/02/2018 | 339897.852 |
| 09/02/2018 | 330312.733 |
| 12/02/2018 | 333582.829 |
| 13/02/2018 | 333582.829 |
| 14/02/2018 | 333582.829 |
| 15/02/2018 | 333582.829 |
| 16/02/2018 | 333582.829 |
| 20/02/2018 | 333582.829 |
| 21/02/2018 | 333582.829 |
| 22/02/2018 | 331681.407 |
| 23/02/2018 | 333273.478 |
| 26/02/2018 | 333273.478 |
| 27/02/2018 | 333273.478 |
| 28/02/2018 | 333273.478 |
| 01/03/2018 | 329240.868 |
| 02/03/2018 | 324796.117 |
| 05/03/2018 | 326257.699 |
| 06/03/2018 | 326257.699 |
| 07/03/2018 | 326257.699 |
| 08/03/2018 | 326257.699 |
| 09/03/2018 | 326257.699 |
| 12/03/2018 | 326257.699 |
| 13/03/2018 | 326257.699 |
| 14/03/2018 | 326257.699 |
| 15/03/2018 | 324039.147 |
| 16/03/2018 | 324201.166 |
| 19/03/2018 | 324201.166 |
| 20/03/2018 | 324201.166 |
| 21/03/2018 | 324298.427 |
| 22/03/2018 | 324298.427 |
| 23/03/2018 | 324298.427 |
| 26/03/2018 | 318655.634 |
| 27/03/2018 | 326303.369 |
| 28/03/2018 | 326303.369 |
| 29/03/2018 | 325259.199 |
| 02/04/2018 | 325259.199 |
| 03/04/2018 | 325259.199 |
| 04/04/2018 | 330138.087 |
| 05/04/2018 | 330138.087 |
| 06/04/2018 | 330138.087 |
| 09/04/2018 | 330138.087 |
| 10/04/2018 | 331821.791 |
| 11/04/2018 | 331821.791 |
| 12/04/2018 | 331821.791 |
| 13/04/2018 | 334741.823 |
| 16/04/2018 | 334741.823 |
| 17/04/2018 | 334741.823 |
| 18/04/2018 | 334741.823 |
| 19/04/2018 | 334741.823 |
| 20/04/2018 | 334741.823 |
| 23/04/2018 | 332030.414 |
| 24/04/2018 | 331997.211 |
| 25/04/2018 | 331997.211 |
| 26/04/2018 | 333159.201 |
| 27/04/2018 | 333159.201 |
| 30/04/2018 | 333159.201 |
| 01/05/2018 | 333159.201 |
| 02/05/2018 | 333825.519 |
| 03/05/2018 | 333825.519 |
| 04/05/2018 | 334359.64 |
| 07/05/2018 | 334359.64 |
| 08/05/2018 | 334359.64 |
| 09/05/2018 | 334359.64 |
| 10/05/2018 | 334359.64 |
| 11/05/2018 | 334359.64 |
| 14/05/2018 | 334359.64 |
| 15/05/2018 | 334359.64 |
| 16/05/2018 | 334359.64 |
| 17/05/2018 | 336098.31 |
| 18/05/2018 | 336098.31 |
| 21/05/2018 | 336098.31 |
| 22/05/2018 | 336098.31 |
| 23/05/2018 | 336098.31 |
| 24/05/2018 | 336098.31 |
| 25/05/2018 | 336098.31 |
| 29/05/2018 | 336098.31 |
| 30/05/2018 | 336098.31 |
| 31/05/2018 | 340165.1 |
| 01/06/2018 | 340165.1 |
| 04/06/2018 | 343736.834 |
| 05/06/2018 | 343736.834 |
| 06/06/2018 | 343736.834 |
| 07/06/2018 | 343736.834 |
| 08/06/2018 | 343736.834 |
| 11/06/2018 | 343736.834 |
| 12/06/2018 | 343736.834 |
| 13/06/2018 | 343736.834 |
| 14/06/2018 | 343736.834 |
| 15/06/2018 | 343736.834 |
| 18/06/2018 | 343736.834 |
| 19/06/2018 | 343736.834 |
| 20/06/2018 | 343736.834 |
| 21/06/2018 | 344458.681 |
| 22/06/2018 | 344458.681 |
| 25/06/2018 | 345354.273 |
| 26/06/2018 | 345354.273 |
| 27/06/2018 | 346148.588 |
| 28/06/2018 | 346148.588 |
| 29/06/2018 | 348017.791 |
| 02/07/2018 | 348017.791 |
| 03/07/2018 | 348017.791 |
| 05/07/2018 | 348017.791 |
| 06/07/2018 | 351289.158 |
| 09/07/2018 | 351289.158 |
| 10/07/2018 | 351289.158 |
| 11/07/2018 | 351289.158 |
| 12/07/2018 | 351289.158 |
| 13/07/2018 | 354415.631 |
| 16/07/2018 | 354415.631 |
| 17/07/2018 | 354415.631 |
| 18/07/2018 | 354415.631 |
| 19/07/2018 | 354415.631 |
| 20/07/2018 | 354415.631 |
| 23/07/2018 | 354415.631 |
| 24/07/2018 | 354415.631 |
| 25/07/2018 | 354415.631 |
| 26/07/2018 | 354415.631 |
| 27/07/2018 | 354415.631 |
| 30/07/2018 | 354415.631 |
| 31/07/2018 | 352608.112 |
| 01/08/2018 | 354371.152 |
| 02/08/2018 | 354371.152 |
| 03/08/2018 | 354371.152 |
| 06/08/2018 | 354371.152 |
| 07/08/2018 | 354371.152 |
| 08/08/2018 | 354371.152 |
| 09/08/2018 | 354371.152 |
| 10/08/2018 | 354371.152 |
| 13/08/2018 | 354371.152 |
| 14/08/2018 | 352953.668 |
| 15/08/2018 | 352953.668 |
| 16/08/2018 | 352953.668 |
| 17/08/2018 | 355918.478 |
| 20/08/2018 | 355918.478 |
| 21/08/2018 | 355918.478 |
| 22/08/2018 | 355918.478 |
| 23/08/2018 | 355918.478 |
| 24/08/2018 | 355918.478 |
| 27/08/2018 | 355918.478 |
| 28/08/2018 | 355918.478 |
| 29/08/2018 | 355918.478 |
| 30/08/2018 | 355918.478 |
| 31/08/2018 | 355918.478 |
| 04/09/2018 | 355918.478 |
| 05/09/2018 | 355918.478 |
| 06/09/2018 | 355918.478 |
| 07/09/2018 | 355918.478 |
| 10/09/2018 | 355918.478 |
| 11/09/2018 | 355918.478 |
| 12/09/2018 | 355918.478 |
| 13/09/2018 | 355918.478 |
| 14/09/2018 | 355918.478 |
| 17/09/2018 | 355918.478 |
| 18/09/2018 | 355918.478 |
| 19/09/2018 | 357840.438 |
| 20/09/2018 | 357840.438 |
| 21/09/2018 | 357840.438 |
| 24/09/2018 | 357840.438 |
| 25/09/2018 | 357840.438 |
| 26/09/2018 | 357840.438 |
| 27/09/2018 | 357840.438 |
| 28/09/2018 | 357840.438 |
| 01/10/2018 | 357840.438 |
| 02/10/2018 | 357840.438 |
| 03/10/2018 | 357840.438 |
| 04/10/2018 | 357840.438 |
| 05/10/2018 | 357840.438 |
| 08/10/2018 | 356122.804 |
| 09/10/2018 | 356122.804 |
| 10/10/2018 | 356122.804 |
| 11/10/2018 | 356122.804 |
| 12/10/2018 | 351528.82 |
| 15/10/2018 | 354516.815 |
| 16/10/2018 | 354516.815 |
| 17/10/2018 | 363486.09 |
| 18/10/2018 | 363486.09 |
| 19/10/2018 | 363486.09 |
| 22/10/2018 | 362868.164 |
| 23/10/2018 | 362868.164 |
| 24/10/2018 | 362868.164 |
| 25/10/2018 | 362868.164 |
| 26/10/2018 | 366170.264 |
| 29/10/2018 | 366170.264 |
| 30/10/2018 | 362545.179 |
| 31/10/2018 | 368345.901 |
| 01/11/2018 | 368345.901 |
| 02/11/2018 | 368345.901 |
| 05/11/2018 | 368345.901 |
| 06/11/2018 | 370445.473 |
| 07/11/2018 | 370445.473 |
| 08/11/2018 | 370445.473 |
| 09/11/2018 | 370445.473 |
| 12/11/2018 | 370445.473 |
| 13/11/2018 | 363518.143 |
| 14/11/2018 | 363481.791 |
| 15/11/2018 | 363481.791 |
| 16/11/2018 | 368388.795 |
| 19/11/2018 | 368388.795 |
| 20/11/2018 | 368388.795 |
| 21/11/2018 | 360615.792 |
| 23/11/2018 | 361877.947 |
| 26/11/2018 | 361877.947 |
| 27/11/2018 | 367523.243 |
| 28/11/2018 | 367523.243 |
| 29/11/2018 | 367523.243 |
| 30/11/2018 | 367523.243 |
| 03/12/2018 | 367523.243 |
| 04/12/2018 | 367523.243 |
| 06/12/2018 | 367523.243 |
| 07/12/2018 | 366053.15 |
| 10/12/2018 | 366053.15 |
| 11/12/2018 | 367041.493 |
| 12/12/2018 | 367041.493 |
| 13/12/2018 | 367041.493 |
| 14/12/2018 | 367041.493 |
| 17/12/2018 | 367041.493 |
| 18/12/2018 | 359957.593 |
| 19/12/2018 | 357581.872 |
| 20/12/2018 | 352933.308 |
| 21/12/2018 | 350321.602 |
| 24/12/2018 | 339917.05 |
| 26/12/2018 | 329651.555 |
| 27/12/2018 | 348112.042 |
| 28/12/2018 | 348112.042 |
| 31/12/2018 | 348112.042 |
| 02/01/2019 | 348112.042 |
| 03/01/2019 | 348112.042 |
| 04/01/2019 | 348112.042 |
| 07/01/2019 | 360156.719 |
| 08/01/2019 | 360156.719 |
| 09/01/2019 | 360156.719 |
| 10/01/2019 | 360156.719 |
| 11/01/2019 | 360156.719 |
| 14/01/2019 | 360156.719 |
| 15/01/2019 | 360156.719 |
| 16/01/2019 | 363686.255 |
| 17/01/2019 | 363686.255 |
| 18/01/2019 | 363686.255 |
| 22/01/2019 | 363686.255 |
| 23/01/2019 | 363686.255 |
| 24/01/2019 | 364559.102 |
| 25/01/2019 | 364559.102 |
| 28/01/2019 | 364559.102 |
| 29/01/2019 | 364559.102 |
| 30/01/2019 | 364303.91 |
| 31/01/2019 | 364303.91 |
| 01/02/2019 | 364303.91 |
| 04/02/2019 | 364303.91 |
| 05/02/2019 | 364303.91 |
| 06/02/2019 | 364303.91 |
| 07/02/2019 | 364303.91 |
| 08/02/2019 | 364303.91 |
| 11/02/2019 | 364595.353 |
| 12/02/2019 | 364595.353 |
| 13/02/2019 | 364595.353 |
| 14/02/2019 | 364595.353 |
| 15/02/2019 | 364595.353 |
| 19/02/2019 | 364595.353 |
| 20/02/2019 | 364595.353 |
| 21/02/2019 | 364595.353 |
| 22/02/2019 | 364595.353 |
| 25/02/2019 | 364595.353 |
| 26/02/2019 | 364595.353 |
| 27/02/2019 | 364595.353 |
| 28/02/2019 | 364595.353 |
| 01/03/2019 | 364595.353 |
| 04/03/2019 | 364595.353 |
| 05/03/2019 | 364595.353 |
| 06/03/2019 | 364595.353 |
| 07/03/2019 | 364595.353 |
| 08/03/2019 | 361715.05 |
| 11/03/2019 | 361317.164 |
| 12/03/2019 | 361317.164 |
| 13/03/2019 | 361317.164 |
| 14/03/2019 | 361317.164 |
| 15/03/2019 | 361317.164 |
| 18/03/2019 | 361317.164 |
| 19/03/2019 | 361317.164 |
| 20/03/2019 | 361317.164 |
| 21/03/2019 | 361317.164 |
| 22/03/2019 | 361317.164 |
| 25/03/2019 | 361317.164 |
| 26/03/2019 | 360811.32 |
| 27/03/2019 | 360811.32 |
| 28/03/2019 | 360811.32 |
| 29/03/2019 | 360811.32 |
| 01/04/2019 | 360811.32 |
| 02/04/2019 | 360811.32 |
| 03/04/2019 | 360811.32 |
| 04/04/2019 | 360811.32 |
| 05/04/2019 | 360811.32 |
| 08/04/2019 | 360811.32 |
| 09/04/2019 | 360811.32 |
| 10/04/2019 | 360811.32 |
| 11/04/2019 | 362326.727 |
| 12/04/2019 | 362326.727 |
| 15/04/2019 | 362326.727 |
| 16/04/2019 | 362326.727 |
| 17/04/2019 | 362326.727 |
| 18/04/2019 | 362326.727 |
| 22/04/2019 | 362326.727 |
| 23/04/2019 | 362326.727 |
| 24/04/2019 | 362326.727 |
| 25/04/2019 | 362326.727 |
| 26/04/2019 | 362326.727 |
| 29/04/2019 | 362326.727 |
| 30/04/2019 | 362326.727 |
| 01/05/2019 | 362326.727 |
| 02/05/2019 | 362326.727 |
| 03/05/2019 | 361638.306 |
| 06/05/2019 | 361638.306 |
| 07/05/2019 | 361638.306 |
| 08/05/2019 | 356430.715 |
| 09/05/2019 | 356002.998 |
| 10/05/2019 | 356002.998 |
| 13/05/2019 | 357783.013 |
| 14/05/2019 | 357783.013 |
| 15/05/2019 | 361969.074 |
| 16/05/2019 | 361969.074 |
| 17/05/2019 | 361969.074 |
| 20/05/2019 | 361969.074 |
| 21/05/2019 | 359652.472 |
| 22/05/2019 | 362457.761 |
| 23/05/2019 | 362457.761 |
| 24/05/2019 | 362457.761 |
| 28/05/2019 | 364052.575 |
| 29/05/2019 | 364052.575 |
| 30/05/2019 | 360776.102 |
| 31/05/2019 | 362147.051 |
| 03/06/2019 | 362147.051 |
| 04/06/2019 | 361748.69 |
| 05/06/2019 | 361748.69 |
| 06/06/2019 | 361748.69 |
| 07/06/2019 | 361748.69 |
| 10/06/2019 | 361748.69 |
| 11/06/2019 | 361748.69 |
| 12/06/2019 | 361748.69 |
| 13/06/2019 | 361748.69 |
| 14/06/2019 | 361748.69 |
| 17/06/2019 | 361748.69 |
| 18/06/2019 | 361748.69 |
| 19/06/2019 | 361748.69 |
| 20/06/2019 | 361748.69 |
| 21/06/2019 | 361748.69 |
| 24/06/2019 | 361748.69 |
| 25/06/2019 | 361748.69 |
| 26/06/2019 | 361748.69 |
| 27/06/2019 | 361242.242 |
| 28/06/2019 | 361242.242 |
| 01/07/2019 | 361242.242 |
| 02/07/2019 | 361242.242 |
| 03/07/2019 | 361242.242 |
| 05/07/2019 | 361242.242 |
| 08/07/2019 | 361242.242 |
| 09/07/2019 | 361242.242 |
| 10/07/2019 | 361242.242 |
| 11/07/2019 | 361242.242 |
| 12/07/2019 | 361242.242 |
| 15/07/2019 | 361242.242 |
| 16/07/2019 | 361242.242 |
| 17/07/2019 | 361242.242 |
| 18/07/2019 | 361242.242 |
| 19/07/2019 | 362795.583 |
| 22/07/2019 | 362795.583 |
| 23/07/2019 | 364283.045 |
| 24/07/2019 | 364283.045 |
| 25/07/2019 | 364283.045 |
| 26/07/2019 | 364283.045 |
| 29/07/2019 | 366505.172 |
| 30/07/2019 | 366505.172 |
| 31/07/2019 | 366505.172 |
| 01/08/2019 | 366505.172 |
| 02/08/2019 | 362730.168 |
| 05/08/2019 | 360299.876 |
| 06/08/2019 | 347509.231 |
| 07/08/2019 | 353243.133 |
| 08/08/2019 | 353243.133 |
| 09/08/2019 | 353243.133 |
| 12/08/2019 | 353243.133 |
| 13/08/2019 | 348403.702 |
| 14/08/2019 | 354744.649 |
| 15/08/2019 | 354744.649 |
| 16/08/2019 | 355737.934 |
| 19/08/2019 | 355737.934 |
| 20/08/2019 | 355737.934 |
| 21/08/2019 | 355737.934 |
| 22/08/2019 | 359615.478 |
| 23/08/2019 | 359615.478 |
| 26/08/2019 | 359615.478 |
| 27/08/2019 | 363175.671 |
| 28/08/2019 | 363175.671 |
| 29/08/2019 | 366298.982 |
| 30/08/2019 | 366298.982 |
| 03/09/2019 | 366298.982 |
| 04/09/2019 | 366298.982 |
| 05/09/2019 | 370474.79 |
| 06/09/2019 | 370474.79 |
| 09/09/2019 | 370474.79 |
| 10/09/2019 | 370474.79 |
| 11/09/2019 | 370474.79 |
| 12/09/2019 | 370474.79 |
| 13/09/2019 | 370474.79 |
| 16/09/2019 | 370474.79 |
| 17/09/2019 | 370474.79 |
| 18/09/2019 | 370474.79 |
| 19/09/2019 | 370474.79 |
| 20/09/2019 | 370474.79 |
| 23/09/2019 | 370474.79 |
| 24/09/2019 | 371400.977 |
| 25/09/2019 | 371400.977 |
| 26/09/2019 | 373443.683 |
| 27/09/2019 | 373443.683 |
| 30/09/2019 | 373443.683 |
| 01/10/2019 | 375348.245 |
| 02/10/2019 | 375348.245 |
| 03/10/2019 | 367916.35 |
| 04/10/2019 | 371963.43 |
| 07/10/2019 | 371963.43 |
| 08/10/2019 | 371963.43 |
| 09/10/2019 | 371963.43 |
| 10/10/2019 | 375422.69 |
| 11/10/2019 | 375422.69 |
| 14/10/2019 | 375422.69 |
| 15/10/2019 | 375422.69 |
| 16/10/2019 | 375422.69 |
| 17/10/2019 | 375422.69 |
| 18/10/2019 | 375422.69 |
| 21/10/2019 | 375422.69 |
| 22/10/2019 | 375422.69 |
| 23/10/2019 | 375422.69 |
| 24/10/2019 | 375422.69 |
| 25/10/2019 | 375422.69 |
| 28/10/2019 | 375422.69 |
| 29/10/2019 | 375422.69 |
| 30/10/2019 | 375422.69 |
| 31/10/2019 | 375422.69 |
| 01/11/2019 | 375422.69 |
| 04/11/2019 | 375422.69 |
| 05/11/2019 | 375422.69 |
| 06/11/2019 | 375422.69 |
| 07/11/2019 | 375422.69 |
| 08/11/2019 | 375422.69 |
| 11/11/2019 | 375422.69 |
| 12/11/2019 | 375422.69 |
| 13/11/2019 | 375422.69 |
| 14/11/2019 | 375422.69 |
| 15/11/2019 | 375422.69 |
| 18/11/2019 | 375422.69 |
| 19/11/2019 | 375422.69 |
| 20/11/2019 | 375422.69 |
| 21/11/2019 | 375422.69 |
| 22/11/2019 | 375422.69 |
| 25/11/2019 | 375422.69 |
| 26/11/2019 | 375422.69 |
| 27/11/2019 | 375422.69 |
| 29/11/2019 | 375422.69 |
| 02/12/2019 | 375422.69 |
| 03/12/2019 | 375422.69 |
| 04/12/2019 | 372569.477 |
| 05/12/2019 | 375028.436 |
| 06/12/2019 | 375028.436 |
| 09/12/2019 | 375028.436 |
| 10/12/2019 | 375028.436 |
| 11/12/2019 | 375028.436 |
| 12/12/2019 | 375028.436 |
| 13/12/2019 | 375028.436 |
| 16/12/2019 | 375028.436 |
| 17/12/2019 | 375028.436 |
| 18/12/2019 | 375028.436 |
| 19/12/2019 | 375028.436 |
| 20/12/2019 | 375028.436 |
| 23/12/2019 | 375028.436 |
| 24/12/2019 | 375028.436 |
| 26/12/2019 | 375028.436 |
| 27/12/2019 | 375028.436 |
| 30/12/2019 | 375028.436 |
| 31/12/2019 | 375028.436 |
| 02/01/2020 | 375028.436 |
| 03/01/2020 | 375028.436 |
| 06/01/2020 | 375028.436 |
| 07/01/2020 | 375966.007 |
| 08/01/2020 | 375966.007 |
| 09/01/2020 | 375966.007 |
| 10/01/2020 | 375966.007 |
| 13/01/2020 | 375966.007 |
| 14/01/2020 | 375966.007 |
| 15/01/2020 | 375966.007 |
| 16/01/2020 | 375966.007 |
| 17/01/2020 | 375966.007 |
| 21/01/2020 | 375966.007 |
| 22/01/2020 | 375966.007 |
| 23/01/2020 | 375966.007 |
| 24/01/2020 | 375966.007 |
| 27/01/2020 | 375966.007 |
| 28/01/2020 | 369687.375 |
| 29/01/2020 | 374197.561 |
| 30/01/2020 | 374197.561 |
| 31/01/2020 | 374197.561 |
| 03/02/2020 | 374197.561 |
| 04/02/2020 | 376742.104 |
| 05/02/2020 | 376742.104 |
| 06/02/2020 | 376742.104 |
| 07/02/2020 | 376742.104 |
| 10/02/2020 | 376742.104 |
| 11/02/2020 | 379906.738 |
| 12/02/2020 | 379906.738 |
| 13/02/2020 | 379906.738 |
| 14/02/2020 | 379906.738 |
| 18/02/2020 | 379906.738 |
| 19/02/2020 | 379906.738 |
| 20/02/2020 | 379906.738 |
| 21/02/2020 | 379906.738 |
| 24/02/2020 | 376487.577 |
| 25/02/2020 | 363536.405 |
| 26/02/2020 | 352812.081 |
| 27/02/2020 | 350271.834 |
| 28/02/2020 | 332723.215 |
| 02/03/2020 | 332024.496 |
| 03/03/2020 | 332024.496 |
| 04/03/2020 | 332024.496 |
| 05/03/2020 | 345305.476 |
| 06/03/2020 | 345305.476 |
| 09/03/2020 | 339297.161 |
| 10/03/2020 | 314121.311 |
| 11/03/2020 | 327879.825 |
| 12/03/2020 | 327879.825 |
| 13/03/2020 | 294796.75 |
| 16/03/2020 | 322478.165 |
| 17/03/2020 | 322478.165 |
| 18/03/2020 | 333281.184 |
| 19/03/2020 | 333281.184 |
| 20/03/2020 | 331514.794 |
| 23/03/2020 | 317325.96 |
| 24/03/2020 | 307742.716 |
| 25/03/2020 | 338424.665 |
| 26/03/2020 | 338424.665 |
| 27/03/2020 | 338424.665 |
| 30/03/2020 | 338424.665 |
| 31/03/2020 | 350303.371 |
| 01/04/2020 | 350303.371 |
| 02/04/2020 | 333453.779 |
| 03/04/2020 | 342923.866 |
| 06/04/2020 | 342923.866 |
| 07/04/2020 | 365625.426 |
| 08/04/2020 | 365625.426 |
| 09/04/2020 | 365625.426 |
| 13/04/2020 | 365625.426 |
| 14/04/2020 | 365625.426 |
| 15/04/2020 | 376886.689 |
| 16/04/2020 | 376886.689 |
| 17/04/2020 | 378620.368 |
| 20/04/2020 | 378620.368 |
| 21/04/2020 | 378620.368 |
| 22/04/2020 | 368435.48 |
| 23/04/2020 | 376172.625 |
| 24/04/2020 | 376172.625 |
| 27/04/2020 | 376172.625 |
| 28/04/2020 | 376172.625 |
| 29/04/2020 | 376172.625 |
| 30/04/2020 | 376172.625 |
| 01/05/2020 | 376172.625 |
| 04/05/2020 | 365564.557 |
| 05/05/2020 | 366039.791 |
| 06/05/2020 | 366039.791 |
| 07/05/2020 | 366039.791 |
| 08/05/2020 | 372116.052 |
| 11/05/2020 | 372116.052 |
| 12/05/2020 | 372116.052 |
| 13/05/2020 | 372116.052 |
| 14/05/2020 | 366906.427 |
| 15/05/2020 | 371419.376 |
| 18/05/2020 | 371419.376 |
| 19/05/2020 | 371419.376 |
| 20/05/2020 | 371419.376 |
| 21/05/2020 | 377844.931 |
| 22/05/2020 | 377844.931 |
| 26/05/2020 | 379923.078 |
| 27/05/2020 | 379923.078 |
| 28/05/2020 | 379923.078 |
| 29/05/2020 | 379923.078 |
| 01/06/2020 | 379923.078 |
| 02/06/2020 | 379923.078 |
| 03/06/2020 | 379923.078 |
| 04/06/2020 | 379923.078 |
| 05/06/2020 | 379923.078 |
| 08/06/2020 | 379923.078 |
| 09/06/2020 | 379923.078 |
| 10/06/2020 | 379923.078 |
| 11/06/2020 | 377567.555 |
| 12/06/2020 | 356499.286 |
| 15/06/2020 | 359422.58 |
| 16/06/2020 | 359422.58 |
| 17/06/2020 | 359422.58 |
| 18/06/2020 | 359422.58 |
| 19/06/2020 | 359422.58 |
| 22/06/2020 | 359422.58 |
| 23/06/2020 | 365496.821 |
| 24/06/2020 | 365496.821 |
| 25/06/2020 | 365496.821 |
| 26/06/2020 | 368128.398 |
| 29/06/2020 | 368128.398 |
| 30/06/2020 | 373171.757 |
| 01/07/2020 | 373171.757 |
| 02/07/2020 | 373171.757 |
| 06/07/2020 | 373171.757 |
| 07/07/2020 | 373171.757 |
| 08/07/2020 | 373171.757 |
| 09/07/2020 | 376418.352 |
| 10/07/2020 | 376418.352 |
| 13/07/2020 | 380935.372 |
| 14/07/2020 | 380935.372 |
| 15/07/2020 | 385239.942 |
| 16/07/2020 | 385239.942 |
| 17/07/2020 | 385239.942 |
| 20/07/2020 | 387628.429 |
| 21/07/2020 | 387628.429 |
| 22/07/2020 | 387628.429 |
| 23/07/2020 | 387628.429 |
| 24/07/2020 | 387628.429 |
| 27/07/2020 | 384798.742 |
| 28/07/2020 | 388223.451 |
| 29/07/2020 | 388223.451 |
| 30/07/2020 | 393037.421 |
| 31/07/2020 | 393037.421 |
| 03/08/2020 | 393037.421 |
| 04/08/2020 | 393037.421 |
| 05/08/2020 | 393037.421 |
| 06/08/2020 | 393037.421 |
| 07/08/2020 | 393037.421 |
| 10/08/2020 | 393037.421 |
| 11/08/2020 | 393037.421 |
| 12/08/2020 | 393037.421 |
| 13/08/2020 | 397793.174 |
| 14/08/2020 | 397793.174 |
| 17/08/2020 | 397793.174 |
| 18/08/2020 | 397793.174 |
| 19/08/2020 | 397793.174 |
| 20/08/2020 | 397793.174 |
| 21/08/2020 | 397793.174 |
| 24/08/2020 | 397793.174 |
| 25/08/2020 | 397793.174 |
| 26/08/2020 | 397793.174 |
| 27/08/2020 | 397793.174 |
| 28/08/2020 | 397793.174 |
| 31/08/2020 | 397793.174 |
| 01/09/2020 | 397793.174 |
| 02/09/2020 | 397793.174 |
| 03/09/2020 | 397793.174 |
| 04/09/2020 | 397793.174 |
| 08/09/2020 | 392701.422 |
| 09/09/2020 | 383198.047 |
| 10/09/2020 | 390708.729 |
| 11/09/2020 | 390708.729 |
| 14/09/2020 | 389927.311 |
| 15/09/2020 | 389927.311 |
| 16/09/2020 | 389927.311 |
| 17/09/2020 | 389927.311 |
| 18/09/2020 | 389927.311 |
| 21/09/2020 | 385872.067 |
| 22/09/2020 | 381048.667 |
| 23/09/2020 | 383868.427 |
| 24/09/2020 | 383868.427 |
| 25/09/2020 | 384674.55 |
| 28/09/2020 | 384674.55 |
| 29/09/2020 | 384674.55 |
| 30/09/2020 | 384674.55 |
| 01/10/2020 | 384674.55 |
| 02/10/2020 | 384674.55 |
| 05/10/2020 | 384674.55 |
| 06/10/2020 | 390906.278 |
| 07/10/2020 | 390906.278 |
| 08/10/2020 | 397160.779 |
| 09/10/2020 | 397160.779 |
| 12/10/2020 | 397160.779 |
| 13/10/2020 | 397160.779 |
| 14/10/2020 | 397160.779 |
| 15/10/2020 | 394460.085 |
| 16/10/2020 | 393828.949 |
| 19/10/2020 | 393828.949 |
| 20/10/2020 | 393828.949 |
| 21/10/2020 | 394931.67 |
| 22/10/2020 | 394931.67 |
| 23/10/2020 | 394931.67 |
| 26/10/2020 | 394931.67 |
| 27/10/2020 | 394931.67 |
| 28/10/2020 | 393707.382 |
| 29/10/2020 | 393707.382 |
| 30/10/2020 | 398392.5 |
| 02/11/2020 | 398392.5 |
| 03/11/2020 | 402774.817 |
| 04/11/2020 | 402774.817 |
| 05/11/2020 | 402774.817 |
| 06/11/2020 | 402774.817 |
| 09/11/2020 | 402774.817 |
| 10/11/2020 | 402774.817 |
| 11/11/2020 | 402774.817 |
| 12/11/2020 | 402774.817 |
| 13/11/2020 | 402774.817 |
| 16/11/2020 | 408453.942 |
| 17/11/2020 | 408453.942 |
| 18/11/2020 | 408453.942 |
| 19/11/2020 | 408453.942 |
| 20/11/2020 | 410169.449 |
| 23/11/2020 | 410169.449 |
| 24/11/2020 | 412671.482 |
| 25/11/2020 | 412671.482 |
| 27/11/2020 | 412671.482 |
| 30/11/2020 | 412671.482 |
| 01/12/2020 | 412671.482 |
| 02/12/2020 | 412671.482 |
| 03/12/2020 | 412671.482 |
| 04/12/2020 | 412671.482 |
| 07/12/2020 | 412671.482 |
| 08/12/2020 | 412671.482 |
| 09/12/2020 | 412671.482 |
| 10/12/2020 | 412671.482 |
| 11/12/2020 | 412217.544 |
| 14/12/2020 | 412217.544 |
| 15/12/2020 | 412217.544 |
| 16/12/2020 | 412217.544 |
| 17/12/2020 | 412217.544 |
| 18/12/2020 | 412217.544 |
| 21/12/2020 | 412217.544 |
| 22/12/2020 | 412217.544 |
| 23/12/2020 | 411269.443 |
| 24/12/2020 | 411269.443 |
| 28/12/2020 | 411269.443 |
| 29/12/2020 | 411269.443 |
| 30/12/2020 | 411269.443 |
| 31/12/2020 | 411269.443 |
| 04/01/2021 | 411269.443 |
| 05/01/2021 | 411269.443 |
| 06/01/2021 | 414189.456 |
| 07/01/2021 | 414189.456 |
| 08/01/2021 | 414189.456 |
| 11/01/2021 | 414189.456 |
| 12/01/2021 | 414189.456 |
| 13/01/2021 | 414479.389 |
| 14/01/2021 | 414479.389 |
| 15/01/2021 | 414479.389 |
| 19/01/2021 | 414479.389 |
| 20/01/2021 | 417587.985 |
| 21/01/2021 | 417587.985 |
| 22/01/2021 | 417587.985 |
| 25/01/2021 | 417587.985 |
| 26/01/2021 | 417587.985 |
| 27/01/2021 | 417587.985 |
| 28/01/2021 | 417587.985 |
| 29/01/2021 | 421513.312 |
| 01/02/2021 | 421513.312 |
| 02/02/2021 | 428426.13 |
| 03/02/2021 | 428426.13 |
| 04/02/2021 | 428426.13 |
| 05/02/2021 | 428426.13 |
| 08/02/2021 | 428426.13 |
| 09/02/2021 | 428426.13 |
| 10/02/2021 | 428426.13 |
| 11/02/2021 | 428426.13 |
| 12/02/2021 | 428426.13 |
| 16/02/2021 | 428426.13 |
| 17/02/2021 | 428426.13 |
| 18/02/2021 | 428426.13 |
| 19/02/2021 | 428426.13 |
| 22/02/2021 | 428426.13 |
| 23/02/2021 | 428426.13 |
| 24/02/2021 | 428940.241 |
| 25/02/2021 | 428940.241 |
| 26/02/2021 | 428940.241 |
| 01/03/2021 | 426838.434 |
| 02/03/2021 | 436911.821 |
| 03/03/2021 | 436911.821 |
| 04/03/2021 | 431144.585 |
| 05/03/2021 | 425324.133 |
| 08/03/2021 | 433660.486 |
| 09/03/2021 | 433660.486 |
| 10/03/2021 | 439818.465 |
| 11/03/2021 | 439818.465 |
| 12/03/2021 | 439818.465 |
| 15/03/2021 | 439818.465 |
| 16/03/2021 | 439818.465 |
| 17/03/2021 | 439818.465 |
| 18/03/2021 | 439818.465 |
| 19/03/2021 | 439818.465 |
| 22/03/2021 | 439114.756 |
| 23/03/2021 | 439114.756 |